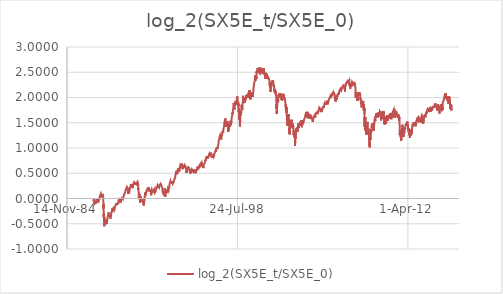
| Category | log_2(SX5E_t/SX5E_0) |
|---|---|
| 31777.0 | 0 |
| 31778.0 | 0 |
| 31779.0 | -0.015 |
| 31782.0 | -0.004 |
| 31783.0 | 0.002 |
| 31784.0 | -0.003 |
| 31785.0 | -0.022 |
| 31786.0 | -0.053 |
| 31789.0 | -0.035 |
| 31790.0 | -0.046 |
| 31791.0 | -0.04 |
| 31792.0 | -0.027 |
| 31793.0 | -0.028 |
| 31796.0 | -0.04 |
| 31797.0 | -0.042 |
| 31798.0 | -0.046 |
| 31799.0 | -0.039 |
| 31800.0 | -0.028 |
| 31803.0 | -0.049 |
| 31804.0 | -0.053 |
| 31805.0 | -0.103 |
| 31806.0 | -0.088 |
| 31807.0 | -0.068 |
| 31810.0 | -0.085 |
| 31811.0 | -0.102 |
| 31812.0 | -0.103 |
| 31813.0 | -0.113 |
| 31814.0 | -0.097 |
| 31817.0 | -0.093 |
| 31818.0 | -0.104 |
| 31819.0 | -0.105 |
| 31820.0 | -0.1 |
| 31821.0 | -0.098 |
| 31824.0 | -0.094 |
| 31825.0 | -0.112 |
| 31826.0 | -0.111 |
| 31827.0 | -0.094 |
| 31828.0 | -0.092 |
| 31831.0 | -0.102 |
| 31832.0 | -0.104 |
| 31833.0 | -0.112 |
| 31834.0 | -0.104 |
| 31835.0 | -0.099 |
| 31838.0 | -0.096 |
| 31839.0 | -0.107 |
| 31840.0 | -0.086 |
| 31841.0 | -0.075 |
| 31842.0 | -0.076 |
| 31845.0 | -0.072 |
| 31846.0 | -0.082 |
| 31847.0 | -0.093 |
| 31848.0 | -0.081 |
| 31849.0 | -0.075 |
| 31852.0 | -0.075 |
| 31853.0 | -0.086 |
| 31854.0 | -0.076 |
| 31855.0 | -0.097 |
| 31856.0 | -0.087 |
| 31859.0 | -0.066 |
| 31860.0 | -0.056 |
| 31861.0 | -0.053 |
| 31862.0 | -0.042 |
| 31863.0 | -0.029 |
| 31866.0 | -0.038 |
| 31867.0 | -0.051 |
| 31868.0 | -0.027 |
| 31869.0 | -0.02 |
| 31870.0 | -0.019 |
| 31873.0 | 0 |
| 31874.0 | -0.007 |
| 31875.0 | -0.009 |
| 31876.0 | -0.008 |
| 31877.0 | -0.026 |
| 31880.0 | -0.042 |
| 31881.0 | -0.032 |
| 31882.0 | -0.02 |
| 31883.0 | -0.009 |
| 31884.0 | -0.008 |
| 31887.0 | -0.012 |
| 31888.0 | -0.018 |
| 31889.0 | -0.001 |
| 31890.0 | -0.007 |
| 31891.0 | -0.016 |
| 31894.0 | -0.047 |
| 31895.0 | -0.035 |
| 31896.0 | -0.027 |
| 31897.0 | -0.031 |
| 31898.0 | -0.028 |
| 31901.0 | -0.033 |
| 31902.0 | -0.041 |
| 31903.0 | -0.032 |
| 31904.0 | -0.029 |
| 31905.0 | -0.029 |
| 31908.0 | -0.022 |
| 31909.0 | -0.034 |
| 31910.0 | -0.029 |
| 31911.0 | -0.029 |
| 31912.0 | -0.057 |
| 31915.0 | -0.052 |
| 31916.0 | -0.057 |
| 31917.0 | -0.073 |
| 31918.0 | -0.077 |
| 31919.0 | -0.071 |
| 31922.0 | -0.072 |
| 31923.0 | -0.059 |
| 31924.0 | -0.051 |
| 31925.0 | -0.051 |
| 31926.0 | -0.056 |
| 31929.0 | -0.046 |
| 31930.0 | -0.062 |
| 31931.0 | -0.059 |
| 31932.0 | -0.051 |
| 31933.0 | -0.059 |
| 31936.0 | -0.057 |
| 31937.0 | -0.062 |
| 31938.0 | -0.066 |
| 31939.0 | -0.053 |
| 31940.0 | -0.051 |
| 31943.0 | -0.034 |
| 31944.0 | -0.025 |
| 31945.0 | -0.024 |
| 31946.0 | -0.025 |
| 31947.0 | -0.006 |
| 31950.0 | 0.013 |
| 31951.0 | 0.023 |
| 31952.0 | 0.001 |
| 31953.0 | 0.005 |
| 31954.0 | 0.014 |
| 31957.0 | 0.014 |
| 31958.0 | 0.007 |
| 31959.0 | -0.01 |
| 31960.0 | 0.005 |
| 31961.0 | 0.027 |
| 31964.0 | 0.028 |
| 31965.0 | 0.026 |
| 31966.0 | 0.035 |
| 31967.0 | 0.032 |
| 31968.0 | 0.033 |
| 31971.0 | 0.033 |
| 31972.0 | 0.04 |
| 31973.0 | 0.044 |
| 31974.0 | 0.049 |
| 31975.0 | 0.063 |
| 31978.0 | 0.07 |
| 31979.0 | 0.064 |
| 31980.0 | 0.057 |
| 31981.0 | 0.049 |
| 31982.0 | 0.051 |
| 31985.0 | 0.057 |
| 31986.0 | 0.064 |
| 31987.0 | 0.076 |
| 31988.0 | 0.088 |
| 31989.0 | 0.086 |
| 31992.0 | 0.091 |
| 31993.0 | 0.088 |
| 31994.0 | 0.085 |
| 31995.0 | 0.094 |
| 31996.0 | 0.096 |
| 31999.0 | 0.095 |
| 32000.0 | 0.081 |
| 32001.0 | 0.094 |
| 32002.0 | 0.091 |
| 32003.0 | 0.094 |
| 32006.0 | 0.09 |
| 32007.0 | 0.076 |
| 32008.0 | 0.062 |
| 32009.0 | 0.076 |
| 32010.0 | 0.077 |
| 32013.0 | 0.064 |
| 32014.0 | 0.064 |
| 32015.0 | 0.065 |
| 32016.0 | 0.066 |
| 32017.0 | 0.073 |
| 32020.0 | 0.078 |
| 32021.0 | 0.082 |
| 32022.0 | 0.072 |
| 32023.0 | 0.061 |
| 32024.0 | 0.047 |
| 32027.0 | 0.03 |
| 32028.0 | 0.03 |
| 32029.0 | 0.03 |
| 32030.0 | 0.043 |
| 32031.0 | 0.051 |
| 32034.0 | 0.063 |
| 32035.0 | 0.056 |
| 32036.0 | 0.047 |
| 32037.0 | 0.052 |
| 32038.0 | 0.044 |
| 32041.0 | 0.041 |
| 32042.0 | 0.034 |
| 32043.0 | 0.058 |
| 32044.0 | 0.048 |
| 32045.0 | 0.043 |
| 32048.0 | 0.052 |
| 32049.0 | 0.056 |
| 32050.0 | 0.047 |
| 32051.0 | 0.059 |
| 32052.0 | 0.068 |
| 32055.0 | 0.076 |
| 32056.0 | 0.069 |
| 32057.0 | 0.055 |
| 32058.0 | 0.062 |
| 32059.0 | 0.041 |
| 32062.0 | 0.03 |
| 32063.0 | 0.033 |
| 32064.0 | 0.025 |
| 32065.0 | 0.002 |
| 32066.0 | -0.011 |
| 32069.0 | -0.13 |
| 32070.0 | -0.202 |
| 32071.0 | -0.116 |
| 32072.0 | -0.171 |
| 32073.0 | -0.192 |
| 32076.0 | -0.295 |
| 32077.0 | -0.281 |
| 32078.0 | -0.361 |
| 32079.0 | -0.382 |
| 32080.0 | -0.302 |
| 32083.0 | -0.312 |
| 32084.0 | -0.338 |
| 32085.0 | -0.386 |
| 32086.0 | -0.401 |
| 32087.0 | -0.399 |
| 32090.0 | -0.462 |
| 32091.0 | -0.549 |
| 32092.0 | -0.51 |
| 32093.0 | -0.414 |
| 32094.0 | -0.417 |
| 32097.0 | -0.374 |
| 32098.0 | -0.41 |
| 32099.0 | -0.413 |
| 32100.0 | -0.428 |
| 32101.0 | -0.464 |
| 32104.0 | -0.453 |
| 32105.0 | -0.414 |
| 32106.0 | -0.416 |
| 32107.0 | -0.425 |
| 32108.0 | -0.416 |
| 32111.0 | -0.453 |
| 32112.0 | -0.46 |
| 32113.0 | -0.46 |
| 32114.0 | -0.469 |
| 32115.0 | -0.503 |
| 32118.0 | -0.506 |
| 32119.0 | -0.497 |
| 32120.0 | -0.492 |
| 32121.0 | -0.491 |
| 32122.0 | -0.502 |
| 32125.0 | -0.494 |
| 32126.0 | -0.474 |
| 32127.0 | -0.446 |
| 32128.0 | -0.441 |
| 32129.0 | -0.452 |
| 32132.0 | -0.437 |
| 32133.0 | -0.432 |
| 32134.0 | -0.421 |
| 32135.0 | -0.424 |
| 32136.0 | -0.424 |
| 32139.0 | -0.441 |
| 32140.0 | -0.467 |
| 32141.0 | -0.457 |
| 32142.0 | -0.475 |
| 32143.0 | -0.475 |
| 32146.0 | -0.508 |
| 32147.0 | -0.452 |
| 32148.0 | -0.437 |
| 32149.0 | -0.429 |
| 32150.0 | -0.417 |
| 32153.0 | -0.471 |
| 32154.0 | -0.473 |
| 32155.0 | -0.495 |
| 32156.0 | -0.487 |
| 32157.0 | -0.48 |
| 32160.0 | -0.445 |
| 32161.0 | -0.474 |
| 32162.0 | -0.497 |
| 32163.0 | -0.508 |
| 32164.0 | -0.502 |
| 32167.0 | -0.502 |
| 32168.0 | -0.493 |
| 32169.0 | -0.499 |
| 32170.0 | -0.508 |
| 32171.0 | -0.502 |
| 32174.0 | -0.494 |
| 32175.0 | -0.495 |
| 32176.0 | -0.482 |
| 32177.0 | -0.463 |
| 32178.0 | -0.458 |
| 32181.0 | -0.448 |
| 32182.0 | -0.466 |
| 32183.0 | -0.453 |
| 32184.0 | -0.421 |
| 32185.0 | -0.409 |
| 32188.0 | -0.392 |
| 32189.0 | -0.388 |
| 32190.0 | -0.371 |
| 32191.0 | -0.37 |
| 32192.0 | -0.372 |
| 32195.0 | -0.36 |
| 32196.0 | -0.355 |
| 32197.0 | -0.349 |
| 32198.0 | -0.339 |
| 32199.0 | -0.353 |
| 32202.0 | -0.346 |
| 32203.0 | -0.332 |
| 32204.0 | -0.328 |
| 32205.0 | -0.33 |
| 32206.0 | -0.341 |
| 32209.0 | -0.363 |
| 32210.0 | -0.343 |
| 32211.0 | -0.336 |
| 32212.0 | -0.324 |
| 32213.0 | -0.337 |
| 32216.0 | -0.335 |
| 32217.0 | -0.334 |
| 32218.0 | -0.32 |
| 32219.0 | -0.35 |
| 32220.0 | -0.277 |
| 32223.0 | -0.283 |
| 32224.0 | -0.303 |
| 32225.0 | -0.301 |
| 32226.0 | -0.305 |
| 32227.0 | -0.324 |
| 32230.0 | -0.363 |
| 32231.0 | -0.351 |
| 32232.0 | -0.351 |
| 32233.0 | -0.361 |
| 32234.0 | -0.361 |
| 32237.0 | -0.365 |
| 32238.0 | -0.37 |
| 32239.0 | -0.349 |
| 32240.0 | -0.338 |
| 32241.0 | -0.339 |
| 32244.0 | -0.317 |
| 32245.0 | -0.307 |
| 32246.0 | -0.301 |
| 32247.0 | -0.312 |
| 32248.0 | -0.339 |
| 32251.0 | -0.34 |
| 32252.0 | -0.33 |
| 32253.0 | -0.34 |
| 32254.0 | -0.347 |
| 32255.0 | -0.34 |
| 32258.0 | -0.334 |
| 32259.0 | -0.331 |
| 32260.0 | -0.334 |
| 32261.0 | -0.328 |
| 32262.0 | -0.342 |
| 32265.0 | -0.344 |
| 32266.0 | -0.352 |
| 32267.0 | -0.342 |
| 32268.0 | -0.346 |
| 32269.0 | -0.349 |
| 32272.0 | -0.375 |
| 32273.0 | -0.381 |
| 32274.0 | -0.4 |
| 32275.0 | -0.405 |
| 32276.0 | -0.408 |
| 32279.0 | -0.378 |
| 32280.0 | -0.364 |
| 32281.0 | -0.369 |
| 32282.0 | -0.392 |
| 32283.0 | -0.383 |
| 32286.0 | -0.388 |
| 32287.0 | -0.385 |
| 32288.0 | -0.367 |
| 32289.0 | -0.369 |
| 32290.0 | -0.372 |
| 32293.0 | -0.359 |
| 32294.0 | -0.341 |
| 32295.0 | -0.314 |
| 32296.0 | -0.279 |
| 32297.0 | -0.299 |
| 32300.0 | -0.29 |
| 32301.0 | -0.297 |
| 32302.0 | -0.291 |
| 32303.0 | -0.265 |
| 32304.0 | -0.266 |
| 32307.0 | -0.271 |
| 32308.0 | -0.264 |
| 32309.0 | -0.26 |
| 32310.0 | -0.274 |
| 32311.0 | -0.269 |
| 32314.0 | -0.273 |
| 32315.0 | -0.268 |
| 32316.0 | -0.256 |
| 32317.0 | -0.246 |
| 32318.0 | -0.238 |
| 32321.0 | -0.24 |
| 32322.0 | -0.251 |
| 32323.0 | -0.244 |
| 32324.0 | -0.244 |
| 32325.0 | -0.227 |
| 32328.0 | -0.224 |
| 32329.0 | -0.216 |
| 32330.0 | -0.193 |
| 32331.0 | -0.202 |
| 32332.0 | -0.202 |
| 32335.0 | -0.206 |
| 32336.0 | -0.223 |
| 32337.0 | -0.232 |
| 32338.0 | -0.225 |
| 32339.0 | -0.217 |
| 32342.0 | -0.222 |
| 32343.0 | -0.231 |
| 32344.0 | -0.223 |
| 32345.0 | -0.222 |
| 32346.0 | -0.234 |
| 32349.0 | -0.236 |
| 32350.0 | -0.222 |
| 32351.0 | -0.216 |
| 32352.0 | -0.224 |
| 32353.0 | -0.208 |
| 32356.0 | -0.196 |
| 32357.0 | -0.195 |
| 32358.0 | -0.198 |
| 32359.0 | -0.199 |
| 32360.0 | -0.188 |
| 32363.0 | -0.197 |
| 32364.0 | -0.192 |
| 32365.0 | -0.217 |
| 32366.0 | -0.234 |
| 32367.0 | -0.22 |
| 32370.0 | -0.226 |
| 32371.0 | -0.232 |
| 32372.0 | -0.216 |
| 32373.0 | -0.212 |
| 32374.0 | -0.218 |
| 32377.0 | -0.22 |
| 32378.0 | -0.232 |
| 32379.0 | -0.226 |
| 32380.0 | -0.241 |
| 32381.0 | -0.244 |
| 32384.0 | -0.25 |
| 32385.0 | -0.246 |
| 32386.0 | -0.242 |
| 32387.0 | -0.249 |
| 32388.0 | -0.254 |
| 32391.0 | -0.24 |
| 32392.0 | -0.236 |
| 32393.0 | -0.23 |
| 32394.0 | -0.22 |
| 32395.0 | -0.229 |
| 32398.0 | -0.215 |
| 32399.0 | -0.208 |
| 32400.0 | -0.19 |
| 32401.0 | -0.182 |
| 32402.0 | -0.182 |
| 32405.0 | -0.174 |
| 32406.0 | -0.175 |
| 32407.0 | -0.165 |
| 32408.0 | -0.161 |
| 32409.0 | -0.167 |
| 32412.0 | -0.161 |
| 32413.0 | -0.166 |
| 32414.0 | -0.169 |
| 32415.0 | -0.157 |
| 32416.0 | -0.155 |
| 32419.0 | -0.155 |
| 32420.0 | -0.149 |
| 32421.0 | -0.145 |
| 32422.0 | -0.141 |
| 32423.0 | -0.138 |
| 32426.0 | -0.129 |
| 32427.0 | -0.139 |
| 32428.0 | -0.149 |
| 32429.0 | -0.136 |
| 32430.0 | -0.13 |
| 32433.0 | -0.126 |
| 32434.0 | -0.112 |
| 32435.0 | -0.105 |
| 32436.0 | -0.114 |
| 32437.0 | -0.114 |
| 32440.0 | -0.116 |
| 32441.0 | -0.114 |
| 32442.0 | -0.09 |
| 32443.0 | -0.107 |
| 32444.0 | -0.098 |
| 32447.0 | -0.105 |
| 32448.0 | -0.096 |
| 32449.0 | -0.103 |
| 32450.0 | -0.106 |
| 32451.0 | -0.104 |
| 32454.0 | -0.117 |
| 32455.0 | -0.106 |
| 32456.0 | -0.113 |
| 32457.0 | -0.117 |
| 32458.0 | -0.124 |
| 32461.0 | -0.133 |
| 32462.0 | -0.136 |
| 32463.0 | -0.132 |
| 32464.0 | -0.137 |
| 32465.0 | -0.127 |
| 32468.0 | -0.132 |
| 32469.0 | -0.132 |
| 32470.0 | -0.121 |
| 32471.0 | -0.118 |
| 32472.0 | -0.123 |
| 32475.0 | -0.132 |
| 32476.0 | -0.13 |
| 32477.0 | -0.121 |
| 32478.0 | -0.121 |
| 32479.0 | -0.126 |
| 32482.0 | -0.129 |
| 32483.0 | -0.123 |
| 32484.0 | -0.111 |
| 32485.0 | -0.112 |
| 32486.0 | -0.095 |
| 32489.0 | -0.108 |
| 32490.0 | -0.108 |
| 32491.0 | -0.113 |
| 32492.0 | -0.114 |
| 32493.0 | -0.102 |
| 32496.0 | -0.089 |
| 32497.0 | -0.076 |
| 32498.0 | -0.078 |
| 32499.0 | -0.095 |
| 32500.0 | -0.073 |
| 32503.0 | -0.074 |
| 32504.0 | -0.065 |
| 32505.0 | -0.068 |
| 32506.0 | -0.065 |
| 32507.0 | -0.065 |
| 32510.0 | -0.057 |
| 32511.0 | -0.047 |
| 32512.0 | -0.04 |
| 32513.0 | -0.028 |
| 32514.0 | -0.027 |
| 32517.0 | -0.024 |
| 32518.0 | -0.032 |
| 32519.0 | -0.031 |
| 32520.0 | -0.026 |
| 32521.0 | -0.025 |
| 32524.0 | -0.025 |
| 32525.0 | -0.031 |
| 32526.0 | -0.033 |
| 32527.0 | -0.02 |
| 32528.0 | -0.025 |
| 32531.0 | -0.034 |
| 32532.0 | -0.024 |
| 32533.0 | -0.013 |
| 32534.0 | -0.021 |
| 32535.0 | -0.016 |
| 32538.0 | -0.021 |
| 32539.0 | -0.032 |
| 32540.0 | -0.041 |
| 32541.0 | -0.037 |
| 32542.0 | -0.027 |
| 32545.0 | -0.025 |
| 32546.0 | -0.027 |
| 32547.0 | -0.015 |
| 32548.0 | -0.019 |
| 32549.0 | -0.021 |
| 32552.0 | -0.039 |
| 32553.0 | -0.036 |
| 32554.0 | -0.049 |
| 32555.0 | -0.045 |
| 32556.0 | -0.051 |
| 32559.0 | -0.039 |
| 32560.0 | -0.042 |
| 32561.0 | -0.055 |
| 32562.0 | -0.072 |
| 32563.0 | -0.06 |
| 32566.0 | -0.092 |
| 32567.0 | -0.079 |
| 32568.0 | -0.067 |
| 32569.0 | -0.066 |
| 32570.0 | -0.048 |
| 32573.0 | -0.035 |
| 32574.0 | -0.037 |
| 32575.0 | -0.046 |
| 32576.0 | -0.044 |
| 32577.0 | -0.049 |
| 32580.0 | -0.046 |
| 32581.0 | -0.04 |
| 32582.0 | -0.031 |
| 32583.0 | -0.029 |
| 32584.0 | -0.034 |
| 32587.0 | -0.078 |
| 32588.0 | -0.042 |
| 32589.0 | -0.042 |
| 32590.0 | -0.041 |
| 32591.0 | -0.04 |
| 32594.0 | -0.044 |
| 32595.0 | -0.041 |
| 32596.0 | -0.033 |
| 32597.0 | -0.03 |
| 32598.0 | -0.027 |
| 32601.0 | -0.016 |
| 32602.0 | -0.014 |
| 32603.0 | -0.012 |
| 32604.0 | -0.018 |
| 32605.0 | -0.015 |
| 32608.0 | -0.008 |
| 32609.0 | -0.002 |
| 32610.0 | 0.003 |
| 32611.0 | 0.002 |
| 32612.0 | 0.007 |
| 32615.0 | 0.014 |
| 32616.0 | 0.017 |
| 32617.0 | 0.018 |
| 32618.0 | 0.013 |
| 32619.0 | 0.013 |
| 32622.0 | 0.013 |
| 32623.0 | 0.006 |
| 32624.0 | 0.001 |
| 32625.0 | 0.002 |
| 32626.0 | 0.001 |
| 32629.0 | 0 |
| 32630.0 | -0.003 |
| 32631.0 | -0.005 |
| 32632.0 | -0.006 |
| 32633.0 | 0.006 |
| 32636.0 | -0.001 |
| 32637.0 | -0.003 |
| 32638.0 | -0.007 |
| 32639.0 | -0.011 |
| 32640.0 | -0.013 |
| 32643.0 | -0.015 |
| 32644.0 | -0.015 |
| 32645.0 | -0.017 |
| 32646.0 | -0.008 |
| 32647.0 | -0.004 |
| 32650.0 | 0.002 |
| 32651.0 | 0.006 |
| 32652.0 | 0.008 |
| 32653.0 | 0.02 |
| 32654.0 | 0.022 |
| 32657.0 | 0.031 |
| 32658.0 | 0.036 |
| 32659.0 | 0.036 |
| 32660.0 | 0.038 |
| 32661.0 | 0.04 |
| 32664.0 | 0.047 |
| 32665.0 | 0.045 |
| 32666.0 | 0.052 |
| 32667.0 | 0.061 |
| 32668.0 | 0.063 |
| 32671.0 | 0.069 |
| 32672.0 | 0.069 |
| 32673.0 | 0.073 |
| 32674.0 | 0.065 |
| 32675.0 | 0.066 |
| 32678.0 | 0.075 |
| 32679.0 | 0.089 |
| 32680.0 | 0.087 |
| 32681.0 | 0.09 |
| 32682.0 | 0.089 |
| 32685.0 | 0.096 |
| 32686.0 | 0.092 |
| 32687.0 | 0.101 |
| 32688.0 | 0.097 |
| 32689.0 | 0.082 |
| 32692.0 | 0.09 |
| 32693.0 | 0.097 |
| 32694.0 | 0.086 |
| 32695.0 | 0.087 |
| 32696.0 | 0.094 |
| 32699.0 | 0.1 |
| 32700.0 | 0.109 |
| 32701.0 | 0.108 |
| 32702.0 | 0.118 |
| 32703.0 | 0.123 |
| 32706.0 | 0.121 |
| 32707.0 | 0.123 |
| 32708.0 | 0.13 |
| 32709.0 | 0.138 |
| 32710.0 | 0.141 |
| 32713.0 | 0.127 |
| 32714.0 | 0.135 |
| 32715.0 | 0.143 |
| 32716.0 | 0.147 |
| 32717.0 | 0.146 |
| 32720.0 | 0.148 |
| 32721.0 | 0.16 |
| 32722.0 | 0.163 |
| 32723.0 | 0.157 |
| 32724.0 | 0.174 |
| 32727.0 | 0.177 |
| 32728.0 | 0.18 |
| 32729.0 | 0.183 |
| 32730.0 | 0.177 |
| 32731.0 | 0.183 |
| 32734.0 | 0.179 |
| 32735.0 | 0.168 |
| 32736.0 | 0.178 |
| 32737.0 | 0.18 |
| 32738.0 | 0.176 |
| 32741.0 | 0.186 |
| 32742.0 | 0.181 |
| 32743.0 | 0.18 |
| 32744.0 | 0.188 |
| 32745.0 | 0.203 |
| 32748.0 | 0.2 |
| 32749.0 | 0.195 |
| 32750.0 | 0.199 |
| 32751.0 | 0.205 |
| 32752.0 | 0.208 |
| 32755.0 | 0.22 |
| 32756.0 | 0.23 |
| 32757.0 | 0.219 |
| 32758.0 | 0.228 |
| 32759.0 | 0.233 |
| 32762.0 | 0.228 |
| 32763.0 | 0.224 |
| 32764.0 | 0.22 |
| 32765.0 | 0.219 |
| 32766.0 | 0.217 |
| 32769.0 | 0.222 |
| 32770.0 | 0.217 |
| 32771.0 | 0.215 |
| 32772.0 | 0.215 |
| 32773.0 | 0.224 |
| 32776.0 | 0.222 |
| 32777.0 | 0.215 |
| 32778.0 | 0.21 |
| 32779.0 | 0.209 |
| 32780.0 | 0.197 |
| 32783.0 | 0.19 |
| 32784.0 | 0.207 |
| 32785.0 | 0.211 |
| 32786.0 | 0.209 |
| 32787.0 | 0.218 |
| 32790.0 | 0.229 |
| 32791.0 | 0.228 |
| 32792.0 | 0.211 |
| 32793.0 | 0.211 |
| 32794.0 | 0.201 |
| 32797.0 | 0.093 |
| 32798.0 | 0.123 |
| 32799.0 | 0.127 |
| 32800.0 | 0.153 |
| 32801.0 | 0.15 |
| 32804.0 | 0.153 |
| 32805.0 | 0.127 |
| 32806.0 | 0.112 |
| 32807.0 | 0.109 |
| 32808.0 | 0.09 |
| 32811.0 | 0.101 |
| 32812.0 | 0.107 |
| 32813.0 | 0.11 |
| 32814.0 | 0.107 |
| 32815.0 | 0.094 |
| 32818.0 | 0.09 |
| 32819.0 | 0.073 |
| 32820.0 | 0.084 |
| 32821.0 | 0.092 |
| 32822.0 | 0.108 |
| 32825.0 | 0.125 |
| 32826.0 | 0.119 |
| 32827.0 | 0.112 |
| 32828.0 | 0.129 |
| 32829.0 | 0.13 |
| 32832.0 | 0.136 |
| 32833.0 | 0.129 |
| 32834.0 | 0.137 |
| 32835.0 | 0.146 |
| 32836.0 | 0.159 |
| 32839.0 | 0.165 |
| 32840.0 | 0.165 |
| 32841.0 | 0.171 |
| 32842.0 | 0.184 |
| 32843.0 | 0.199 |
| 32846.0 | 0.214 |
| 32847.0 | 0.208 |
| 32848.0 | 0.22 |
| 32849.0 | 0.223 |
| 32850.0 | 0.222 |
| 32853.0 | 0.219 |
| 32854.0 | 0.218 |
| 32855.0 | 0.216 |
| 32856.0 | 0.212 |
| 32857.0 | 0.215 |
| 32860.0 | 0.211 |
| 32861.0 | 0.205 |
| 32862.0 | 0.221 |
| 32863.0 | 0.232 |
| 32864.0 | 0.235 |
| 32867.0 | 0.235 |
| 32868.0 | 0.24 |
| 32869.0 | 0.265 |
| 32870.0 | 0.282 |
| 32871.0 | 0.286 |
| 32874.0 | 0.286 |
| 32875.0 | 0.29 |
| 32876.0 | 0.305 |
| 32877.0 | 0.305 |
| 32878.0 | 0.288 |
| 32881.0 | 0.294 |
| 32882.0 | 0.3 |
| 32883.0 | 0.288 |
| 32884.0 | 0.303 |
| 32885.0 | 0.289 |
| 32888.0 | 0.28 |
| 32889.0 | 0.258 |
| 32890.0 | 0.269 |
| 32891.0 | 0.25 |
| 32892.0 | 0.247 |
| 32895.0 | 0.248 |
| 32896.0 | 0.251 |
| 32897.0 | 0.219 |
| 32898.0 | 0.237 |
| 32899.0 | 0.237 |
| 32902.0 | 0.24 |
| 32903.0 | 0.245 |
| 32904.0 | 0.248 |
| 32905.0 | 0.264 |
| 32906.0 | 0.287 |
| 32909.0 | 0.303 |
| 32910.0 | 0.3 |
| 32911.0 | 0.28 |
| 32912.0 | 0.291 |
| 32913.0 | 0.277 |
| 32916.0 | 0.256 |
| 32917.0 | 0.244 |
| 32918.0 | 0.246 |
| 32919.0 | 0.251 |
| 32920.0 | 0.273 |
| 32923.0 | 0.254 |
| 32924.0 | 0.226 |
| 32925.0 | 0.217 |
| 32926.0 | 0.225 |
| 32927.0 | 0.205 |
| 32930.0 | 0.195 |
| 32931.0 | 0.214 |
| 32932.0 | 0.22 |
| 32933.0 | 0.207 |
| 32934.0 | 0.231 |
| 32937.0 | 0.241 |
| 32938.0 | 0.239 |
| 32939.0 | 0.254 |
| 32940.0 | 0.265 |
| 32941.0 | 0.272 |
| 32944.0 | 0.265 |
| 32945.0 | 0.273 |
| 32946.0 | 0.278 |
| 32947.0 | 0.29 |
| 32948.0 | 0.296 |
| 32951.0 | 0.3 |
| 32952.0 | 0.292 |
| 32953.0 | 0.307 |
| 32954.0 | 0.295 |
| 32955.0 | 0.298 |
| 32958.0 | 0.308 |
| 32959.0 | 0.299 |
| 32960.0 | 0.299 |
| 32961.0 | 0.306 |
| 32962.0 | 0.308 |
| 32965.0 | 0.292 |
| 32966.0 | 0.311 |
| 32967.0 | 0.311 |
| 32968.0 | 0.315 |
| 32969.0 | 0.323 |
| 32972.0 | 0.315 |
| 32973.0 | 0.313 |
| 32974.0 | 0.318 |
| 32975.0 | 0.324 |
| 32976.0 | 0.324 |
| 32979.0 | 0.328 |
| 32980.0 | 0.331 |
| 32981.0 | 0.321 |
| 32982.0 | 0.315 |
| 32983.0 | 0.323 |
| 32986.0 | 0.299 |
| 32987.0 | 0.296 |
| 32988.0 | 0.294 |
| 32989.0 | 0.282 |
| 32990.0 | 0.277 |
| 32993.0 | 0.272 |
| 32994.0 | 0.272 |
| 32995.0 | 0.286 |
| 32996.0 | 0.304 |
| 32997.0 | 0.312 |
| 33000.0 | 0.325 |
| 33001.0 | 0.318 |
| 33002.0 | 0.314 |
| 33003.0 | 0.309 |
| 33004.0 | 0.302 |
| 33007.0 | 0.304 |
| 33008.0 | 0.3 |
| 33009.0 | 0.298 |
| 33010.0 | 0.305 |
| 33011.0 | 0.301 |
| 33014.0 | 0.286 |
| 33015.0 | 0.297 |
| 33016.0 | 0.303 |
| 33017.0 | 0.302 |
| 33018.0 | 0.291 |
| 33021.0 | 0.287 |
| 33022.0 | 0.304 |
| 33023.0 | 0.311 |
| 33024.0 | 0.31 |
| 33025.0 | 0.309 |
| 33028.0 | 0.314 |
| 33029.0 | 0.319 |
| 33030.0 | 0.299 |
| 33031.0 | 0.297 |
| 33032.0 | 0.287 |
| 33035.0 | 0.28 |
| 33036.0 | 0.278 |
| 33037.0 | 0.281 |
| 33038.0 | 0.285 |
| 33039.0 | 0.274 |
| 33042.0 | 0.267 |
| 33043.0 | 0.286 |
| 33044.0 | 0.292 |
| 33045.0 | 0.296 |
| 33046.0 | 0.305 |
| 33049.0 | 0.313 |
| 33050.0 | 0.319 |
| 33051.0 | 0.317 |
| 33052.0 | 0.317 |
| 33053.0 | 0.315 |
| 33056.0 | 0.319 |
| 33057.0 | 0.316 |
| 33058.0 | 0.315 |
| 33059.0 | 0.306 |
| 33060.0 | 0.307 |
| 33063.0 | 0.302 |
| 33064.0 | 0.289 |
| 33065.0 | 0.301 |
| 33066.0 | 0.313 |
| 33067.0 | 0.316 |
| 33070.0 | 0.324 |
| 33071.0 | 0.332 |
| 33072.0 | 0.331 |
| 33073.0 | 0.333 |
| 33074.0 | 0.335 |
| 33077.0 | 0.315 |
| 33078.0 | 0.315 |
| 33079.0 | 0.317 |
| 33080.0 | 0.315 |
| 33081.0 | 0.305 |
| 33084.0 | 0.298 |
| 33085.0 | 0.31 |
| 33086.0 | 0.3 |
| 33087.0 | 0.284 |
| 33088.0 | 0.252 |
| 33091.0 | 0.181 |
| 33092.0 | 0.206 |
| 33093.0 | 0.175 |
| 33094.0 | 0.185 |
| 33095.0 | 0.181 |
| 33098.0 | 0.146 |
| 33099.0 | 0.156 |
| 33100.0 | 0.153 |
| 33101.0 | 0.161 |
| 33102.0 | 0.117 |
| 33105.0 | 0.081 |
| 33106.0 | 0.031 |
| 33107.0 | 0.046 |
| 33108.0 | 0.004 |
| 33109.0 | 0.03 |
| 33112.0 | 0.098 |
| 33113.0 | 0.086 |
| 33114.0 | 0.095 |
| 33115.0 | 0.106 |
| 33116.0 | 0.095 |
| 33119.0 | 0.089 |
| 33120.0 | 0.062 |
| 33121.0 | 0.062 |
| 33122.0 | 0.055 |
| 33123.0 | 0.058 |
| 33126.0 | 0.086 |
| 33127.0 | 0.073 |
| 33128.0 | 0.084 |
| 33129.0 | 0.081 |
| 33130.0 | 0.052 |
| 33133.0 | 0.037 |
| 33134.0 | 0.01 |
| 33135.0 | 0.005 |
| 33136.0 | -0.016 |
| 33137.0 | -0.023 |
| 33140.0 | -0.048 |
| 33141.0 | -0.082 |
| 33142.0 | -0.066 |
| 33143.0 | -0.066 |
| 33144.0 | -0.091 |
| 33147.0 | -0.041 |
| 33148.0 | -0.007 |
| 33149.0 | -0.015 |
| 33150.0 | -0.032 |
| 33151.0 | -0.055 |
| 33154.0 | -0.011 |
| 33155.0 | -0.037 |
| 33156.0 | -0.056 |
| 33157.0 | -0.051 |
| 33158.0 | -0.026 |
| 33161.0 | -0.015 |
| 33162.0 | -0.018 |
| 33163.0 | -0.023 |
| 33164.0 | 0.001 |
| 33165.0 | 0.015 |
| 33168.0 | 0.005 |
| 33169.0 | 0.039 |
| 33170.0 | 0.037 |
| 33171.0 | 0.025 |
| 33172.0 | -0.003 |
| 33175.0 | -0.007 |
| 33176.0 | -0.023 |
| 33177.0 | -0.018 |
| 33178.0 | -0.026 |
| 33179.0 | -0.031 |
| 33182.0 | -0.037 |
| 33183.0 | -0.039 |
| 33184.0 | -0.059 |
| 33185.0 | -0.071 |
| 33186.0 | -0.065 |
| 33189.0 | -0.046 |
| 33190.0 | -0.041 |
| 33191.0 | -0.049 |
| 33192.0 | -0.048 |
| 33193.0 | -0.047 |
| 33196.0 | -0.029 |
| 33197.0 | -0.025 |
| 33198.0 | -0.029 |
| 33199.0 | -0.018 |
| 33200.0 | -0.02 |
| 33203.0 | -0.047 |
| 33204.0 | -0.061 |
| 33205.0 | -0.06 |
| 33206.0 | -0.052 |
| 33207.0 | -0.046 |
| 33210.0 | -0.016 |
| 33211.0 | -0.027 |
| 33212.0 | -0.012 |
| 33213.0 | 0.009 |
| 33214.0 | 0.017 |
| 33217.0 | 0.012 |
| 33218.0 | 0.005 |
| 33219.0 | 0.012 |
| 33220.0 | 0.017 |
| 33221.0 | 0.014 |
| 33224.0 | -0.013 |
| 33225.0 | -0.012 |
| 33226.0 | -0.02 |
| 33227.0 | -0.049 |
| 33228.0 | -0.045 |
| 33231.0 | -0.055 |
| 33232.0 | -0.048 |
| 33233.0 | -0.057 |
| 33234.0 | -0.057 |
| 33235.0 | -0.064 |
| 33238.0 | -0.069 |
| 33239.0 | -0.069 |
| 33240.0 | -0.081 |
| 33241.0 | -0.076 |
| 33242.0 | -0.06 |
| 33245.0 | -0.089 |
| 33246.0 | -0.097 |
| 33247.0 | -0.074 |
| 33248.0 | -0.09 |
| 33249.0 | -0.095 |
| 33252.0 | -0.138 |
| 33253.0 | -0.135 |
| 33254.0 | -0.133 |
| 33255.0 | -0.051 |
| 33256.0 | -0.062 |
| 33259.0 | -0.076 |
| 33260.0 | -0.086 |
| 33261.0 | -0.101 |
| 33262.0 | -0.08 |
| 33263.0 | -0.071 |
| 33266.0 | -0.069 |
| 33267.0 | -0.078 |
| 33268.0 | -0.055 |
| 33269.0 | -0.047 |
| 33270.0 | -0.047 |
| 33273.0 | -0.038 |
| 33274.0 | -0.028 |
| 33275.0 | -0.032 |
| 33276.0 | -0.018 |
| 33277.0 | -0.002 |
| 33280.0 | 0.022 |
| 33281.0 | 0.013 |
| 33282.0 | 0.025 |
| 33283.0 | 0.035 |
| 33284.0 | 0.053 |
| 33287.0 | 0.078 |
| 33288.0 | 0.087 |
| 33289.0 | 0.071 |
| 33290.0 | 0.075 |
| 33291.0 | 0.092 |
| 33294.0 | 0.109 |
| 33295.0 | 0.081 |
| 33296.0 | 0.086 |
| 33297.0 | 0.091 |
| 33298.0 | 0.075 |
| 33301.0 | 0.086 |
| 33302.0 | 0.098 |
| 33303.0 | 0.125 |
| 33304.0 | 0.127 |
| 33305.0 | 0.137 |
| 33308.0 | 0.121 |
| 33309.0 | 0.122 |
| 33310.0 | 0.106 |
| 33311.0 | 0.13 |
| 33312.0 | 0.125 |
| 33315.0 | 0.12 |
| 33316.0 | 0.111 |
| 33317.0 | 0.099 |
| 33318.0 | 0.107 |
| 33319.0 | 0.102 |
| 33322.0 | 0.107 |
| 33323.0 | 0.102 |
| 33324.0 | 0.108 |
| 33325.0 | 0.124 |
| 33326.0 | 0.125 |
| 33329.0 | 0.134 |
| 33330.0 | 0.13 |
| 33331.0 | 0.149 |
| 33332.0 | 0.145 |
| 33333.0 | 0.154 |
| 33336.0 | 0.144 |
| 33337.0 | 0.15 |
| 33338.0 | 0.134 |
| 33339.0 | 0.144 |
| 33340.0 | 0.152 |
| 33343.0 | 0.16 |
| 33344.0 | 0.153 |
| 33345.0 | 0.169 |
| 33346.0 | 0.169 |
| 33347.0 | 0.161 |
| 33350.0 | 0.144 |
| 33351.0 | 0.157 |
| 33352.0 | 0.161 |
| 33353.0 | 0.17 |
| 33354.0 | 0.148 |
| 33357.0 | 0.161 |
| 33358.0 | 0.154 |
| 33359.0 | 0.158 |
| 33360.0 | 0.175 |
| 33361.0 | 0.177 |
| 33364.0 | 0.179 |
| 33365.0 | 0.179 |
| 33366.0 | 0.17 |
| 33367.0 | 0.172 |
| 33368.0 | 0.185 |
| 33371.0 | 0.173 |
| 33372.0 | 0.169 |
| 33373.0 | 0.158 |
| 33374.0 | 0.163 |
| 33375.0 | 0.158 |
| 33378.0 | 0.16 |
| 33379.0 | 0.173 |
| 33380.0 | 0.181 |
| 33381.0 | 0.18 |
| 33382.0 | 0.181 |
| 33385.0 | 0.185 |
| 33386.0 | 0.19 |
| 33387.0 | 0.195 |
| 33388.0 | 0.201 |
| 33389.0 | 0.215 |
| 33392.0 | 0.218 |
| 33393.0 | 0.213 |
| 33394.0 | 0.223 |
| 33395.0 | 0.215 |
| 33396.0 | 0.212 |
| 33399.0 | 0.211 |
| 33400.0 | 0.221 |
| 33401.0 | 0.209 |
| 33402.0 | 0.206 |
| 33403.0 | 0.217 |
| 33406.0 | 0.209 |
| 33407.0 | 0.204 |
| 33408.0 | 0.192 |
| 33409.0 | 0.186 |
| 33410.0 | 0.198 |
| 33413.0 | 0.18 |
| 33414.0 | 0.181 |
| 33415.0 | 0.172 |
| 33416.0 | 0.172 |
| 33417.0 | 0.155 |
| 33420.0 | 0.157 |
| 33421.0 | 0.152 |
| 33422.0 | 0.141 |
| 33423.0 | 0.138 |
| 33424.0 | 0.15 |
| 33427.0 | 0.132 |
| 33428.0 | 0.145 |
| 33429.0 | 0.16 |
| 33430.0 | 0.15 |
| 33431.0 | 0.148 |
| 33434.0 | 0.154 |
| 33435.0 | 0.154 |
| 33436.0 | 0.145 |
| 33437.0 | 0.145 |
| 33438.0 | 0.154 |
| 33441.0 | 0.155 |
| 33442.0 | 0.161 |
| 33443.0 | 0.157 |
| 33444.0 | 0.155 |
| 33445.0 | 0.146 |
| 33448.0 | 0.145 |
| 33449.0 | 0.151 |
| 33450.0 | 0.152 |
| 33451.0 | 0.156 |
| 33452.0 | 0.152 |
| 33455.0 | 0.154 |
| 33456.0 | 0.145 |
| 33457.0 | 0.159 |
| 33458.0 | 0.157 |
| 33459.0 | 0.156 |
| 33462.0 | 0.152 |
| 33463.0 | 0.163 |
| 33464.0 | 0.168 |
| 33465.0 | 0.169 |
| 33466.0 | 0.171 |
| 33469.0 | 0.065 |
| 33470.0 | 0.096 |
| 33471.0 | 0.125 |
| 33472.0 | 0.156 |
| 33473.0 | 0.161 |
| 33476.0 | 0.172 |
| 33477.0 | 0.17 |
| 33478.0 | 0.167 |
| 33479.0 | 0.171 |
| 33480.0 | 0.174 |
| 33483.0 | 0.175 |
| 33484.0 | 0.178 |
| 33485.0 | 0.178 |
| 33486.0 | 0.179 |
| 33487.0 | 0.176 |
| 33490.0 | 0.168 |
| 33491.0 | 0.159 |
| 33492.0 | 0.155 |
| 33493.0 | 0.161 |
| 33494.0 | 0.163 |
| 33497.0 | 0.165 |
| 33498.0 | 0.165 |
| 33499.0 | 0.169 |
| 33500.0 | 0.167 |
| 33501.0 | 0.169 |
| 33504.0 | 0.164 |
| 33505.0 | 0.171 |
| 33506.0 | 0.165 |
| 33507.0 | 0.164 |
| 33508.0 | 0.159 |
| 33511.0 | 0.161 |
| 33512.0 | 0.162 |
| 33513.0 | 0.158 |
| 33514.0 | 0.154 |
| 33515.0 | 0.147 |
| 33518.0 | 0.143 |
| 33519.0 | 0.142 |
| 33520.0 | 0.133 |
| 33521.0 | 0.138 |
| 33522.0 | 0.136 |
| 33525.0 | 0.137 |
| 33526.0 | 0.151 |
| 33527.0 | 0.15 |
| 33528.0 | 0.149 |
| 33529.0 | 0.15 |
| 33532.0 | 0.15 |
| 33533.0 | 0.156 |
| 33534.0 | 0.155 |
| 33535.0 | 0.148 |
| 33536.0 | 0.14 |
| 33539.0 | 0.154 |
| 33540.0 | 0.155 |
| 33541.0 | 0.151 |
| 33542.0 | 0.155 |
| 33543.0 | 0.149 |
| 33546.0 | 0.143 |
| 33547.0 | 0.149 |
| 33548.0 | 0.142 |
| 33549.0 | 0.149 |
| 33550.0 | 0.165 |
| 33553.0 | 0.165 |
| 33554.0 | 0.172 |
| 33555.0 | 0.175 |
| 33556.0 | 0.18 |
| 33557.0 | 0.182 |
| 33560.0 | 0.155 |
| 33561.0 | 0.14 |
| 33562.0 | 0.142 |
| 33563.0 | 0.14 |
| 33564.0 | 0.142 |
| 33567.0 | 0.134 |
| 33568.0 | 0.143 |
| 33569.0 | 0.138 |
| 33570.0 | 0.137 |
| 33571.0 | 0.13 |
| 33574.0 | 0.113 |
| 33575.0 | 0.123 |
| 33576.0 | 0.122 |
| 33577.0 | 0.121 |
| 33578.0 | 0.113 |
| 33581.0 | 0.106 |
| 33582.0 | 0.093 |
| 33583.0 | 0.096 |
| 33584.0 | 0.105 |
| 33585.0 | 0.118 |
| 33588.0 | 0.119 |
| 33589.0 | 0.123 |
| 33590.0 | 0.131 |
| 33591.0 | 0.116 |
| 33592.0 | 0.097 |
| 33595.0 | 0.1 |
| 33596.0 | 0.116 |
| 33597.0 | 0.116 |
| 33598.0 | 0.118 |
| 33599.0 | 0.13 |
| 33602.0 | 0.146 |
| 33603.0 | 0.151 |
| 33605.0 | 0.156 |
| 33606.0 | 0.152 |
| 33609.0 | 0.171 |
| 33610.0 | 0.169 |
| 33611.0 | 0.156 |
| 33612.0 | 0.157 |
| 33613.0 | 0.18 |
| 33616.0 | 0.183 |
| 33617.0 | 0.192 |
| 33618.0 | 0.222 |
| 33619.0 | 0.222 |
| 33620.0 | 0.215 |
| 33623.0 | 0.22 |
| 33624.0 | 0.227 |
| 33625.0 | 0.216 |
| 33626.0 | 0.207 |
| 33627.0 | 0.208 |
| 33630.0 | 0.23 |
| 33631.0 | 0.229 |
| 33632.0 | 0.224 |
| 33633.0 | 0.223 |
| 33634.0 | 0.215 |
| 33637.0 | 0.23 |
| 33638.0 | 0.213 |
| 33639.0 | 0.232 |
| 33640.0 | 0.227 |
| 33641.0 | 0.237 |
| 33644.0 | 0.211 |
| 33645.0 | 0.217 |
| 33646.0 | 0.216 |
| 33647.0 | 0.223 |
| 33648.0 | 0.22 |
| 33651.0 | 0.218 |
| 33652.0 | 0.238 |
| 33653.0 | 0.232 |
| 33654.0 | 0.245 |
| 33655.0 | 0.244 |
| 33658.0 | 0.254 |
| 33659.0 | 0.243 |
| 33660.0 | 0.265 |
| 33661.0 | 0.273 |
| 33662.0 | 0.265 |
| 33665.0 | 0.267 |
| 33666.0 | 0.269 |
| 33667.0 | 0.276 |
| 33668.0 | 0.268 |
| 33669.0 | 0.264 |
| 33672.0 | 0.266 |
| 33673.0 | 0.267 |
| 33674.0 | 0.26 |
| 33675.0 | 0.25 |
| 33676.0 | 0.246 |
| 33679.0 | 0.244 |
| 33680.0 | 0.246 |
| 33681.0 | 0.243 |
| 33682.0 | 0.239 |
| 33683.0 | 0.249 |
| 33686.0 | 0.231 |
| 33687.0 | 0.23 |
| 33688.0 | 0.233 |
| 33689.0 | 0.238 |
| 33690.0 | 0.232 |
| 33693.0 | 0.236 |
| 33694.0 | 0.236 |
| 33695.0 | 0.233 |
| 33696.0 | 0.236 |
| 33697.0 | 0.237 |
| 33700.0 | 0.247 |
| 33701.0 | 0.253 |
| 33702.0 | 0.222 |
| 33703.0 | 0.227 |
| 33704.0 | 0.247 |
| 33707.0 | 0.242 |
| 33708.0 | 0.239 |
| 33709.0 | 0.26 |
| 33710.0 | 0.248 |
| 33711.0 | 0.248 |
| 33714.0 | 0.263 |
| 33715.0 | 0.262 |
| 33716.0 | 0.261 |
| 33717.0 | 0.261 |
| 33718.0 | 0.26 |
| 33721.0 | 0.261 |
| 33722.0 | 0.264 |
| 33723.0 | 0.268 |
| 33724.0 | 0.268 |
| 33725.0 | 0.265 |
| 33728.0 | 0.263 |
| 33729.0 | 0.268 |
| 33730.0 | 0.271 |
| 33731.0 | 0.274 |
| 33732.0 | 0.279 |
| 33735.0 | 0.287 |
| 33736.0 | 0.277 |
| 33737.0 | 0.274 |
| 33738.0 | 0.262 |
| 33739.0 | 0.272 |
| 33742.0 | 0.274 |
| 33743.0 | 0.276 |
| 33744.0 | 0.277 |
| 33745.0 | 0.279 |
| 33746.0 | 0.293 |
| 33749.0 | 0.299 |
| 33750.0 | 0.29 |
| 33751.0 | 0.286 |
| 33752.0 | 0.287 |
| 33753.0 | 0.295 |
| 33756.0 | 0.293 |
| 33757.0 | 0.29 |
| 33758.0 | 0.289 |
| 33759.0 | 0.285 |
| 33760.0 | 0.28 |
| 33763.0 | 0.278 |
| 33764.0 | 0.268 |
| 33765.0 | 0.27 |
| 33766.0 | 0.259 |
| 33767.0 | 0.26 |
| 33770.0 | 0.252 |
| 33771.0 | 0.258 |
| 33772.0 | 0.251 |
| 33773.0 | 0.24 |
| 33774.0 | 0.241 |
| 33777.0 | 0.238 |
| 33778.0 | 0.24 |
| 33779.0 | 0.236 |
| 33780.0 | 0.235 |
| 33781.0 | 0.239 |
| 33784.0 | 0.23 |
| 33785.0 | 0.231 |
| 33786.0 | 0.219 |
| 33787.0 | 0.232 |
| 33788.0 | 0.233 |
| 33791.0 | 0.226 |
| 33792.0 | 0.223 |
| 33793.0 | 0.217 |
| 33794.0 | 0.228 |
| 33795.0 | 0.232 |
| 33798.0 | 0.216 |
| 33799.0 | 0.214 |
| 33800.0 | 0.208 |
| 33801.0 | 0.215 |
| 33802.0 | 0.185 |
| 33805.0 | 0.149 |
| 33806.0 | 0.149 |
| 33807.0 | 0.137 |
| 33808.0 | 0.136 |
| 33809.0 | 0.119 |
| 33812.0 | 0.126 |
| 33813.0 | 0.126 |
| 33814.0 | 0.135 |
| 33815.0 | 0.141 |
| 33816.0 | 0.135 |
| 33819.0 | 0.133 |
| 33820.0 | 0.14 |
| 33821.0 | 0.141 |
| 33822.0 | 0.147 |
| 33823.0 | 0.129 |
| 33826.0 | 0.115 |
| 33827.0 | 0.095 |
| 33828.0 | 0.088 |
| 33829.0 | 0.08 |
| 33830.0 | 0.098 |
| 33833.0 | 0.099 |
| 33834.0 | 0.086 |
| 33835.0 | 0.088 |
| 33836.0 | 0.085 |
| 33837.0 | 0.104 |
| 33840.0 | 0.064 |
| 33841.0 | 0.054 |
| 33842.0 | 0.052 |
| 33843.0 | 0.065 |
| 33844.0 | 0.067 |
| 33847.0 | 0.079 |
| 33848.0 | 0.07 |
| 33849.0 | 0.069 |
| 33850.0 | 0.099 |
| 33851.0 | 0.105 |
| 33854.0 | 0.098 |
| 33855.0 | 0.094 |
| 33856.0 | 0.089 |
| 33857.0 | 0.083 |
| 33858.0 | 0.101 |
| 33861.0 | 0.159 |
| 33862.0 | 0.139 |
| 33863.0 | 0.177 |
| 33864.0 | 0.159 |
| 33865.0 | 0.202 |
| 33868.0 | 0.17 |
| 33869.0 | 0.18 |
| 33870.0 | 0.161 |
| 33871.0 | 0.165 |
| 33872.0 | 0.154 |
| 33875.0 | 0.111 |
| 33876.0 | 0.107 |
| 33877.0 | 0.105 |
| 33878.0 | 0.09 |
| 33879.0 | 0.108 |
| 33882.0 | 0.031 |
| 33883.0 | 0.044 |
| 33884.0 | 0.049 |
| 33885.0 | 0.069 |
| 33886.0 | 0.08 |
| 33889.0 | 0.083 |
| 33890.0 | 0.092 |
| 33891.0 | 0.086 |
| 33892.0 | 0.077 |
| 33893.0 | 0.085 |
| 33896.0 | 0.081 |
| 33897.0 | 0.118 |
| 33898.0 | 0.096 |
| 33899.0 | 0.115 |
| 33900.0 | 0.134 |
| 33903.0 | 0.139 |
| 33904.0 | 0.134 |
| 33905.0 | 0.127 |
| 33906.0 | 0.12 |
| 33907.0 | 0.122 |
| 33910.0 | 0.121 |
| 33911.0 | 0.132 |
| 33912.0 | 0.133 |
| 33913.0 | 0.127 |
| 33914.0 | 0.12 |
| 33917.0 | 0.134 |
| 33918.0 | 0.15 |
| 33919.0 | 0.15 |
| 33920.0 | 0.155 |
| 33921.0 | 0.163 |
| 33924.0 | 0.158 |
| 33925.0 | 0.161 |
| 33926.0 | 0.166 |
| 33927.0 | 0.159 |
| 33928.0 | 0.141 |
| 33931.0 | 0.143 |
| 33932.0 | 0.148 |
| 33933.0 | 0.149 |
| 33934.0 | 0.15 |
| 33935.0 | 0.165 |
| 33938.0 | 0.168 |
| 33939.0 | 0.166 |
| 33940.0 | 0.159 |
| 33941.0 | 0.159 |
| 33942.0 | 0.157 |
| 33945.0 | 0.166 |
| 33946.0 | 0.153 |
| 33947.0 | 0.156 |
| 33948.0 | 0.142 |
| 33949.0 | 0.136 |
| 33952.0 | 0.132 |
| 33953.0 | 0.133 |
| 33954.0 | 0.119 |
| 33955.0 | 0.134 |
| 33956.0 | 0.151 |
| 33959.0 | 0.171 |
| 33960.0 | 0.185 |
| 33961.0 | 0.187 |
| 33962.0 | 0.196 |
| 33963.0 | 0.196 |
| 33966.0 | 0.187 |
| 33967.0 | 0.209 |
| 33968.0 | 0.2 |
| 33969.0 | 0.198 |
| 33970.0 | 0.198 |
| 33973.0 | 0.192 |
| 33974.0 | 0.207 |
| 33975.0 | 0.207 |
| 33976.0 | 0.199 |
| 33977.0 | 0.19 |
| 33980.0 | 0.172 |
| 33981.0 | 0.176 |
| 33982.0 | 0.174 |
| 33983.0 | 0.184 |
| 33984.0 | 0.202 |
| 33987.0 | 0.217 |
| 33988.0 | 0.217 |
| 33989.0 | 0.216 |
| 33990.0 | 0.219 |
| 33991.0 | 0.223 |
| 33994.0 | 0.2 |
| 33995.0 | 0.214 |
| 33996.0 | 0.203 |
| 33997.0 | 0.206 |
| 33998.0 | 0.212 |
| 34001.0 | 0.223 |
| 34002.0 | 0.227 |
| 34003.0 | 0.252 |
| 34004.0 | 0.261 |
| 34005.0 | 0.284 |
| 34008.0 | 0.291 |
| 34009.0 | 0.28 |
| 34010.0 | 0.282 |
| 34011.0 | 0.29 |
| 34012.0 | 0.287 |
| 34015.0 | 0.296 |
| 34016.0 | 0.286 |
| 34017.0 | 0.284 |
| 34018.0 | 0.301 |
| 34019.0 | 0.304 |
| 34022.0 | 0.313 |
| 34023.0 | 0.303 |
| 34024.0 | 0.3 |
| 34025.0 | 0.305 |
| 34026.0 | 0.325 |
| 34029.0 | 0.34 |
| 34030.0 | 0.34 |
| 34031.0 | 0.341 |
| 34032.0 | 0.337 |
| 34033.0 | 0.342 |
| 34036.0 | 0.347 |
| 34037.0 | 0.351 |
| 34038.0 | 0.349 |
| 34039.0 | 0.35 |
| 34040.0 | 0.335 |
| 34043.0 | 0.339 |
| 34044.0 | 0.334 |
| 34045.0 | 0.328 |
| 34046.0 | 0.331 |
| 34047.0 | 0.333 |
| 34050.0 | 0.312 |
| 34051.0 | 0.313 |
| 34052.0 | 0.314 |
| 34053.0 | 0.324 |
| 34054.0 | 0.328 |
| 34057.0 | 0.335 |
| 34058.0 | 0.339 |
| 34059.0 | 0.341 |
| 34060.0 | 0.327 |
| 34061.0 | 0.318 |
| 34064.0 | 0.313 |
| 34065.0 | 0.322 |
| 34066.0 | 0.319 |
| 34067.0 | 0.327 |
| 34068.0 | 0.323 |
| 34071.0 | 0.322 |
| 34072.0 | 0.339 |
| 34073.0 | 0.338 |
| 34074.0 | 0.334 |
| 34075.0 | 0.338 |
| 34078.0 | 0.342 |
| 34079.0 | 0.335 |
| 34080.0 | 0.323 |
| 34081.0 | 0.328 |
| 34082.0 | 0.319 |
| 34085.0 | 0.316 |
| 34086.0 | 0.316 |
| 34087.0 | 0.315 |
| 34088.0 | 0.301 |
| 34089.0 | 0.307 |
| 34092.0 | 0.311 |
| 34093.0 | 0.31 |
| 34094.0 | 0.308 |
| 34095.0 | 0.306 |
| 34096.0 | 0.292 |
| 34099.0 | 0.292 |
| 34100.0 | 0.293 |
| 34101.0 | 0.298 |
| 34102.0 | 0.317 |
| 34103.0 | 0.306 |
| 34106.0 | 0.297 |
| 34107.0 | 0.299 |
| 34108.0 | 0.297 |
| 34109.0 | 0.294 |
| 34110.0 | 0.292 |
| 34113.0 | 0.298 |
| 34114.0 | 0.308 |
| 34115.0 | 0.306 |
| 34116.0 | 0.312 |
| 34117.0 | 0.306 |
| 34120.0 | 0.306 |
| 34121.0 | 0.298 |
| 34122.0 | 0.302 |
| 34123.0 | 0.302 |
| 34124.0 | 0.3 |
| 34127.0 | 0.307 |
| 34128.0 | 0.312 |
| 34129.0 | 0.327 |
| 34130.0 | 0.328 |
| 34131.0 | 0.335 |
| 34134.0 | 0.338 |
| 34135.0 | 0.328 |
| 34136.0 | 0.336 |
| 34137.0 | 0.333 |
| 34138.0 | 0.341 |
| 34141.0 | 0.345 |
| 34142.0 | 0.361 |
| 34143.0 | 0.361 |
| 34144.0 | 0.357 |
| 34145.0 | 0.357 |
| 34148.0 | 0.367 |
| 34149.0 | 0.36 |
| 34150.0 | 0.362 |
| 34151.0 | 0.361 |
| 34152.0 | 0.349 |
| 34155.0 | 0.346 |
| 34156.0 | 0.349 |
| 34157.0 | 0.358 |
| 34158.0 | 0.391 |
| 34159.0 | 0.398 |
| 34162.0 | 0.402 |
| 34163.0 | 0.398 |
| 34164.0 | 0.398 |
| 34165.0 | 0.404 |
| 34166.0 | 0.402 |
| 34169.0 | 0.408 |
| 34170.0 | 0.405 |
| 34171.0 | 0.391 |
| 34172.0 | 0.398 |
| 34173.0 | 0.407 |
| 34176.0 | 0.417 |
| 34177.0 | 0.416 |
| 34178.0 | 0.416 |
| 34179.0 | 0.431 |
| 34180.0 | 0.457 |
| 34183.0 | 0.468 |
| 34184.0 | 0.463 |
| 34185.0 | 0.466 |
| 34186.0 | 0.464 |
| 34187.0 | 0.469 |
| 34190.0 | 0.484 |
| 34191.0 | 0.477 |
| 34192.0 | 0.496 |
| 34193.0 | 0.492 |
| 34194.0 | 0.495 |
| 34197.0 | 0.499 |
| 34198.0 | 0.502 |
| 34199.0 | 0.522 |
| 34200.0 | 0.528 |
| 34201.0 | 0.515 |
| 34204.0 | 0.507 |
| 34205.0 | 0.512 |
| 34206.0 | 0.535 |
| 34207.0 | 0.532 |
| 34208.0 | 0.538 |
| 34211.0 | 0.549 |
| 34212.0 | 0.553 |
| 34213.0 | 0.538 |
| 34214.0 | 0.538 |
| 34215.0 | 0.538 |
| 34218.0 | 0.526 |
| 34219.0 | 0.515 |
| 34220.0 | 0.505 |
| 34221.0 | 0.503 |
| 34222.0 | 0.498 |
| 34225.0 | 0.496 |
| 34226.0 | 0.504 |
| 34227.0 | 0.486 |
| 34228.0 | 0.48 |
| 34229.0 | 0.492 |
| 34232.0 | 0.506 |
| 34233.0 | 0.502 |
| 34234.0 | 0.491 |
| 34235.0 | 0.493 |
| 34236.0 | 0.488 |
| 34239.0 | 0.509 |
| 34240.0 | 0.511 |
| 34241.0 | 0.507 |
| 34242.0 | 0.513 |
| 34243.0 | 0.515 |
| 34246.0 | 0.522 |
| 34247.0 | 0.545 |
| 34248.0 | 0.554 |
| 34249.0 | 0.553 |
| 34250.0 | 0.569 |
| 34253.0 | 0.551 |
| 34254.0 | 0.547 |
| 34255.0 | 0.545 |
| 34256.0 | 0.544 |
| 34257.0 | 0.558 |
| 34260.0 | 0.573 |
| 34261.0 | 0.568 |
| 34262.0 | 0.575 |
| 34263.0 | 0.585 |
| 34264.0 | 0.602 |
| 34267.0 | 0.604 |
| 34268.0 | 0.596 |
| 34269.0 | 0.583 |
| 34270.0 | 0.588 |
| 34271.0 | 0.594 |
| 34274.0 | 0.595 |
| 34275.0 | 0.602 |
| 34276.0 | 0.6 |
| 34277.0 | 0.587 |
| 34278.0 | 0.555 |
| 34281.0 | 0.554 |
| 34282.0 | 0.562 |
| 34283.0 | 0.552 |
| 34284.0 | 0.55 |
| 34285.0 | 0.547 |
| 34288.0 | 0.562 |
| 34289.0 | 0.562 |
| 34290.0 | 0.569 |
| 34291.0 | 0.578 |
| 34292.0 | 0.574 |
| 34295.0 | 0.541 |
| 34296.0 | 0.534 |
| 34297.0 | 0.535 |
| 34298.0 | 0.551 |
| 34299.0 | 0.556 |
| 34302.0 | 0.554 |
| 34303.0 | 0.558 |
| 34304.0 | 0.581 |
| 34305.0 | 0.59 |
| 34306.0 | 0.598 |
| 34309.0 | 0.604 |
| 34310.0 | 0.606 |
| 34311.0 | 0.621 |
| 34312.0 | 0.631 |
| 34313.0 | 0.621 |
| 34316.0 | 0.624 |
| 34317.0 | 0.606 |
| 34318.0 | 0.599 |
| 34319.0 | 0.61 |
| 34320.0 | 0.621 |
| 34323.0 | 0.635 |
| 34324.0 | 0.639 |
| 34325.0 | 0.647 |
| 34326.0 | 0.658 |
| 34327.0 | 0.658 |
| 34330.0 | 0.67 |
| 34331.0 | 0.662 |
| 34332.0 | 0.657 |
| 34333.0 | 0.668 |
| 34334.0 | 0.67 |
| 34337.0 | 0.678 |
| 34338.0 | 0.673 |
| 34339.0 | 0.662 |
| 34340.0 | 0.666 |
| 34341.0 | 0.67 |
| 34344.0 | 0.675 |
| 34345.0 | 0.677 |
| 34346.0 | 0.657 |
| 34347.0 | 0.638 |
| 34348.0 | 0.642 |
| 34351.0 | 0.64 |
| 34352.0 | 0.645 |
| 34353.0 | 0.658 |
| 34354.0 | 0.65 |
| 34355.0 | 0.639 |
| 34358.0 | 0.646 |
| 34359.0 | 0.655 |
| 34360.0 | 0.658 |
| 34361.0 | 0.659 |
| 34362.0 | 0.673 |
| 34365.0 | 0.694 |
| 34366.0 | 0.69 |
| 34367.0 | 0.696 |
| 34368.0 | 0.684 |
| 34369.0 | 0.682 |
| 34372.0 | 0.652 |
| 34373.0 | 0.671 |
| 34374.0 | 0.666 |
| 34375.0 | 0.67 |
| 34376.0 | 0.659 |
| 34379.0 | 0.655 |
| 34380.0 | 0.659 |
| 34381.0 | 0.665 |
| 34382.0 | 0.67 |
| 34383.0 | 0.669 |
| 34386.0 | 0.649 |
| 34387.0 | 0.643 |
| 34388.0 | 0.656 |
| 34389.0 | 0.626 |
| 34390.0 | 0.617 |
| 34393.0 | 0.632 |
| 34394.0 | 0.609 |
| 34395.0 | 0.581 |
| 34396.0 | 0.594 |
| 34397.0 | 0.607 |
| 34400.0 | 0.632 |
| 34401.0 | 0.635 |
| 34402.0 | 0.623 |
| 34403.0 | 0.63 |
| 34404.0 | 0.615 |
| 34407.0 | 0.639 |
| 34408.0 | 0.655 |
| 34409.0 | 0.651 |
| 34410.0 | 0.654 |
| 34411.0 | 0.641 |
| 34414.0 | 0.628 |
| 34415.0 | 0.626 |
| 34416.0 | 0.633 |
| 34417.0 | 0.619 |
| 34418.0 | 0.604 |
| 34421.0 | 0.621 |
| 34422.0 | 0.618 |
| 34423.0 | 0.603 |
| 34424.0 | 0.6 |
| 34425.0 | 0.603 |
| 34428.0 | 0.599 |
| 34429.0 | 0.609 |
| 34430.0 | 0.63 |
| 34431.0 | 0.636 |
| 34432.0 | 0.644 |
| 34435.0 | 0.662 |
| 34436.0 | 0.666 |
| 34437.0 | 0.662 |
| 34438.0 | 0.654 |
| 34439.0 | 0.661 |
| 34442.0 | 0.658 |
| 34443.0 | 0.636 |
| 34444.0 | 0.633 |
| 34445.0 | 0.629 |
| 34446.0 | 0.652 |
| 34449.0 | 0.645 |
| 34450.0 | 0.664 |
| 34451.0 | 0.673 |
| 34452.0 | 0.669 |
| 34453.0 | 0.664 |
| 34456.0 | 0.669 |
| 34457.0 | 0.665 |
| 34458.0 | 0.651 |
| 34459.0 | 0.651 |
| 34460.0 | 0.662 |
| 34463.0 | 0.65 |
| 34464.0 | 0.666 |
| 34465.0 | 0.668 |
| 34466.0 | 0.67 |
| 34467.0 | 0.674 |
| 34470.0 | 0.674 |
| 34471.0 | 0.677 |
| 34472.0 | 0.678 |
| 34473.0 | 0.671 |
| 34474.0 | 0.662 |
| 34477.0 | 0.658 |
| 34478.0 | 0.637 |
| 34479.0 | 0.617 |
| 34480.0 | 0.607 |
| 34481.0 | 0.6 |
| 34484.0 | 0.598 |
| 34485.0 | 0.593 |
| 34486.0 | 0.582 |
| 34487.0 | 0.589 |
| 34488.0 | 0.599 |
| 34491.0 | 0.608 |
| 34492.0 | 0.599 |
| 34493.0 | 0.605 |
| 34494.0 | 0.597 |
| 34495.0 | 0.603 |
| 34498.0 | 0.581 |
| 34499.0 | 0.572 |
| 34500.0 | 0.567 |
| 34501.0 | 0.552 |
| 34502.0 | 0.546 |
| 34505.0 | 0.505 |
| 34506.0 | 0.498 |
| 34507.0 | 0.514 |
| 34508.0 | 0.537 |
| 34509.0 | 0.519 |
| 34512.0 | 0.505 |
| 34513.0 | 0.517 |
| 34514.0 | 0.529 |
| 34515.0 | 0.512 |
| 34516.0 | 0.514 |
| 34519.0 | 0.517 |
| 34520.0 | 0.514 |
| 34521.0 | 0.515 |
| 34522.0 | 0.52 |
| 34523.0 | 0.527 |
| 34526.0 | 0.537 |
| 34527.0 | 0.526 |
| 34528.0 | 0.541 |
| 34529.0 | 0.545 |
| 34530.0 | 0.559 |
| 34533.0 | 0.571 |
| 34534.0 | 0.588 |
| 34535.0 | 0.587 |
| 34536.0 | 0.588 |
| 34537.0 | 0.602 |
| 34540.0 | 0.601 |
| 34541.0 | 0.606 |
| 34542.0 | 0.594 |
| 34543.0 | 0.592 |
| 34544.0 | 0.609 |
| 34547.0 | 0.616 |
| 34548.0 | 0.634 |
| 34549.0 | 0.638 |
| 34550.0 | 0.633 |
| 34551.0 | 0.634 |
| 34554.0 | 0.633 |
| 34555.0 | 0.617 |
| 34556.0 | 0.608 |
| 34557.0 | 0.605 |
| 34558.0 | 0.584 |
| 34561.0 | 0.587 |
| 34562.0 | 0.589 |
| 34563.0 | 0.597 |
| 34564.0 | 0.586 |
| 34565.0 | 0.586 |
| 34568.0 | 0.575 |
| 34569.0 | 0.58 |
| 34570.0 | 0.59 |
| 34571.0 | 0.604 |
| 34572.0 | 0.619 |
| 34575.0 | 0.633 |
| 34576.0 | 0.631 |
| 34577.0 | 0.633 |
| 34578.0 | 0.62 |
| 34579.0 | 0.619 |
| 34582.0 | 0.603 |
| 34583.0 | 0.589 |
| 34584.0 | 0.594 |
| 34585.0 | 0.602 |
| 34586.0 | 0.597 |
| 34589.0 | 0.586 |
| 34590.0 | 0.585 |
| 34591.0 | 0.577 |
| 34592.0 | 0.585 |
| 34593.0 | 0.575 |
| 34596.0 | 0.565 |
| 34597.0 | 0.553 |
| 34598.0 | 0.551 |
| 34599.0 | 0.545 |
| 34600.0 | 0.559 |
| 34603.0 | 0.55 |
| 34604.0 | 0.549 |
| 34605.0 | 0.561 |
| 34606.0 | 0.543 |
| 34607.0 | 0.532 |
| 34610.0 | 0.52 |
| 34611.0 | 0.52 |
| 34612.0 | 0.494 |
| 34613.0 | 0.495 |
| 34614.0 | 0.494 |
| 34617.0 | 0.525 |
| 34618.0 | 0.547 |
| 34619.0 | 0.551 |
| 34620.0 | 0.566 |
| 34621.0 | 0.567 |
| 34624.0 | 0.558 |
| 34625.0 | 0.548 |
| 34626.0 | 0.535 |
| 34627.0 | 0.538 |
| 34628.0 | 0.517 |
| 34631.0 | 0.519 |
| 34632.0 | 0.502 |
| 34633.0 | 0.513 |
| 34634.0 | 0.518 |
| 34635.0 | 0.543 |
| 34638.0 | 0.56 |
| 34639.0 | 0.553 |
| 34640.0 | 0.535 |
| 34641.0 | 0.546 |
| 34642.0 | 0.552 |
| 34645.0 | 0.536 |
| 34646.0 | 0.543 |
| 34647.0 | 0.564 |
| 34648.0 | 0.56 |
| 34649.0 | 0.558 |
| 34652.0 | 0.562 |
| 34653.0 | 0.578 |
| 34654.0 | 0.571 |
| 34655.0 | 0.563 |
| 34656.0 | 0.56 |
| 34659.0 | 0.564 |
| 34660.0 | 0.545 |
| 34661.0 | 0.524 |
| 34662.0 | 0.543 |
| 34663.0 | 0.545 |
| 34666.0 | 0.55 |
| 34667.0 | 0.544 |
| 34668.0 | 0.555 |
| 34669.0 | 0.553 |
| 34670.0 | 0.557 |
| 34673.0 | 0.567 |
| 34674.0 | 0.554 |
| 34675.0 | 0.554 |
| 34676.0 | 0.548 |
| 34677.0 | 0.535 |
| 34680.0 | 0.525 |
| 34681.0 | 0.522 |
| 34682.0 | 0.529 |
| 34683.0 | 0.536 |
| 34684.0 | 0.543 |
| 34687.0 | 0.545 |
| 34688.0 | 0.546 |
| 34689.0 | 0.557 |
| 34690.0 | 0.563 |
| 34691.0 | 0.564 |
| 34694.0 | 0.567 |
| 34695.0 | 0.571 |
| 34696.0 | 0.575 |
| 34697.0 | 0.543 |
| 34698.0 | 0.552 |
| 34701.0 | 0.547 |
| 34702.0 | 0.548 |
| 34703.0 | 0.55 |
| 34704.0 | 0.539 |
| 34705.0 | 0.54 |
| 34708.0 | 0.534 |
| 34709.0 | 0.531 |
| 34710.0 | 0.528 |
| 34711.0 | 0.53 |
| 34712.0 | 0.533 |
| 34715.0 | 0.554 |
| 34716.0 | 0.549 |
| 34717.0 | 0.547 |
| 34718.0 | 0.55 |
| 34719.0 | 0.536 |
| 34722.0 | 0.517 |
| 34723.0 | 0.52 |
| 34724.0 | 0.524 |
| 34725.0 | 0.535 |
| 34726.0 | 0.536 |
| 34729.0 | 0.537 |
| 34730.0 | 0.526 |
| 34731.0 | 0.545 |
| 34732.0 | 0.545 |
| 34733.0 | 0.557 |
| 34736.0 | 0.572 |
| 34737.0 | 0.571 |
| 34738.0 | 0.567 |
| 34739.0 | 0.577 |
| 34740.0 | 0.582 |
| 34743.0 | 0.574 |
| 34744.0 | 0.578 |
| 34745.0 | 0.58 |
| 34746.0 | 0.564 |
| 34747.0 | 0.562 |
| 34750.0 | 0.55 |
| 34751.0 | 0.55 |
| 34752.0 | 0.545 |
| 34753.0 | 0.558 |
| 34754.0 | 0.553 |
| 34757.0 | 0.544 |
| 34758.0 | 0.543 |
| 34759.0 | 0.554 |
| 34760.0 | 0.553 |
| 34761.0 | 0.547 |
| 34764.0 | 0.534 |
| 34765.0 | 0.525 |
| 34766.0 | 0.509 |
| 34767.0 | 0.501 |
| 34768.0 | 0.509 |
| 34771.0 | 0.502 |
| 34772.0 | 0.516 |
| 34773.0 | 0.513 |
| 34774.0 | 0.517 |
| 34775.0 | 0.535 |
| 34778.0 | 0.534 |
| 34779.0 | 0.531 |
| 34780.0 | 0.533 |
| 34781.0 | 0.507 |
| 34782.0 | 0.512 |
| 34785.0 | 0.524 |
| 34786.0 | 0.513 |
| 34787.0 | 0.517 |
| 34788.0 | 0.537 |
| 34789.0 | 0.529 |
| 34792.0 | 0.527 |
| 34793.0 | 0.543 |
| 34794.0 | 0.546 |
| 34795.0 | 0.554 |
| 34796.0 | 0.549 |
| 34799.0 | 0.544 |
| 34800.0 | 0.547 |
| 34801.0 | 0.55 |
| 34802.0 | 0.551 |
| 34803.0 | 0.552 |
| 34806.0 | 0.554 |
| 34807.0 | 0.545 |
| 34808.0 | 0.545 |
| 34809.0 | 0.547 |
| 34810.0 | 0.566 |
| 34813.0 | 0.564 |
| 34814.0 | 0.577 |
| 34815.0 | 0.587 |
| 34816.0 | 0.586 |
| 34817.0 | 0.58 |
| 34820.0 | 0.587 |
| 34821.0 | 0.601 |
| 34822.0 | 0.608 |
| 34823.0 | 0.61 |
| 34824.0 | 0.605 |
| 34827.0 | 0.604 |
| 34828.0 | 0.618 |
| 34829.0 | 0.626 |
| 34830.0 | 0.631 |
| 34831.0 | 0.634 |
| 34834.0 | 0.626 |
| 34835.0 | 0.637 |
| 34836.0 | 0.631 |
| 34837.0 | 0.62 |
| 34838.0 | 0.603 |
| 34841.0 | 0.615 |
| 34842.0 | 0.612 |
| 34843.0 | 0.625 |
| 34844.0 | 0.622 |
| 34845.0 | 0.601 |
| 34848.0 | 0.594 |
| 34849.0 | 0.606 |
| 34850.0 | 0.613 |
| 34851.0 | 0.63 |
| 34852.0 | 0.631 |
| 34855.0 | 0.631 |
| 34856.0 | 0.631 |
| 34857.0 | 0.633 |
| 34858.0 | 0.627 |
| 34859.0 | 0.613 |
| 34862.0 | 0.611 |
| 34863.0 | 0.612 |
| 34864.0 | 0.608 |
| 34865.0 | 0.616 |
| 34866.0 | 0.608 |
| 34869.0 | 0.621 |
| 34870.0 | 0.618 |
| 34871.0 | 0.619 |
| 34872.0 | 0.631 |
| 34873.0 | 0.626 |
| 34876.0 | 0.627 |
| 34877.0 | 0.619 |
| 34878.0 | 0.605 |
| 34879.0 | 0.605 |
| 34880.0 | 0.597 |
| 34883.0 | 0.606 |
| 34884.0 | 0.617 |
| 34885.0 | 0.62 |
| 34886.0 | 0.618 |
| 34887.0 | 0.646 |
| 34890.0 | 0.659 |
| 34891.0 | 0.664 |
| 34892.0 | 0.67 |
| 34893.0 | 0.673 |
| 34894.0 | 0.664 |
| 34897.0 | 0.669 |
| 34898.0 | 0.666 |
| 34899.0 | 0.654 |
| 34900.0 | 0.649 |
| 34901.0 | 0.655 |
| 34904.0 | 0.669 |
| 34905.0 | 0.68 |
| 34906.0 | 0.684 |
| 34907.0 | 0.683 |
| 34908.0 | 0.677 |
| 34911.0 | 0.672 |
| 34912.0 | 0.672 |
| 34913.0 | 0.692 |
| 34914.0 | 0.684 |
| 34915.0 | 0.685 |
| 34918.0 | 0.688 |
| 34919.0 | 0.688 |
| 34920.0 | 0.682 |
| 34921.0 | 0.683 |
| 34922.0 | 0.685 |
| 34925.0 | 0.68 |
| 34926.0 | 0.685 |
| 34927.0 | 0.691 |
| 34928.0 | 0.689 |
| 34929.0 | 0.696 |
| 34932.0 | 0.703 |
| 34933.0 | 0.695 |
| 34934.0 | 0.694 |
| 34935.0 | 0.69 |
| 34936.0 | 0.686 |
| 34939.0 | 0.675 |
| 34940.0 | 0.672 |
| 34941.0 | 0.677 |
| 34942.0 | 0.67 |
| 34943.0 | 0.669 |
| 34946.0 | 0.68 |
| 34947.0 | 0.683 |
| 34948.0 | 0.687 |
| 34949.0 | 0.684 |
| 34950.0 | 0.686 |
| 34953.0 | 0.685 |
| 34954.0 | 0.69 |
| 34955.0 | 0.701 |
| 34956.0 | 0.704 |
| 34957.0 | 0.706 |
| 34960.0 | 0.696 |
| 34961.0 | 0.703 |
| 34962.0 | 0.702 |
| 34963.0 | 0.698 |
| 34964.0 | 0.664 |
| 34967.0 | 0.662 |
| 34968.0 | 0.674 |
| 34969.0 | 0.659 |
| 34970.0 | 0.644 |
| 34971.0 | 0.656 |
| 34974.0 | 0.659 |
| 34975.0 | 0.66 |
| 34976.0 | 0.664 |
| 34977.0 | 0.665 |
| 34978.0 | 0.654 |
| 34981.0 | 0.646 |
| 34982.0 | 0.632 |
| 34983.0 | 0.639 |
| 34984.0 | 0.645 |
| 34985.0 | 0.656 |
| 34988.0 | 0.65 |
| 34989.0 | 0.649 |
| 34990.0 | 0.649 |
| 34991.0 | 0.642 |
| 34992.0 | 0.631 |
| 34995.0 | 0.606 |
| 34996.0 | 0.612 |
| 34997.0 | 0.63 |
| 34998.0 | 0.622 |
| 34999.0 | 0.602 |
| 35002.0 | 0.627 |
| 35003.0 | 0.643 |
| 35004.0 | 0.643 |
| 35005.0 | 0.651 |
| 35006.0 | 0.657 |
| 35009.0 | 0.647 |
| 35010.0 | 0.653 |
| 35011.0 | 0.652 |
| 35012.0 | 0.661 |
| 35013.0 | 0.654 |
| 35016.0 | 0.653 |
| 35017.0 | 0.658 |
| 35018.0 | 0.663 |
| 35019.0 | 0.676 |
| 35020.0 | 0.678 |
| 35023.0 | 0.686 |
| 35024.0 | 0.68 |
| 35025.0 | 0.681 |
| 35026.0 | 0.678 |
| 35027.0 | 0.685 |
| 35030.0 | 0.696 |
| 35031.0 | 0.692 |
| 35032.0 | 0.696 |
| 35033.0 | 0.692 |
| 35034.0 | 0.698 |
| 35037.0 | 0.687 |
| 35038.0 | 0.698 |
| 35039.0 | 0.704 |
| 35040.0 | 0.704 |
| 35041.0 | 0.711 |
| 35044.0 | 0.718 |
| 35045.0 | 0.73 |
| 35046.0 | 0.724 |
| 35047.0 | 0.738 |
| 35048.0 | 0.727 |
| 35051.0 | 0.718 |
| 35052.0 | 0.706 |
| 35053.0 | 0.72 |
| 35054.0 | 0.726 |
| 35055.0 | 0.742 |
| 35058.0 | 0.744 |
| 35059.0 | 0.745 |
| 35060.0 | 0.743 |
| 35061.0 | 0.743 |
| 35062.0 | 0.742 |
| 35065.0 | 0.743 |
| 35066.0 | 0.761 |
| 35067.0 | 0.777 |
| 35068.0 | 0.769 |
| 35069.0 | 0.762 |
| 35072.0 | 0.761 |
| 35073.0 | 0.765 |
| 35074.0 | 0.758 |
| 35075.0 | 0.749 |
| 35076.0 | 0.769 |
| 35079.0 | 0.768 |
| 35080.0 | 0.782 |
| 35081.0 | 0.791 |
| 35082.0 | 0.795 |
| 35083.0 | 0.809 |
| 35086.0 | 0.807 |
| 35087.0 | 0.797 |
| 35088.0 | 0.816 |
| 35089.0 | 0.822 |
| 35090.0 | 0.829 |
| 35093.0 | 0.833 |
| 35094.0 | 0.832 |
| 35095.0 | 0.839 |
| 35096.0 | 0.837 |
| 35097.0 | 0.838 |
| 35100.0 | 0.82 |
| 35101.0 | 0.823 |
| 35102.0 | 0.824 |
| 35103.0 | 0.816 |
| 35104.0 | 0.814 |
| 35107.0 | 0.819 |
| 35108.0 | 0.828 |
| 35109.0 | 0.823 |
| 35110.0 | 0.818 |
| 35111.0 | 0.817 |
| 35114.0 | 0.804 |
| 35115.0 | 0.789 |
| 35116.0 | 0.796 |
| 35117.0 | 0.81 |
| 35118.0 | 0.824 |
| 35121.0 | 0.812 |
| 35122.0 | 0.809 |
| 35123.0 | 0.823 |
| 35124.0 | 0.825 |
| 35125.0 | 0.837 |
| 35128.0 | 0.833 |
| 35129.0 | 0.823 |
| 35130.0 | 0.822 |
| 35131.0 | 0.829 |
| 35132.0 | 0.816 |
| 35135.0 | 0.795 |
| 35136.0 | 0.798 |
| 35137.0 | 0.801 |
| 35138.0 | 0.807 |
| 35139.0 | 0.809 |
| 35142.0 | 0.819 |
| 35143.0 | 0.83 |
| 35144.0 | 0.829 |
| 35145.0 | 0.832 |
| 35146.0 | 0.832 |
| 35149.0 | 0.834 |
| 35150.0 | 0.831 |
| 35151.0 | 0.839 |
| 35152.0 | 0.833 |
| 35153.0 | 0.84 |
| 35156.0 | 0.846 |
| 35157.0 | 0.847 |
| 35158.0 | 0.849 |
| 35159.0 | 0.853 |
| 35160.0 | 0.852 |
| 35163.0 | 0.852 |
| 35164.0 | 0.854 |
| 35165.0 | 0.869 |
| 35166.0 | 0.859 |
| 35167.0 | 0.858 |
| 35170.0 | 0.871 |
| 35171.0 | 0.875 |
| 35172.0 | 0.864 |
| 35173.0 | 0.869 |
| 35174.0 | 0.874 |
| 35177.0 | 0.887 |
| 35178.0 | 0.886 |
| 35179.0 | 0.887 |
| 35180.0 | 0.891 |
| 35181.0 | 0.894 |
| 35184.0 | 0.89 |
| 35185.0 | 0.892 |
| 35186.0 | 0.895 |
| 35187.0 | 0.893 |
| 35188.0 | 0.876 |
| 35191.0 | 0.878 |
| 35192.0 | 0.878 |
| 35193.0 | 0.869 |
| 35194.0 | 0.875 |
| 35195.0 | 0.88 |
| 35198.0 | 0.882 |
| 35199.0 | 0.896 |
| 35200.0 | 0.906 |
| 35201.0 | 0.903 |
| 35202.0 | 0.898 |
| 35205.0 | 0.904 |
| 35206.0 | 0.909 |
| 35207.0 | 0.9 |
| 35208.0 | 0.902 |
| 35209.0 | 0.898 |
| 35212.0 | 0.9 |
| 35213.0 | 0.905 |
| 35214.0 | 0.898 |
| 35215.0 | 0.889 |
| 35216.0 | 0.894 |
| 35219.0 | 0.884 |
| 35220.0 | 0.887 |
| 35221.0 | 0.894 |
| 35222.0 | 0.894 |
| 35223.0 | 0.888 |
| 35226.0 | 0.896 |
| 35227.0 | 0.899 |
| 35228.0 | 0.904 |
| 35229.0 | 0.895 |
| 35230.0 | 0.887 |
| 35233.0 | 0.887 |
| 35234.0 | 0.893 |
| 35235.0 | 0.884 |
| 35236.0 | 0.875 |
| 35237.0 | 0.873 |
| 35240.0 | 0.881 |
| 35241.0 | 0.888 |
| 35242.0 | 0.888 |
| 35243.0 | 0.88 |
| 35244.0 | 0.887 |
| 35247.0 | 0.885 |
| 35248.0 | 0.884 |
| 35249.0 | 0.884 |
| 35250.0 | 0.89 |
| 35251.0 | 0.88 |
| 35254.0 | 0.868 |
| 35255.0 | 0.873 |
| 35256.0 | 0.868 |
| 35257.0 | 0.862 |
| 35258.0 | 0.85 |
| 35261.0 | 0.842 |
| 35262.0 | 0.809 |
| 35263.0 | 0.819 |
| 35264.0 | 0.828 |
| 35265.0 | 0.831 |
| 35268.0 | 0.809 |
| 35269.0 | 0.816 |
| 35270.0 | 0.795 |
| 35271.0 | 0.809 |
| 35272.0 | 0.803 |
| 35275.0 | 0.805 |
| 35276.0 | 0.806 |
| 35277.0 | 0.821 |
| 35278.0 | 0.83 |
| 35279.0 | 0.844 |
| 35282.0 | 0.847 |
| 35283.0 | 0.845 |
| 35284.0 | 0.848 |
| 35285.0 | 0.847 |
| 35286.0 | 0.84 |
| 35289.0 | 0.838 |
| 35290.0 | 0.842 |
| 35291.0 | 0.84 |
| 35292.0 | 0.843 |
| 35293.0 | 0.847 |
| 35296.0 | 0.853 |
| 35297.0 | 0.863 |
| 35298.0 | 0.852 |
| 35299.0 | 0.862 |
| 35300.0 | 0.858 |
| 35303.0 | 0.852 |
| 35304.0 | 0.854 |
| 35305.0 | 0.853 |
| 35306.0 | 0.843 |
| 35307.0 | 0.83 |
| 35310.0 | 0.831 |
| 35311.0 | 0.824 |
| 35312.0 | 0.833 |
| 35313.0 | 0.834 |
| 35314.0 | 0.834 |
| 35317.0 | 0.85 |
| 35318.0 | 0.856 |
| 35319.0 | 0.853 |
| 35320.0 | 0.86 |
| 35321.0 | 0.878 |
| 35324.0 | 0.887 |
| 35325.0 | 0.882 |
| 35326.0 | 0.878 |
| 35327.0 | 0.88 |
| 35328.0 | 0.886 |
| 35331.0 | 0.878 |
| 35332.0 | 0.876 |
| 35333.0 | 0.892 |
| 35334.0 | 0.898 |
| 35335.0 | 0.907 |
| 35338.0 | 0.912 |
| 35339.0 | 0.911 |
| 35340.0 | 0.921 |
| 35341.0 | 0.924 |
| 35342.0 | 0.925 |
| 35345.0 | 0.926 |
| 35346.0 | 0.928 |
| 35347.0 | 0.925 |
| 35348.0 | 0.916 |
| 35349.0 | 0.917 |
| 35352.0 | 0.92 |
| 35353.0 | 0.936 |
| 35354.0 | 0.929 |
| 35355.0 | 0.932 |
| 35356.0 | 0.945 |
| 35359.0 | 0.945 |
| 35360.0 | 0.951 |
| 35361.0 | 0.937 |
| 35362.0 | 0.933 |
| 35363.0 | 0.933 |
| 35366.0 | 0.938 |
| 35367.0 | 0.92 |
| 35368.0 | 0.915 |
| 35369.0 | 0.917 |
| 35370.0 | 0.918 |
| 35373.0 | 0.914 |
| 35374.0 | 0.933 |
| 35375.0 | 0.948 |
| 35376.0 | 0.946 |
| 35377.0 | 0.952 |
| 35380.0 | 0.948 |
| 35381.0 | 0.958 |
| 35382.0 | 0.964 |
| 35383.0 | 0.97 |
| 35384.0 | 0.978 |
| 35387.0 | 0.973 |
| 35388.0 | 0.977 |
| 35389.0 | 0.977 |
| 35390.0 | 0.975 |
| 35391.0 | 0.985 |
| 35394.0 | 0.989 |
| 35395.0 | 0.998 |
| 35396.0 | 0.986 |
| 35397.0 | 0.999 |
| 35398.0 | 1.013 |
| 35401.0 | 1.019 |
| 35402.0 | 1.028 |
| 35403.0 | 1.017 |
| 35404.0 | 1.023 |
| 35405.0 | 0.983 |
| 35408.0 | 1.003 |
| 35409.0 | 1.007 |
| 35410.0 | 0.983 |
| 35411.0 | 0.986 |
| 35412.0 | 0.968 |
| 35415.0 | 0.992 |
| 35416.0 | 0.981 |
| 35417.0 | 0.995 |
| 35418.0 | 1.011 |
| 35419.0 | 1.026 |
| 35422.0 | 1.027 |
| 35423.0 | 1.027 |
| 35424.0 | 1.025 |
| 35425.0 | 1.03 |
| 35426.0 | 1.035 |
| 35429.0 | 1.045 |
| 35430.0 | 1.038 |
| 35431.0 | 1.041 |
| 35432.0 | 1.018 |
| 35433.0 | 1.035 |
| 35436.0 | 1.041 |
| 35437.0 | 1.042 |
| 35438.0 | 1.057 |
| 35439.0 | 1.062 |
| 35440.0 | 1.075 |
| 35443.0 | 1.094 |
| 35444.0 | 1.108 |
| 35445.0 | 1.11 |
| 35446.0 | 1.121 |
| 35447.0 | 1.127 |
| 35450.0 | 1.131 |
| 35451.0 | 1.122 |
| 35452.0 | 1.144 |
| 35453.0 | 1.151 |
| 35454.0 | 1.134 |
| 35457.0 | 1.133 |
| 35458.0 | 1.139 |
| 35459.0 | 1.128 |
| 35460.0 | 1.142 |
| 35461.0 | 1.155 |
| 35464.0 | 1.154 |
| 35465.0 | 1.155 |
| 35466.0 | 1.176 |
| 35467.0 | 1.178 |
| 35468.0 | 1.191 |
| 35471.0 | 1.197 |
| 35472.0 | 1.192 |
| 35473.0 | 1.201 |
| 35474.0 | 1.213 |
| 35475.0 | 1.219 |
| 35478.0 | 1.223 |
| 35479.0 | 1.226 |
| 35480.0 | 1.22 |
| 35481.0 | 1.211 |
| 35482.0 | 1.201 |
| 35485.0 | 1.2 |
| 35486.0 | 1.219 |
| 35487.0 | 1.213 |
| 35488.0 | 1.221 |
| 35489.0 | 1.205 |
| 35492.0 | 1.208 |
| 35493.0 | 1.229 |
| 35494.0 | 1.237 |
| 35495.0 | 1.255 |
| 35496.0 | 1.25 |
| 35499.0 | 1.263 |
| 35500.0 | 1.268 |
| 35501.0 | 1.25 |
| 35502.0 | 1.244 |
| 35503.0 | 1.248 |
| 35506.0 | 1.238 |
| 35507.0 | 1.218 |
| 35508.0 | 1.221 |
| 35509.0 | 1.199 |
| 35510.0 | 1.215 |
| 35513.0 | 1.208 |
| 35514.0 | 1.227 |
| 35515.0 | 1.244 |
| 35516.0 | 1.249 |
| 35517.0 | 1.25 |
| 35520.0 | 1.246 |
| 35521.0 | 1.196 |
| 35522.0 | 1.191 |
| 35523.0 | 1.17 |
| 35524.0 | 1.173 |
| 35527.0 | 1.202 |
| 35528.0 | 1.206 |
| 35529.0 | 1.222 |
| 35530.0 | 1.215 |
| 35531.0 | 1.208 |
| 35534.0 | 1.193 |
| 35535.0 | 1.222 |
| 35536.0 | 1.227 |
| 35537.0 | 1.235 |
| 35538.0 | 1.224 |
| 35541.0 | 1.227 |
| 35542.0 | 1.227 |
| 35543.0 | 1.245 |
| 35544.0 | 1.245 |
| 35545.0 | 1.237 |
| 35548.0 | 1.229 |
| 35549.0 | 1.25 |
| 35550.0 | 1.265 |
| 35551.0 | 1.272 |
| 35552.0 | 1.272 |
| 35555.0 | 1.291 |
| 35556.0 | 1.297 |
| 35557.0 | 1.292 |
| 35558.0 | 1.293 |
| 35559.0 | 1.301 |
| 35562.0 | 1.317 |
| 35563.0 | 1.322 |
| 35564.0 | 1.33 |
| 35565.0 | 1.327 |
| 35566.0 | 1.332 |
| 35569.0 | 1.331 |
| 35570.0 | 1.307 |
| 35571.0 | 1.341 |
| 35572.0 | 1.332 |
| 35573.0 | 1.337 |
| 35576.0 | 1.34 |
| 35577.0 | 1.345 |
| 35578.0 | 1.328 |
| 35579.0 | 1.325 |
| 35580.0 | 1.302 |
| 35583.0 | 1.321 |
| 35584.0 | 1.329 |
| 35585.0 | 1.337 |
| 35586.0 | 1.345 |
| 35587.0 | 1.359 |
| 35590.0 | 1.361 |
| 35591.0 | 1.355 |
| 35592.0 | 1.363 |
| 35593.0 | 1.381 |
| 35594.0 | 1.395 |
| 35597.0 | 1.398 |
| 35598.0 | 1.387 |
| 35599.0 | 1.389 |
| 35600.0 | 1.396 |
| 35601.0 | 1.405 |
| 35604.0 | 1.405 |
| 35605.0 | 1.407 |
| 35606.0 | 1.429 |
| 35607.0 | 1.437 |
| 35608.0 | 1.433 |
| 35611.0 | 1.413 |
| 35612.0 | 1.441 |
| 35613.0 | 1.445 |
| 35614.0 | 1.468 |
| 35615.0 | 1.478 |
| 35618.0 | 1.491 |
| 35619.0 | 1.484 |
| 35620.0 | 1.498 |
| 35621.0 | 1.48 |
| 35622.0 | 1.497 |
| 35625.0 | 1.503 |
| 35626.0 | 1.499 |
| 35627.0 | 1.528 |
| 35628.0 | 1.53 |
| 35629.0 | 1.506 |
| 35632.0 | 1.482 |
| 35633.0 | 1.517 |
| 35634.0 | 1.554 |
| 35635.0 | 1.54 |
| 35636.0 | 1.551 |
| 35639.0 | 1.562 |
| 35640.0 | 1.55 |
| 35641.0 | 1.57 |
| 35642.0 | 1.57 |
| 35643.0 | 1.56 |
| 35646.0 | 1.537 |
| 35647.0 | 1.539 |
| 35648.0 | 1.566 |
| 35649.0 | 1.584 |
| 35650.0 | 1.559 |
| 35653.0 | 1.543 |
| 35654.0 | 1.554 |
| 35655.0 | 1.517 |
| 35656.0 | 1.506 |
| 35657.0 | 1.475 |
| 35660.0 | 1.477 |
| 35661.0 | 1.501 |
| 35662.0 | 1.523 |
| 35663.0 | 1.519 |
| 35664.0 | 1.482 |
| 35667.0 | 1.48 |
| 35668.0 | 1.453 |
| 35669.0 | 1.453 |
| 35670.0 | 1.437 |
| 35671.0 | 1.418 |
| 35674.0 | 1.438 |
| 35675.0 | 1.481 |
| 35676.0 | 1.494 |
| 35677.0 | 1.485 |
| 35678.0 | 1.492 |
| 35681.0 | 1.489 |
| 35682.0 | 1.48 |
| 35683.0 | 1.46 |
| 35684.0 | 1.434 |
| 35685.0 | 1.419 |
| 35688.0 | 1.432 |
| 35689.0 | 1.457 |
| 35690.0 | 1.473 |
| 35691.0 | 1.477 |
| 35692.0 | 1.479 |
| 35695.0 | 1.506 |
| 35696.0 | 1.499 |
| 35697.0 | 1.508 |
| 35698.0 | 1.505 |
| 35699.0 | 1.504 |
| 35702.0 | 1.502 |
| 35703.0 | 1.519 |
| 35704.0 | 1.534 |
| 35705.0 | 1.535 |
| 35706.0 | 1.552 |
| 35709.0 | 1.549 |
| 35710.0 | 1.545 |
| 35711.0 | 1.543 |
| 35712.0 | 1.501 |
| 35713.0 | 1.492 |
| 35716.0 | 1.519 |
| 35717.0 | 1.52 |
| 35718.0 | 1.511 |
| 35719.0 | 1.498 |
| 35720.0 | 1.477 |
| 35723.0 | 1.474 |
| 35724.0 | 1.499 |
| 35725.0 | 1.494 |
| 35726.0 | 1.44 |
| 35727.0 | 1.444 |
| 35730.0 | 1.396 |
| 35731.0 | 1.315 |
| 35732.0 | 1.396 |
| 35733.0 | 1.371 |
| 35734.0 | 1.372 |
| 35737.0 | 1.409 |
| 35738.0 | 1.394 |
| 35739.0 | 1.406 |
| 35740.0 | 1.391 |
| 35741.0 | 1.352 |
| 35744.0 | 1.365 |
| 35745.0 | 1.358 |
| 35746.0 | 1.34 |
| 35747.0 | 1.354 |
| 35748.0 | 1.361 |
| 35751.0 | 1.395 |
| 35752.0 | 1.403 |
| 35753.0 | 1.395 |
| 35754.0 | 1.425 |
| 35755.0 | 1.443 |
| 35758.0 | 1.405 |
| 35759.0 | 1.405 |
| 35760.0 | 1.421 |
| 35761.0 | 1.428 |
| 35762.0 | 1.428 |
| 35765.0 | 1.462 |
| 35766.0 | 1.467 |
| 35767.0 | 1.459 |
| 35768.0 | 1.472 |
| 35769.0 | 1.475 |
| 35772.0 | 1.487 |
| 35773.0 | 1.485 |
| 35774.0 | 1.462 |
| 35775.0 | 1.426 |
| 35776.0 | 1.433 |
| 35779.0 | 1.437 |
| 35780.0 | 1.466 |
| 35781.0 | 1.474 |
| 35782.0 | 1.464 |
| 35783.0 | 1.426 |
| 35786.0 | 1.431 |
| 35787.0 | 1.435 |
| 35788.0 | 1.438 |
| 35789.0 | 1.436 |
| 35790.0 | 1.437 |
| 35793.0 | 1.472 |
| 35794.0 | 1.489 |
| 35795.0 | 1.491 |
| 35796.0 | 1.491 |
| 35797.0 | 1.515 |
| 35800.0 | 1.538 |
| 35801.0 | 1.524 |
| 35802.0 | 1.523 |
| 35803.0 | 1.508 |
| 35804.0 | 1.488 |
| 35807.0 | 1.453 |
| 35808.0 | 1.477 |
| 35809.0 | 1.487 |
| 35810.0 | 1.487 |
| 35811.0 | 1.503 |
| 35814.0 | 1.516 |
| 35815.0 | 1.526 |
| 35816.0 | 1.521 |
| 35817.0 | 1.51 |
| 35818.0 | 1.498 |
| 35821.0 | 1.513 |
| 35822.0 | 1.531 |
| 35823.0 | 1.553 |
| 35824.0 | 1.565 |
| 35825.0 | 1.571 |
| 35828.0 | 1.581 |
| 35829.0 | 1.583 |
| 35830.0 | 1.574 |
| 35831.0 | 1.588 |
| 35832.0 | 1.594 |
| 35835.0 | 1.596 |
| 35836.0 | 1.595 |
| 35837.0 | 1.608 |
| 35838.0 | 1.591 |
| 35839.0 | 1.593 |
| 35842.0 | 1.607 |
| 35843.0 | 1.634 |
| 35844.0 | 1.634 |
| 35845.0 | 1.626 |
| 35846.0 | 1.628 |
| 35849.0 | 1.635 |
| 35850.0 | 1.637 |
| 35851.0 | 1.668 |
| 35852.0 | 1.675 |
| 35853.0 | 1.676 |
| 35856.0 | 1.701 |
| 35857.0 | 1.691 |
| 35858.0 | 1.676 |
| 35859.0 | 1.668 |
| 35860.0 | 1.702 |
| 35863.0 | 1.718 |
| 35864.0 | 1.716 |
| 35865.0 | 1.723 |
| 35866.0 | 1.72 |
| 35867.0 | 1.736 |
| 35870.0 | 1.75 |
| 35871.0 | 1.761 |
| 35872.0 | 1.753 |
| 35873.0 | 1.759 |
| 35874.0 | 1.776 |
| 35877.0 | 1.788 |
| 35878.0 | 1.803 |
| 35879.0 | 1.82 |
| 35880.0 | 1.799 |
| 35881.0 | 1.806 |
| 35884.0 | 1.8 |
| 35885.0 | 1.808 |
| 35886.0 | 1.827 |
| 35887.0 | 1.842 |
| 35888.0 | 1.859 |
| 35891.0 | 1.893 |
| 35892.0 | 1.867 |
| 35893.0 | 1.853 |
| 35894.0 | 1.857 |
| 35899.0 | 1.866 |
| 35900.0 | 1.869 |
| 35901.0 | 1.852 |
| 35902.0 | 1.859 |
| 35905.0 | 1.873 |
| 35906.0 | 1.871 |
| 35907.0 | 1.861 |
| 35908.0 | 1.84 |
| 35909.0 | 1.817 |
| 35912.0 | 1.765 |
| 35913.0 | 1.808 |
| 35914.0 | 1.791 |
| 35915.0 | 1.827 |
| 35919.0 | 1.878 |
| 35920.0 | 1.856 |
| 35921.0 | 1.857 |
| 35922.0 | 1.836 |
| 35923.0 | 1.854 |
| 35926.0 | 1.885 |
| 35927.0 | 1.869 |
| 35928.0 | 1.875 |
| 35929.0 | 1.876 |
| 35930.0 | 1.875 |
| 35933.0 | 1.853 |
| 35934.0 | 1.879 |
| 35935.0 | 1.896 |
| 35937.0 | 1.904 |
| 35940.0 | 1.926 |
| 35941.0 | 1.927 |
| 35942.0 | 1.891 |
| 35943.0 | 1.89 |
| 35944.0 | 1.898 |
| 35948.0 | 1.903 |
| 35949.0 | 1.916 |
| 35950.0 | 1.906 |
| 35951.0 | 1.925 |
| 35954.0 | 1.935 |
| 35955.0 | 1.923 |
| 35956.0 | 1.927 |
| 35957.0 | 1.914 |
| 35958.0 | 1.874 |
| 35961.0 | 1.853 |
| 35962.0 | 1.86 |
| 35963.0 | 1.886 |
| 35964.0 | 1.869 |
| 35965.0 | 1.855 |
| 35968.0 | 1.852 |
| 35969.0 | 1.877 |
| 35970.0 | 1.886 |
| 35971.0 | 1.913 |
| 35972.0 | 1.914 |
| 35975.0 | 1.929 |
| 35976.0 | 1.919 |
| 35977.0 | 1.944 |
| 35978.0 | 1.946 |
| 35979.0 | 1.961 |
| 35982.0 | 1.966 |
| 35983.0 | 1.971 |
| 35984.0 | 1.98 |
| 35985.0 | 1.975 |
| 35986.0 | 1.971 |
| 35989.0 | 1.979 |
| 35990.0 | 1.989 |
| 35991.0 | 2 |
| 35992.0 | 2.004 |
| 35993.0 | 2.022 |
| 35996.0 | 2.027 |
| 35997.0 | 2.019 |
| 35998.0 | 1.992 |
| 35999.0 | 1.992 |
| 36000.0 | 1.987 |
| 36003.0 | 1.963 |
| 36004.0 | 1.958 |
| 36005.0 | 1.956 |
| 36006.0 | 1.97 |
| 36007.0 | 1.95 |
| 36010.0 | 1.926 |
| 36011.0 | 1.922 |
| 36012.0 | 1.892 |
| 36013.0 | 1.869 |
| 36014.0 | 1.894 |
| 36017.0 | 1.866 |
| 36018.0 | 1.823 |
| 36019.0 | 1.85 |
| 36020.0 | 1.847 |
| 36021.0 | 1.866 |
| 36024.0 | 1.863 |
| 36025.0 | 1.912 |
| 36026.0 | 1.916 |
| 36027.0 | 1.895 |
| 36028.0 | 1.833 |
| 36031.0 | 1.83 |
| 36032.0 | 1.866 |
| 36033.0 | 1.823 |
| 36034.0 | 1.766 |
| 36035.0 | 1.74 |
| 36038.0 | 1.725 |
| 36039.0 | 1.711 |
| 36040.0 | 1.753 |
| 36041.0 | 1.722 |
| 36042.0 | 1.737 |
| 36045.0 | 1.754 |
| 36046.0 | 1.785 |
| 36047.0 | 1.76 |
| 36048.0 | 1.689 |
| 36049.0 | 1.682 |
| 36052.0 | 1.72 |
| 36053.0 | 1.71 |
| 36054.0 | 1.722 |
| 36055.0 | 1.65 |
| 36056.0 | 1.627 |
| 36059.0 | 1.561 |
| 36060.0 | 1.598 |
| 36061.0 | 1.647 |
| 36062.0 | 1.63 |
| 36063.0 | 1.606 |
| 36066.0 | 1.629 |
| 36067.0 | 1.615 |
| 36068.0 | 1.568 |
| 36069.0 | 1.492 |
| 36070.0 | 1.466 |
| 36073.0 | 1.441 |
| 36074.0 | 1.522 |
| 36075.0 | 1.496 |
| 36076.0 | 1.425 |
| 36077.0 | 1.455 |
| 36080.0 | 1.545 |
| 36081.0 | 1.57 |
| 36082.0 | 1.606 |
| 36083.0 | 1.606 |
| 36084.0 | 1.626 |
| 36087.0 | 1.626 |
| 36088.0 | 1.669 |
| 36089.0 | 1.645 |
| 36090.0 | 1.635 |
| 36091.0 | 1.639 |
| 36094.0 | 1.651 |
| 36095.0 | 1.692 |
| 36096.0 | 1.659 |
| 36097.0 | 1.653 |
| 36098.0 | 1.68 |
| 36101.0 | 1.712 |
| 36102.0 | 1.712 |
| 36103.0 | 1.75 |
| 36104.0 | 1.724 |
| 36105.0 | 1.722 |
| 36108.0 | 1.715 |
| 36109.0 | 1.696 |
| 36110.0 | 1.704 |
| 36111.0 | 1.701 |
| 36112.0 | 1.699 |
| 36115.0 | 1.736 |
| 36116.0 | 1.727 |
| 36117.0 | 1.724 |
| 36118.0 | 1.759 |
| 36119.0 | 1.798 |
| 36122.0 | 1.826 |
| 36123.0 | 1.812 |
| 36124.0 | 1.814 |
| 36125.0 | 1.842 |
| 36126.0 | 1.856 |
| 36129.0 | 1.819 |
| 36130.0 | 1.762 |
| 36131.0 | 1.744 |
| 36132.0 | 1.766 |
| 36133.0 | 1.773 |
| 36136.0 | 1.781 |
| 36137.0 | 1.784 |
| 36138.0 | 1.789 |
| 36139.0 | 1.786 |
| 36140.0 | 1.759 |
| 36143.0 | 1.757 |
| 36144.0 | 1.769 |
| 36145.0 | 1.79 |
| 36146.0 | 1.806 |
| 36147.0 | 1.794 |
| 36150.0 | 1.84 |
| 36151.0 | 1.85 |
| 36152.0 | 1.874 |
| 36157.0 | 1.887 |
| 36158.0 | 1.897 |
| 36159.0 | 1.892 |
| 36160.0 | 1.892 |
| 36164.0 | 1.976 |
| 36165.0 | 2.001 |
| 36166.0 | 2.032 |
| 36167.0 | 2.01 |
| 36168.0 | 2.005 |
| 36171.0 | 1.977 |
| 36172.0 | 1.959 |
| 36173.0 | 1.889 |
| 36174.0 | 1.901 |
| 36175.0 | 1.927 |
| 36178.0 | 1.964 |
| 36179.0 | 1.964 |
| 36180.0 | 1.999 |
| 36181.0 | 1.983 |
| 36182.0 | 1.927 |
| 36185.0 | 1.928 |
| 36186.0 | 1.931 |
| 36187.0 | 1.939 |
| 36188.0 | 1.963 |
| 36189.0 | 1.977 |
| 36192.0 | 1.997 |
| 36193.0 | 1.975 |
| 36194.0 | 1.953 |
| 36195.0 | 1.953 |
| 36196.0 | 1.954 |
| 36199.0 | 1.942 |
| 36200.0 | 1.892 |
| 36201.0 | 1.884 |
| 36202.0 | 1.906 |
| 36203.0 | 1.919 |
| 36206.0 | 1.923 |
| 36207.0 | 1.917 |
| 36208.0 | 1.892 |
| 36209.0 | 1.908 |
| 36210.0 | 1.923 |
| 36213.0 | 1.946 |
| 36214.0 | 1.974 |
| 36215.0 | 1.981 |
| 36216.0 | 1.957 |
| 36217.0 | 1.952 |
| 36220.0 | 1.934 |
| 36221.0 | 1.938 |
| 36222.0 | 1.914 |
| 36223.0 | 1.931 |
| 36224.0 | 1.973 |
| 36227.0 | 1.956 |
| 36228.0 | 1.955 |
| 36229.0 | 1.952 |
| 36230.0 | 1.967 |
| 36231.0 | 1.989 |
| 36234.0 | 1.992 |
| 36235.0 | 2.001 |
| 36236.0 | 1.994 |
| 36237.0 | 1.99 |
| 36238.0 | 2.012 |
| 36241.0 | 2.002 |
| 36242.0 | 1.967 |
| 36243.0 | 1.947 |
| 36244.0 | 1.97 |
| 36245.0 | 1.953 |
| 36248.0 | 1.973 |
| 36249.0 | 1.968 |
| 36250.0 | 1.983 |
| 36251.0 | 1.988 |
| 36252.0 | 1.988 |
| 36256.0 | 2.017 |
| 36257.0 | 2.022 |
| 36258.0 | 2.026 |
| 36259.0 | 2.034 |
| 36262.0 | 2.034 |
| 36263.0 | 2.048 |
| 36264.0 | 2.038 |
| 36265.0 | 2.019 |
| 36266.0 | 2.021 |
| 36269.0 | 2.04 |
| 36270.0 | 2.004 |
| 36271.0 | 2.016 |
| 36272.0 | 2.029 |
| 36273.0 | 2.023 |
| 36276.0 | 2.03 |
| 36277.0 | 2.06 |
| 36278.0 | 2.055 |
| 36279.0 | 2.052 |
| 36280.0 | 2.061 |
| 36283.0 | 2.068 |
| 36284.0 | 2.067 |
| 36285.0 | 2.044 |
| 36286.0 | 2.038 |
| 36287.0 | 2.032 |
| 36290.0 | 2.036 |
| 36291.0 | 2.039 |
| 36292.0 | 2.03 |
| 36293.0 | 2.036 |
| 36294.0 | 2.016 |
| 36297.0 | 1.988 |
| 36298.0 | 2.002 |
| 36299.0 | 2.02 |
| 36300.0 | 2.032 |
| 36301.0 | 2.035 |
| 36305.0 | 2.012 |
| 36306.0 | 2.016 |
| 36307.0 | 1.994 |
| 36308.0 | 2 |
| 36311.0 | 2.01 |
| 36312.0 | 2.003 |
| 36313.0 | 2.005 |
| 36314.0 | 2.019 |
| 36315.0 | 2.027 |
| 36318.0 | 2.045 |
| 36319.0 | 2.047 |
| 36320.0 | 2.053 |
| 36321.0 | 2.041 |
| 36322.0 | 2.057 |
| 36325.0 | 2.052 |
| 36326.0 | 2.055 |
| 36327.0 | 2.069 |
| 36328.0 | 2.079 |
| 36329.0 | 2.085 |
| 36332.0 | 2.102 |
| 36333.0 | 2.098 |
| 36334.0 | 2.088 |
| 36335.0 | 2.069 |
| 36336.0 | 2.054 |
| 36339.0 | 2.064 |
| 36340.0 | 2.072 |
| 36341.0 | 2.072 |
| 36342.0 | 2.101 |
| 36343.0 | 2.11 |
| 36346.0 | 2.14 |
| 36347.0 | 2.139 |
| 36348.0 | 2.133 |
| 36349.0 | 2.133 |
| 36350.0 | 2.137 |
| 36353.0 | 2.137 |
| 36354.0 | 2.116 |
| 36355.0 | 2.122 |
| 36356.0 | 2.136 |
| 36357.0 | 2.133 |
| 36360.0 | 2.131 |
| 36361.0 | 2.098 |
| 36362.0 | 2.076 |
| 36363.0 | 2.062 |
| 36364.0 | 2.047 |
| 36367.0 | 2.029 |
| 36368.0 | 2.033 |
| 36369.0 | 2.032 |
| 36370.0 | 1.991 |
| 36371.0 | 2.014 |
| 36374.0 | 2.012 |
| 36375.0 | 2.004 |
| 36376.0 | 1.995 |
| 36377.0 | 1.963 |
| 36378.0 | 1.969 |
| 36381.0 | 1.993 |
| 36382.0 | 1.972 |
| 36383.0 | 1.979 |
| 36384.0 | 2.015 |
| 36385.0 | 2.042 |
| 36388.0 | 2.048 |
| 36389.0 | 2.057 |
| 36390.0 | 2.053 |
| 36391.0 | 2.03 |
| 36392.0 | 2.044 |
| 36395.0 | 2.059 |
| 36396.0 | 2.07 |
| 36397.0 | 2.098 |
| 36398.0 | 2.096 |
| 36399.0 | 2.097 |
| 36402.0 | 2.091 |
| 36403.0 | 2.065 |
| 36404.0 | 2.075 |
| 36405.0 | 2.045 |
| 36406.0 | 2.08 |
| 36409.0 | 2.093 |
| 36410.0 | 2.09 |
| 36411.0 | 2.087 |
| 36412.0 | 2.099 |
| 36413.0 | 2.109 |
| 36416.0 | 2.099 |
| 36417.0 | 2.086 |
| 36418.0 | 2.083 |
| 36419.0 | 2.067 |
| 36420.0 | 2.057 |
| 36423.0 | 2.07 |
| 36424.0 | 2.051 |
| 36425.0 | 2.043 |
| 36426.0 | 2.058 |
| 36427.0 | 2.034 |
| 36430.0 | 2.049 |
| 36431.0 | 2.028 |
| 36432.0 | 2.025 |
| 36433.0 | 2.026 |
| 36434.0 | 2.016 |
| 36437.0 | 2.036 |
| 36438.0 | 2.05 |
| 36439.0 | 2.059 |
| 36440.0 | 2.071 |
| 36441.0 | 2.071 |
| 36444.0 | 2.073 |
| 36445.0 | 2.06 |
| 36446.0 | 2.048 |
| 36447.0 | 2.037 |
| 36448.0 | 2.014 |
| 36451.0 | 2.002 |
| 36452.0 | 2.035 |
| 36453.0 | 2.038 |
| 36454.0 | 2.035 |
| 36455.0 | 2.069 |
| 36458.0 | 2.061 |
| 36459.0 | 2.075 |
| 36460.0 | 2.071 |
| 36461.0 | 2.102 |
| 36462.0 | 2.123 |
| 36465.0 | 2.119 |
| 36466.0 | 2.123 |
| 36467.0 | 2.135 |
| 36468.0 | 2.149 |
| 36469.0 | 2.156 |
| 36472.0 | 2.16 |
| 36473.0 | 2.165 |
| 36474.0 | 2.178 |
| 36475.0 | 2.201 |
| 36476.0 | 2.198 |
| 36479.0 | 2.221 |
| 36480.0 | 2.228 |
| 36481.0 | 2.228 |
| 36482.0 | 2.251 |
| 36483.0 | 2.252 |
| 36486.0 | 2.225 |
| 36487.0 | 2.23 |
| 36488.0 | 2.234 |
| 36489.0 | 2.269 |
| 36490.0 | 2.282 |
| 36493.0 | 2.276 |
| 36494.0 | 2.26 |
| 36495.0 | 2.269 |
| 36496.0 | 2.267 |
| 36497.0 | 2.304 |
| 36500.0 | 2.307 |
| 36501.0 | 2.324 |
| 36502.0 | 2.318 |
| 36503.0 | 2.32 |
| 36504.0 | 2.307 |
| 36507.0 | 2.312 |
| 36508.0 | 2.324 |
| 36509.0 | 2.315 |
| 36510.0 | 2.326 |
| 36511.0 | 2.333 |
| 36514.0 | 2.347 |
| 36515.0 | 2.342 |
| 36516.0 | 2.362 |
| 36517.0 | 2.4 |
| 36518.0 | 2.408 |
| 36521.0 | 2.409 |
| 36522.0 | 2.41 |
| 36523.0 | 2.416 |
| 36524.0 | 2.445 |
| 36525.0 | 2.445 |
| 36528.0 | 2.428 |
| 36529.0 | 2.37 |
| 36530.0 | 2.334 |
| 36531.0 | 2.321 |
| 36532.0 | 2.367 |
| 36535.0 | 2.388 |
| 36536.0 | 2.375 |
| 36537.0 | 2.368 |
| 36538.0 | 2.38 |
| 36539.0 | 2.423 |
| 36542.0 | 2.439 |
| 36543.0 | 2.402 |
| 36544.0 | 2.404 |
| 36545.0 | 2.407 |
| 36546.0 | 2.389 |
| 36549.0 | 2.389 |
| 36550.0 | 2.369 |
| 36551.0 | 2.39 |
| 36552.0 | 2.41 |
| 36553.0 | 2.408 |
| 36556.0 | 2.379 |
| 36557.0 | 2.411 |
| 36558.0 | 2.444 |
| 36559.0 | 2.486 |
| 36560.0 | 2.507 |
| 36563.0 | 2.484 |
| 36564.0 | 2.523 |
| 36565.0 | 2.527 |
| 36566.0 | 2.522 |
| 36567.0 | 2.528 |
| 36570.0 | 2.52 |
| 36571.0 | 2.485 |
| 36572.0 | 2.491 |
| 36573.0 | 2.505 |
| 36574.0 | 2.495 |
| 36577.0 | 2.482 |
| 36578.0 | 2.48 |
| 36579.0 | 2.497 |
| 36580.0 | 2.506 |
| 36581.0 | 2.532 |
| 36584.0 | 2.509 |
| 36585.0 | 2.524 |
| 36586.0 | 2.539 |
| 36587.0 | 2.585 |
| 36588.0 | 2.597 |
| 36591.0 | 2.601 |
| 36592.0 | 2.591 |
| 36593.0 | 2.574 |
| 36594.0 | 2.571 |
| 36595.0 | 2.588 |
| 36598.0 | 2.544 |
| 36599.0 | 2.545 |
| 36600.0 | 2.496 |
| 36601.0 | 2.522 |
| 36602.0 | 2.538 |
| 36605.0 | 2.553 |
| 36606.0 | 2.547 |
| 36607.0 | 2.548 |
| 36608.0 | 2.546 |
| 36609.0 | 2.578 |
| 36612.0 | 2.575 |
| 36613.0 | 2.591 |
| 36614.0 | 2.588 |
| 36615.0 | 2.544 |
| 36616.0 | 2.543 |
| 36619.0 | 2.506 |
| 36620.0 | 2.523 |
| 36621.0 | 2.485 |
| 36622.0 | 2.524 |
| 36623.0 | 2.546 |
| 36626.0 | 2.552 |
| 36627.0 | 2.522 |
| 36628.0 | 2.523 |
| 36629.0 | 2.524 |
| 36630.0 | 2.482 |
| 36633.0 | 2.467 |
| 36634.0 | 2.49 |
| 36635.0 | 2.495 |
| 36636.0 | 2.506 |
| 36641.0 | 2.518 |
| 36642.0 | 2.542 |
| 36643.0 | 2.521 |
| 36644.0 | 2.558 |
| 36648.0 | 2.593 |
| 36649.0 | 2.561 |
| 36650.0 | 2.558 |
| 36651.0 | 2.571 |
| 36654.0 | 2.553 |
| 36655.0 | 2.524 |
| 36656.0 | 2.491 |
| 36657.0 | 2.521 |
| 36658.0 | 2.54 |
| 36661.0 | 2.524 |
| 36662.0 | 2.566 |
| 36663.0 | 2.538 |
| 36664.0 | 2.542 |
| 36665.0 | 2.491 |
| 36668.0 | 2.457 |
| 36669.0 | 2.468 |
| 36670.0 | 2.445 |
| 36671.0 | 2.478 |
| 36672.0 | 2.475 |
| 36675.0 | 2.497 |
| 36676.0 | 2.517 |
| 36677.0 | 2.529 |
| 36678.0 | 2.55 |
| 36679.0 | 2.591 |
| 36682.0 | 2.578 |
| 36683.0 | 2.564 |
| 36684.0 | 2.549 |
| 36685.0 | 2.553 |
| 36686.0 | 2.555 |
| 36689.0 | 2.555 |
| 36690.0 | 2.558 |
| 36691.0 | 2.578 |
| 36692.0 | 2.567 |
| 36693.0 | 2.552 |
| 36696.0 | 2.549 |
| 36697.0 | 2.56 |
| 36698.0 | 2.544 |
| 36699.0 | 2.538 |
| 36700.0 | 2.54 |
| 36703.0 | 2.539 |
| 36704.0 | 2.532 |
| 36705.0 | 2.537 |
| 36706.0 | 2.49 |
| 36707.0 | 2.514 |
| 36710.0 | 2.526 |
| 36711.0 | 2.525 |
| 36712.0 | 2.52 |
| 36713.0 | 2.516 |
| 36714.0 | 2.543 |
| 36717.0 | 2.547 |
| 36718.0 | 2.538 |
| 36719.0 | 2.543 |
| 36720.0 | 2.557 |
| 36721.0 | 2.562 |
| 36724.0 | 2.572 |
| 36725.0 | 2.561 |
| 36726.0 | 2.555 |
| 36727.0 | 2.561 |
| 36728.0 | 2.54 |
| 36731.0 | 2.54 |
| 36732.0 | 2.533 |
| 36733.0 | 2.536 |
| 36734.0 | 2.5 |
| 36735.0 | 2.49 |
| 36738.0 | 2.508 |
| 36739.0 | 2.502 |
| 36740.0 | 2.499 |
| 36741.0 | 2.471 |
| 36742.0 | 2.487 |
| 36745.0 | 2.498 |
| 36746.0 | 2.503 |
| 36747.0 | 2.518 |
| 36748.0 | 2.524 |
| 36749.0 | 2.524 |
| 36752.0 | 2.534 |
| 36753.0 | 2.53 |
| 36754.0 | 2.536 |
| 36755.0 | 2.527 |
| 36756.0 | 2.524 |
| 36759.0 | 2.52 |
| 36760.0 | 2.518 |
| 36761.0 | 2.518 |
| 36762.0 | 2.508 |
| 36763.0 | 2.522 |
| 36766.0 | 2.53 |
| 36767.0 | 2.526 |
| 36768.0 | 2.52 |
| 36769.0 | 2.522 |
| 36770.0 | 2.556 |
| 36773.0 | 2.582 |
| 36774.0 | 2.564 |
| 36775.0 | 2.556 |
| 36776.0 | 2.565 |
| 36777.0 | 2.537 |
| 36780.0 | 2.539 |
| 36781.0 | 2.535 |
| 36782.0 | 2.516 |
| 36783.0 | 2.53 |
| 36784.0 | 2.529 |
| 36787.0 | 2.509 |
| 36788.0 | 2.506 |
| 36789.0 | 2.487 |
| 36790.0 | 2.456 |
| 36791.0 | 2.457 |
| 36794.0 | 2.468 |
| 36795.0 | 2.454 |
| 36796.0 | 2.458 |
| 36797.0 | 2.453 |
| 36798.0 | 2.448 |
| 36801.0 | 2.462 |
| 36802.0 | 2.474 |
| 36803.0 | 2.461 |
| 36804.0 | 2.472 |
| 36805.0 | 2.461 |
| 36808.0 | 2.427 |
| 36809.0 | 2.434 |
| 36810.0 | 2.397 |
| 36811.0 | 2.398 |
| 36812.0 | 2.409 |
| 36815.0 | 2.412 |
| 36816.0 | 2.402 |
| 36817.0 | 2.371 |
| 36818.0 | 2.425 |
| 36819.0 | 2.44 |
| 36822.0 | 2.445 |
| 36823.0 | 2.482 |
| 36824.0 | 2.466 |
| 36825.0 | 2.451 |
| 36826.0 | 2.463 |
| 36829.0 | 2.467 |
| 36830.0 | 2.489 |
| 36831.0 | 2.497 |
| 36832.0 | 2.499 |
| 36833.0 | 2.502 |
| 36836.0 | 2.499 |
| 36837.0 | 2.495 |
| 36838.0 | 2.488 |
| 36839.0 | 2.478 |
| 36840.0 | 2.454 |
| 36843.0 | 2.428 |
| 36844.0 | 2.476 |
| 36845.0 | 2.488 |
| 36846.0 | 2.476 |
| 36847.0 | 2.461 |
| 36850.0 | 2.428 |
| 36851.0 | 2.442 |
| 36852.0 | 2.409 |
| 36853.0 | 2.425 |
| 36854.0 | 2.455 |
| 36857.0 | 2.457 |
| 36858.0 | 2.442 |
| 36859.0 | 2.446 |
| 36860.0 | 2.408 |
| 36861.0 | 2.425 |
| 36864.0 | 2.394 |
| 36865.0 | 2.447 |
| 36866.0 | 2.434 |
| 36867.0 | 2.444 |
| 36868.0 | 2.44 |
| 36871.0 | 2.464 |
| 36872.0 | 2.457 |
| 36873.0 | 2.441 |
| 36874.0 | 2.417 |
| 36875.0 | 2.389 |
| 36878.0 | 2.397 |
| 36879.0 | 2.418 |
| 36880.0 | 2.365 |
| 36881.0 | 2.357 |
| 36882.0 | 2.37 |
| 36887.0 | 2.39 |
| 36888.0 | 2.405 |
| 36889.0 | 2.405 |
| 36893.0 | 2.384 |
| 36894.0 | 2.371 |
| 36895.0 | 2.399 |
| 36896.0 | 2.394 |
| 36899.0 | 2.387 |
| 36900.0 | 2.365 |
| 36901.0 | 2.352 |
| 36902.0 | 2.379 |
| 36903.0 | 2.395 |
| 36906.0 | 2.403 |
| 36907.0 | 2.381 |
| 36908.0 | 2.41 |
| 36909.0 | 2.4 |
| 36910.0 | 2.389 |
| 36913.0 | 2.397 |
| 36914.0 | 2.397 |
| 36915.0 | 2.406 |
| 36916.0 | 2.408 |
| 36917.0 | 2.402 |
| 36920.0 | 2.401 |
| 36921.0 | 2.392 |
| 36922.0 | 2.408 |
| 36923.0 | 2.386 |
| 36924.0 | 2.373 |
| 36927.0 | 2.374 |
| 36928.0 | 2.385 |
| 36929.0 | 2.363 |
| 36930.0 | 2.369 |
| 36931.0 | 2.347 |
| 36934.0 | 2.361 |
| 36935.0 | 2.362 |
| 36936.0 | 2.339 |
| 36937.0 | 2.355 |
| 36938.0 | 2.327 |
| 36941.0 | 2.326 |
| 36942.0 | 2.315 |
| 36943.0 | 2.292 |
| 36944.0 | 2.27 |
| 36945.0 | 2.234 |
| 36948.0 | 2.258 |
| 36949.0 | 2.266 |
| 36950.0 | 2.261 |
| 36951.0 | 2.249 |
| 36952.0 | 2.255 |
| 36955.0 | 2.271 |
| 36956.0 | 2.292 |
| 36957.0 | 2.293 |
| 36958.0 | 2.279 |
| 36959.0 | 2.266 |
| 36962.0 | 2.227 |
| 36963.0 | 2.216 |
| 36964.0 | 2.195 |
| 36965.0 | 2.221 |
| 36966.0 | 2.189 |
| 36969.0 | 2.181 |
| 36970.0 | 2.207 |
| 36971.0 | 2.175 |
| 36972.0 | 2.111 |
| 36973.0 | 2.152 |
| 36976.0 | 2.202 |
| 36977.0 | 2.231 |
| 36978.0 | 2.206 |
| 36979.0 | 2.209 |
| 36980.0 | 2.216 |
| 36983.0 | 2.218 |
| 36984.0 | 2.165 |
| 36985.0 | 2.173 |
| 36986.0 | 2.207 |
| 36987.0 | 2.202 |
| 36990.0 | 2.222 |
| 36991.0 | 2.257 |
| 36992.0 | 2.265 |
| 36993.0 | 2.268 |
| 36998.0 | 2.253 |
| 36999.0 | 2.302 |
| 37000.0 | 2.295 |
| 37001.0 | 2.283 |
| 37004.0 | 2.266 |
| 37005.0 | 2.279 |
| 37006.0 | 2.276 |
| 37007.0 | 2.29 |
| 37008.0 | 2.312 |
| 37011.0 | 2.329 |
| 37012.0 | 2.329 |
| 37013.0 | 2.319 |
| 37014.0 | 2.289 |
| 37015.0 | 2.294 |
| 37018.0 | 2.314 |
| 37019.0 | 2.302 |
| 37020.0 | 2.293 |
| 37021.0 | 2.327 |
| 37022.0 | 2.314 |
| 37025.0 | 2.297 |
| 37026.0 | 2.306 |
| 37027.0 | 2.304 |
| 37028.0 | 2.322 |
| 37029.0 | 2.335 |
| 37032.0 | 2.339 |
| 37033.0 | 2.347 |
| 37034.0 | 2.332 |
| 37035.0 | 2.34 |
| 37036.0 | 2.32 |
| 37039.0 | 2.325 |
| 37040.0 | 2.314 |
| 37041.0 | 2.293 |
| 37042.0 | 2.297 |
| 37043.0 | 2.293 |
| 37046.0 | 2.299 |
| 37047.0 | 2.319 |
| 37048.0 | 2.311 |
| 37049.0 | 2.305 |
| 37050.0 | 2.305 |
| 37053.0 | 2.296 |
| 37054.0 | 2.251 |
| 37055.0 | 2.267 |
| 37056.0 | 2.249 |
| 37057.0 | 2.234 |
| 37060.0 | 2.21 |
| 37061.0 | 2.22 |
| 37062.0 | 2.213 |
| 37063.0 | 2.212 |
| 37064.0 | 2.219 |
| 37067.0 | 2.225 |
| 37068.0 | 2.202 |
| 37069.0 | 2.195 |
| 37070.0 | 2.211 |
| 37071.0 | 2.236 |
| 37074.0 | 2.257 |
| 37075.0 | 2.236 |
| 37076.0 | 2.226 |
| 37077.0 | 2.216 |
| 37078.0 | 2.178 |
| 37081.0 | 2.179 |
| 37082.0 | 2.163 |
| 37083.0 | 2.142 |
| 37084.0 | 2.155 |
| 37085.0 | 2.167 |
| 37088.0 | 2.155 |
| 37089.0 | 2.149 |
| 37090.0 | 2.118 |
| 37091.0 | 2.147 |
| 37092.0 | 2.132 |
| 37095.0 | 2.142 |
| 37096.0 | 2.125 |
| 37097.0 | 2.1 |
| 37098.0 | 2.12 |
| 37099.0 | 2.146 |
| 37102.0 | 2.168 |
| 37103.0 | 2.183 |
| 37104.0 | 2.184 |
| 37105.0 | 2.174 |
| 37106.0 | 2.16 |
| 37109.0 | 2.167 |
| 37110.0 | 2.166 |
| 37111.0 | 2.141 |
| 37112.0 | 2.109 |
| 37113.0 | 2.088 |
| 37116.0 | 2.105 |
| 37117.0 | 2.123 |
| 37118.0 | 2.112 |
| 37119.0 | 2.095 |
| 37120.0 | 2.061 |
| 37123.0 | 2.064 |
| 37124.0 | 2.073 |
| 37125.0 | 2.074 |
| 37126.0 | 2.083 |
| 37127.0 | 2.111 |
| 37130.0 | 2.111 |
| 37131.0 | 2.086 |
| 37132.0 | 2.089 |
| 37133.0 | 2.053 |
| 37134.0 | 2.055 |
| 37137.0 | 2.035 |
| 37138.0 | 2.053 |
| 37139.0 | 2.014 |
| 37140.0 | 1.979 |
| 37141.0 | 1.94 |
| 37144.0 | 1.933 |
| 37145.0 | 1.838 |
| 37146.0 | 1.856 |
| 37147.0 | 1.87 |
| 37148.0 | 1.779 |
| 37151.0 | 1.831 |
| 37152.0 | 1.824 |
| 37153.0 | 1.785 |
| 37154.0 | 1.72 |
| 37155.0 | 1.676 |
| 37158.0 | 1.768 |
| 37159.0 | 1.781 |
| 37160.0 | 1.809 |
| 37161.0 | 1.828 |
| 37162.0 | 1.872 |
| 37165.0 | 1.833 |
| 37166.0 | 1.858 |
| 37167.0 | 1.858 |
| 37168.0 | 1.914 |
| 37169.0 | 1.894 |
| 37172.0 | 1.896 |
| 37173.0 | 1.898 |
| 37174.0 | 1.945 |
| 37175.0 | 1.962 |
| 37176.0 | 1.957 |
| 37179.0 | 1.914 |
| 37180.0 | 1.939 |
| 37181.0 | 1.971 |
| 37182.0 | 1.941 |
| 37183.0 | 1.919 |
| 37186.0 | 1.95 |
| 37187.0 | 1.991 |
| 37188.0 | 2.003 |
| 37189.0 | 1.968 |
| 37190.0 | 2.003 |
| 37193.0 | 1.969 |
| 37194.0 | 1.922 |
| 37195.0 | 1.949 |
| 37196.0 | 1.962 |
| 37197.0 | 1.959 |
| 37201.0 | 1.995 |
| 37202.0 | 2.012 |
| 37203.0 | 2.046 |
| 37204.0 | 2.025 |
| 37207.0 | 2.055 |
| 37208.0 | 2.045 |
| 37209.0 | 2.041 |
| 37210.0 | 2.04 |
| 37211.0 | 2.055 |
| 37214.0 | 2.075 |
| 37215.0 | 2.057 |
| 37216.0 | 2.05 |
| 37217.0 | 2.065 |
| 37221.0 | 2.059 |
| 37222.0 | 2.031 |
| 37223.0 | 2.011 |
| 37224.0 | 2.01 |
| 37225.0 | 2.022 |
| 37228.0 | 2.017 |
| 37229.0 | 2.034 |
| 37230.0 | 2.085 |
| 37231.0 | 2.088 |
| 37232.0 | 2.074 |
| 37235.0 | 2.046 |
| 37237.0 | 2.035 |
| 37238.0 | 2.002 |
| 37239.0 | 1.986 |
| 37242.0 | 2.035 |
| 37243.0 | 2.031 |
| 37244.0 | 2.019 |
| 37245.0 | 2.006 |
| 37246.0 | 2.037 |
| 37249.0 | 2.037 |
| 37252.0 | 2.068 |
| 37253.0 | 2.079 |
| 37256.0 | 2.079 |
| 37258.0 | 2.06 |
| 37259.0 | 2.089 |
| 37260.0 | 2.084 |
| 37263.0 | 2.059 |
| 37264.0 | 2.048 |
| 37265.0 | 2.047 |
| 37266.0 | 2.025 |
| 37267.0 | 2.037 |
| 37270.0 | 1.994 |
| 37271.0 | 2.014 |
| 37272.0 | 1.989 |
| 37273.0 | 2.018 |
| 37274.0 | 2.014 |
| 37277.0 | 1.999 |
| 37278.0 | 2.005 |
| 37279.0 | 2.018 |
| 37280.0 | 2.042 |
| 37281.0 | 2.039 |
| 37285.0 | 2.032 |
| 37286.0 | 2.011 |
| 37287.0 | 2.027 |
| 37288.0 | 2.031 |
| 37291.0 | 2.006 |
| 37292.0 | 1.973 |
| 37293.0 | 1.952 |
| 37294.0 | 1.966 |
| 37295.0 | 1.961 |
| 37298.0 | 1.981 |
| 37299.0 | 1.976 |
| 37300.0 | 1.987 |
| 37301.0 | 2.005 |
| 37302.0 | 1.981 |
| 37305.0 | 1.973 |
| 37306.0 | 1.937 |
| 37307.0 | 1.93 |
| 37308.0 | 1.95 |
| 37309.0 | 1.929 |
| 37312.0 | 1.955 |
| 37313.0 | 1.966 |
| 37314.0 | 1.995 |
| 37315.0 | 2.009 |
| 37316.0 | 2.017 |
| 37319.0 | 2.057 |
| 37320.0 | 2.051 |
| 37321.0 | 2.057 |
| 37322.0 | 2.064 |
| 37323.0 | 2.073 |
| 37326.0 | 2.064 |
| 37327.0 | 2.048 |
| 37328.0 | 2.039 |
| 37329.0 | 2.043 |
| 37333.0 | 2.069 |
| 37334.0 | 2.075 |
| 37335.0 | 2.057 |
| 37336.0 | 2.047 |
| 37337.0 | 2.055 |
| 37340.0 | 2.043 |
| 37341.0 | 2.051 |
| 37342.0 | 2.052 |
| 37343.0 | 2.071 |
| 37348.0 | 2.055 |
| 37349.0 | 2.057 |
| 37350.0 | 2.035 |
| 37351.0 | 2.03 |
| 37354.0 | 2.001 |
| 37355.0 | 2.008 |
| 37356.0 | 2.023 |
| 37357.0 | 1.996 |
| 37358.0 | 2.003 |
| 37361.0 | 2.019 |
| 37362.0 | 2.055 |
| 37363.0 | 2.056 |
| 37364.0 | 2.04 |
| 37365.0 | 2.042 |
| 37368.0 | 2.025 |
| 37369.0 | 2.022 |
| 37370.0 | 2.009 |
| 37371.0 | 1.988 |
| 37372.0 | 1.983 |
| 37375.0 | 1.974 |
| 37376.0 | 1.988 |
| 37377.0 | 1.988 |
| 37378.0 | 1.976 |
| 37379.0 | 1.957 |
| 37382.0 | 1.949 |
| 37383.0 | 1.939 |
| 37384.0 | 1.975 |
| 37385.0 | 1.969 |
| 37386.0 | 1.944 |
| 37389.0 | 1.963 |
| 37390.0 | 1.989 |
| 37391.0 | 1.997 |
| 37392.0 | 1.99 |
| 37393.0 | 1.98 |
| 37396.0 | 1.966 |
| 37397.0 | 1.963 |
| 37398.0 | 1.941 |
| 37399.0 | 1.945 |
| 37400.0 | 1.949 |
| 37403.0 | 1.958 |
| 37404.0 | 1.947 |
| 37405.0 | 1.942 |
| 37406.0 | 1.911 |
| 37407.0 | 1.927 |
| 37410.0 | 1.909 |
| 37411.0 | 1.856 |
| 37412.0 | 1.859 |
| 37413.0 | 1.863 |
| 37414.0 | 1.833 |
| 37417.0 | 1.831 |
| 37418.0 | 1.858 |
| 37420.0 | 1.802 |
| 37421.0 | 1.762 |
| 37424.0 | 1.826 |
| 37425.0 | 1.823 |
| 37426.0 | 1.793 |
| 37427.0 | 1.763 |
| 37428.0 | 1.753 |
| 37431.0 | 1.701 |
| 37432.0 | 1.74 |
| 37433.0 | 1.711 |
| 37434.0 | 1.737 |
| 37435.0 | 1.798 |
| 37438.0 | 1.797 |
| 37439.0 | 1.735 |
| 37440.0 | 1.701 |
| 37441.0 | 1.742 |
| 37442.0 | 1.813 |
| 37445.0 | 1.809 |
| 37446.0 | 1.789 |
| 37447.0 | 1.728 |
| 37448.0 | 1.679 |
| 37449.0 | 1.68 |
| 37452.0 | 1.589 |
| 37453.0 | 1.591 |
| 37454.0 | 1.646 |
| 37455.0 | 1.662 |
| 37456.0 | 1.581 |
| 37459.0 | 1.498 |
| 37460.0 | 1.449 |
| 37461.0 | 1.437 |
| 37462.0 | 1.481 |
| 37463.0 | 1.494 |
| 37466.0 | 1.596 |
| 37467.0 | 1.579 |
| 37468.0 | 1.576 |
| 37469.0 | 1.506 |
| 37470.0 | 1.5 |
| 37473.0 | 1.442 |
| 37474.0 | 1.525 |
| 37475.0 | 1.51 |
| 37476.0 | 1.583 |
| 37477.0 | 1.61 |
| 37480.0 | 1.568 |
| 37481.0 | 1.583 |
| 37482.0 | 1.524 |
| 37483.0 | 1.572 |
| 37484.0 | 1.591 |
| 37487.0 | 1.649 |
| 37488.0 | 1.621 |
| 37489.0 | 1.638 |
| 37490.0 | 1.673 |
| 37491.0 | 1.647 |
| 37494.0 | 1.621 |
| 37495.0 | 1.669 |
| 37496.0 | 1.6 |
| 37497.0 | 1.566 |
| 37498.0 | 1.589 |
| 37501.0 | 1.551 |
| 37502.0 | 1.478 |
| 37503.0 | 1.492 |
| 37504.0 | 1.479 |
| 37505.0 | 1.539 |
| 37508.0 | 1.51 |
| 37509.0 | 1.551 |
| 37510.0 | 1.596 |
| 37511.0 | 1.524 |
| 37512.0 | 1.49 |
| 37515.0 | 1.482 |
| 37516.0 | 1.469 |
| 37517.0 | 1.403 |
| 37518.0 | 1.37 |
| 37519.0 | 1.357 |
| 37522.0 | 1.3 |
| 37523.0 | 1.28 |
| 37524.0 | 1.313 |
| 37525.0 | 1.397 |
| 37526.0 | 1.379 |
| 37529.0 | 1.291 |
| 37530.0 | 1.331 |
| 37531.0 | 1.391 |
| 37532.0 | 1.356 |
| 37533.0 | 1.304 |
| 37536.0 | 1.293 |
| 37537.0 | 1.269 |
| 37538.0 | 1.255 |
| 37539.0 | 1.311 |
| 37540.0 | 1.384 |
| 37543.0 | 1.364 |
| 37544.0 | 1.464 |
| 37545.0 | 1.44 |
| 37546.0 | 1.493 |
| 37547.0 | 1.488 |
| 37550.0 | 1.501 |
| 37551.0 | 1.477 |
| 37552.0 | 1.414 |
| 37553.0 | 1.455 |
| 37554.0 | 1.448 |
| 37557.0 | 1.478 |
| 37558.0 | 1.404 |
| 37559.0 | 1.454 |
| 37560.0 | 1.484 |
| 37561.0 | 1.465 |
| 37564.0 | 1.525 |
| 37565.0 | 1.537 |
| 37566.0 | 1.517 |
| 37567.0 | 1.464 |
| 37568.0 | 1.444 |
| 37571.0 | 1.434 |
| 37572.0 | 1.446 |
| 37573.0 | 1.435 |
| 37574.0 | 1.487 |
| 37575.0 | 1.493 |
| 37578.0 | 1.514 |
| 37579.0 | 1.501 |
| 37580.0 | 1.498 |
| 37581.0 | 1.553 |
| 37582.0 | 1.556 |
| 37585.0 | 1.55 |
| 37586.0 | 1.509 |
| 37587.0 | 1.559 |
| 37588.0 | 1.567 |
| 37589.0 | 1.56 |
| 37592.0 | 1.563 |
| 37593.0 | 1.521 |
| 37594.0 | 1.516 |
| 37595.0 | 1.488 |
| 37596.0 | 1.491 |
| 37599.0 | 1.449 |
| 37600.0 | 1.465 |
| 37601.0 | 1.481 |
| 37602.0 | 1.456 |
| 37603.0 | 1.431 |
| 37606.0 | 1.485 |
| 37607.0 | 1.467 |
| 37608.0 | 1.43 |
| 37609.0 | 1.417 |
| 37610.0 | 1.437 |
| 37613.0 | 1.447 |
| 37617.0 | 1.393 |
| 37620.0 | 1.406 |
| 37621.0 | 1.406 |
| 37623.0 | 1.485 |
| 37624.0 | 1.474 |
| 37627.0 | 1.49 |
| 37628.0 | 1.475 |
| 37629.0 | 1.443 |
| 37630.0 | 1.468 |
| 37631.0 | 1.466 |
| 37634.0 | 1.471 |
| 37635.0 | 1.478 |
| 37636.0 | 1.461 |
| 37637.0 | 1.458 |
| 37638.0 | 1.408 |
| 37641.0 | 1.385 |
| 37642.0 | 1.369 |
| 37643.0 | 1.339 |
| 37644.0 | 1.333 |
| 37645.0 | 1.311 |
| 37648.0 | 1.258 |
| 37649.0 | 1.262 |
| 37650.0 | 1.281 |
| 37651.0 | 1.313 |
| 37652.0 | 1.319 |
| 37655.0 | 1.334 |
| 37656.0 | 1.278 |
| 37657.0 | 1.305 |
| 37658.0 | 1.268 |
| 37659.0 | 1.244 |
| 37662.0 | 1.239 |
| 37663.0 | 1.282 |
| 37664.0 | 1.246 |
| 37665.0 | 1.237 |
| 37666.0 | 1.288 |
| 37669.0 | 1.314 |
| 37670.0 | 1.34 |
| 37671.0 | 1.294 |
| 37672.0 | 1.271 |
| 37673.0 | 1.294 |
| 37676.0 | 1.262 |
| 37677.0 | 1.208 |
| 37678.0 | 1.193 |
| 37679.0 | 1.224 |
| 37680.0 | 1.249 |
| 37683.0 | 1.25 |
| 37684.0 | 1.216 |
| 37685.0 | 1.208 |
| 37686.0 | 1.182 |
| 37687.0 | 1.145 |
| 37690.0 | 1.104 |
| 37691.0 | 1.103 |
| 37692.0 | 1.038 |
| 37693.0 | 1.132 |
| 37694.0 | 1.207 |
| 37697.0 | 1.26 |
| 37698.0 | 1.258 |
| 37699.0 | 1.28 |
| 37700.0 | 1.26 |
| 37701.0 | 1.32 |
| 37704.0 | 1.238 |
| 37705.0 | 1.278 |
| 37706.0 | 1.27 |
| 37707.0 | 1.243 |
| 37708.0 | 1.243 |
| 37711.0 | 1.177 |
| 37712.0 | 1.198 |
| 37713.0 | 1.262 |
| 37714.0 | 1.277 |
| 37715.0 | 1.303 |
| 37718.0 | 1.361 |
| 37719.0 | 1.341 |
| 37720.0 | 1.339 |
| 37721.0 | 1.303 |
| 37722.0 | 1.319 |
| 37725.0 | 1.336 |
| 37726.0 | 1.363 |
| 37727.0 | 1.349 |
| 37728.0 | 1.367 |
| 37733.0 | 1.379 |
| 37734.0 | 1.393 |
| 37735.0 | 1.359 |
| 37736.0 | 1.335 |
| 37739.0 | 1.38 |
| 37740.0 | 1.366 |
| 37741.0 | 1.367 |
| 37742.0 | 1.367 |
| 37743.0 | 1.366 |
| 37746.0 | 1.384 |
| 37747.0 | 1.408 |
| 37748.0 | 1.388 |
| 37749.0 | 1.344 |
| 37750.0 | 1.361 |
| 37753.0 | 1.364 |
| 37754.0 | 1.36 |
| 37755.0 | 1.359 |
| 37756.0 | 1.38 |
| 37757.0 | 1.383 |
| 37760.0 | 1.319 |
| 37761.0 | 1.32 |
| 37762.0 | 1.307 |
| 37763.0 | 1.328 |
| 37764.0 | 1.318 |
| 37767.0 | 1.316 |
| 37768.0 | 1.327 |
| 37769.0 | 1.358 |
| 37770.0 | 1.359 |
| 37771.0 | 1.371 |
| 37774.0 | 1.401 |
| 37775.0 | 1.393 |
| 37776.0 | 1.411 |
| 37777.0 | 1.393 |
| 37778.0 | 1.427 |
| 37781.0 | 1.407 |
| 37782.0 | 1.42 |
| 37783.0 | 1.445 |
| 37784.0 | 1.461 |
| 37785.0 | 1.438 |
| 37788.0 | 1.468 |
| 37789.0 | 1.476 |
| 37790.0 | 1.488 |
| 37791.0 | 1.468 |
| 37792.0 | 1.481 |
| 37795.0 | 1.444 |
| 37796.0 | 1.442 |
| 37797.0 | 1.446 |
| 37798.0 | 1.445 |
| 37799.0 | 1.446 |
| 37802.0 | 1.425 |
| 37803.0 | 1.394 |
| 37804.0 | 1.426 |
| 37805.0 | 1.427 |
| 37806.0 | 1.419 |
| 37809.0 | 1.465 |
| 37810.0 | 1.468 |
| 37811.0 | 1.457 |
| 37812.0 | 1.439 |
| 37813.0 | 1.46 |
| 37816.0 | 1.483 |
| 37817.0 | 1.475 |
| 37818.0 | 1.466 |
| 37819.0 | 1.443 |
| 37820.0 | 1.449 |
| 37823.0 | 1.426 |
| 37824.0 | 1.436 |
| 37825.0 | 1.431 |
| 37826.0 | 1.462 |
| 37827.0 | 1.439 |
| 37830.0 | 1.465 |
| 37831.0 | 1.455 |
| 37832.0 | 1.463 |
| 37833.0 | 1.484 |
| 37834.0 | 1.461 |
| 37837.0 | 1.447 |
| 37838.0 | 1.462 |
| 37839.0 | 1.436 |
| 37840.0 | 1.435 |
| 37841.0 | 1.449 |
| 37844.0 | 1.46 |
| 37845.0 | 1.471 |
| 37846.0 | 1.471 |
| 37847.0 | 1.498 |
| 37848.0 | 1.501 |
| 37851.0 | 1.515 |
| 37852.0 | 1.518 |
| 37853.0 | 1.508 |
| 37854.0 | 1.52 |
| 37855.0 | 1.526 |
| 37858.0 | 1.51 |
| 37859.0 | 1.494 |
| 37860.0 | 1.507 |
| 37861.0 | 1.516 |
| 37862.0 | 1.505 |
| 37865.0 | 1.53 |
| 37866.0 | 1.529 |
| 37867.0 | 1.552 |
| 37868.0 | 1.551 |
| 37869.0 | 1.537 |
| 37872.0 | 1.549 |
| 37873.0 | 1.531 |
| 37874.0 | 1.51 |
| 37875.0 | 1.514 |
| 37876.0 | 1.499 |
| 37879.0 | 1.504 |
| 37880.0 | 1.521 |
| 37881.0 | 1.522 |
| 37882.0 | 1.534 |
| 37883.0 | 1.519 |
| 37886.0 | 1.481 |
| 37887.0 | 1.469 |
| 37888.0 | 1.459 |
| 37889.0 | 1.452 |
| 37890.0 | 1.442 |
| 37893.0 | 1.438 |
| 37894.0 | 1.411 |
| 37895.0 | 1.437 |
| 37896.0 | 1.434 |
| 37897.0 | 1.482 |
| 37900.0 | 1.471 |
| 37901.0 | 1.459 |
| 37902.0 | 1.457 |
| 37903.0 | 1.491 |
| 37904.0 | 1.483 |
| 37907.0 | 1.509 |
| 37908.0 | 1.503 |
| 37909.0 | 1.513 |
| 37910.0 | 1.506 |
| 37911.0 | 1.502 |
| 37914.0 | 1.502 |
| 37915.0 | 1.507 |
| 37916.0 | 1.478 |
| 37917.0 | 1.466 |
| 37918.0 | 1.463 |
| 37921.0 | 1.48 |
| 37922.0 | 1.497 |
| 37923.0 | 1.505 |
| 37924.0 | 1.513 |
| 37925.0 | 1.515 |
| 37928.0 | 1.547 |
| 37929.0 | 1.544 |
| 37930.0 | 1.535 |
| 37931.0 | 1.544 |
| 37932.0 | 1.561 |
| 37935.0 | 1.547 |
| 37936.0 | 1.54 |
| 37937.0 | 1.544 |
| 37938.0 | 1.549 |
| 37939.0 | 1.56 |
| 37942.0 | 1.521 |
| 37943.0 | 1.52 |
| 37944.0 | 1.515 |
| 37945.0 | 1.512 |
| 37946.0 | 1.517 |
| 37949.0 | 1.547 |
| 37950.0 | 1.543 |
| 37951.0 | 1.54 |
| 37952.0 | 1.549 |
| 37953.0 | 1.546 |
| 37956.0 | 1.57 |
| 37957.0 | 1.566 |
| 37958.0 | 1.58 |
| 37959.0 | 1.58 |
| 37960.0 | 1.569 |
| 37963.0 | 1.557 |
| 37964.0 | 1.569 |
| 37965.0 | 1.563 |
| 37966.0 | 1.575 |
| 37967.0 | 1.576 |
| 37970.0 | 1.583 |
| 37971.0 | 1.582 |
| 37972.0 | 1.58 |
| 37973.0 | 1.591 |
| 37974.0 | 1.597 |
| 37977.0 | 1.591 |
| 37978.0 | 1.595 |
| 37979.0 | 1.597 |
| 37984.0 | 1.607 |
| 37985.0 | 1.61 |
| 37986.0 | 1.616 |
| 37988.0 | 1.635 |
| 37991.0 | 1.64 |
| 37992.0 | 1.639 |
| 37993.0 | 1.627 |
| 37994.0 | 1.647 |
| 37995.0 | 1.636 |
| 37998.0 | 1.633 |
| 37999.0 | 1.637 |
| 38000.0 | 1.651 |
| 38001.0 | 1.657 |
| 38002.0 | 1.67 |
| 38005.0 | 1.677 |
| 38006.0 | 1.666 |
| 38007.0 | 1.674 |
| 38008.0 | 1.683 |
| 38009.0 | 1.683 |
| 38012.0 | 1.674 |
| 38013.0 | 1.679 |
| 38014.0 | 1.685 |
| 38015.0 | 1.667 |
| 38016.0 | 1.656 |
| 38019.0 | 1.664 |
| 38020.0 | 1.657 |
| 38021.0 | 1.646 |
| 38022.0 | 1.645 |
| 38023.0 | 1.653 |
| 38026.0 | 1.672 |
| 38027.0 | 1.677 |
| 38028.0 | 1.682 |
| 38029.0 | 1.685 |
| 38030.0 | 1.667 |
| 38033.0 | 1.675 |
| 38034.0 | 1.684 |
| 38035.0 | 1.686 |
| 38036.0 | 1.703 |
| 38037.0 | 1.689 |
| 38040.0 | 1.69 |
| 38041.0 | 1.67 |
| 38042.0 | 1.673 |
| 38043.0 | 1.679 |
| 38044.0 | 1.683 |
| 38047.0 | 1.696 |
| 38048.0 | 1.71 |
| 38049.0 | 1.7 |
| 38050.0 | 1.713 |
| 38051.0 | 1.709 |
| 38054.0 | 1.716 |
| 38055.0 | 1.698 |
| 38056.0 | 1.698 |
| 38057.0 | 1.654 |
| 38058.0 | 1.654 |
| 38061.0 | 1.613 |
| 38062.0 | 1.622 |
| 38063.0 | 1.647 |
| 38064.0 | 1.616 |
| 38065.0 | 1.621 |
| 38068.0 | 1.59 |
| 38069.0 | 1.591 |
| 38070.0 | 1.585 |
| 38071.0 | 1.611 |
| 38072.0 | 1.617 |
| 38075.0 | 1.635 |
| 38076.0 | 1.632 |
| 38077.0 | 1.63 |
| 38078.0 | 1.646 |
| 38079.0 | 1.679 |
| 38082.0 | 1.69 |
| 38083.0 | 1.669 |
| 38084.0 | 1.663 |
| 38085.0 | 1.666 |
| 38090.0 | 1.682 |
| 38091.0 | 1.665 |
| 38092.0 | 1.664 |
| 38093.0 | 1.67 |
| 38096.0 | 1.666 |
| 38097.0 | 1.676 |
| 38098.0 | 1.664 |
| 38099.0 | 1.676 |
| 38100.0 | 1.684 |
| 38103.0 | 1.68 |
| 38104.0 | 1.679 |
| 38105.0 | 1.655 |
| 38106.0 | 1.639 |
| 38107.0 | 1.63 |
| 38110.0 | 1.639 |
| 38111.0 | 1.636 |
| 38112.0 | 1.648 |
| 38113.0 | 1.618 |
| 38114.0 | 1.614 |
| 38117.0 | 1.576 |
| 38118.0 | 1.595 |
| 38119.0 | 1.573 |
| 38120.0 | 1.59 |
| 38121.0 | 1.581 |
| 38124.0 | 1.562 |
| 38125.0 | 1.571 |
| 38126.0 | 1.599 |
| 38127.0 | 1.588 |
| 38128.0 | 1.582 |
| 38131.0 | 1.592 |
| 38132.0 | 1.583 |
| 38133.0 | 1.599 |
| 38134.0 | 1.611 |
| 38135.0 | 1.603 |
| 38138.0 | 1.61 |
| 38139.0 | 1.591 |
| 38140.0 | 1.6 |
| 38141.0 | 1.603 |
| 38142.0 | 1.619 |
| 38145.0 | 1.636 |
| 38146.0 | 1.636 |
| 38147.0 | 1.63 |
| 38148.0 | 1.636 |
| 38149.0 | 1.635 |
| 38152.0 | 1.615 |
| 38153.0 | 1.629 |
| 38154.0 | 1.64 |
| 38155.0 | 1.64 |
| 38156.0 | 1.647 |
| 38159.0 | 1.645 |
| 38160.0 | 1.627 |
| 38161.0 | 1.633 |
| 38162.0 | 1.648 |
| 38163.0 | 1.646 |
| 38166.0 | 1.657 |
| 38167.0 | 1.651 |
| 38168.0 | 1.642 |
| 38169.0 | 1.64 |
| 38170.0 | 1.628 |
| 38173.0 | 1.628 |
| 38174.0 | 1.618 |
| 38175.0 | 1.618 |
| 38176.0 | 1.624 |
| 38177.0 | 1.624 |
| 38180.0 | 1.615 |
| 38181.0 | 1.617 |
| 38182.0 | 1.613 |
| 38183.0 | 1.592 |
| 38184.0 | 1.591 |
| 38187.0 | 1.582 |
| 38188.0 | 1.588 |
| 38189.0 | 1.599 |
| 38190.0 | 1.573 |
| 38191.0 | 1.569 |
| 38194.0 | 1.552 |
| 38195.0 | 1.568 |
| 38196.0 | 1.565 |
| 38197.0 | 1.593 |
| 38198.0 | 1.594 |
| 38201.0 | 1.582 |
| 38202.0 | 1.59 |
| 38203.0 | 1.575 |
| 38204.0 | 1.578 |
| 38205.0 | 1.54 |
| 38208.0 | 1.527 |
| 38209.0 | 1.54 |
| 38210.0 | 1.526 |
| 38211.0 | 1.523 |
| 38212.0 | 1.518 |
| 38215.0 | 1.532 |
| 38216.0 | 1.539 |
| 38217.0 | 1.544 |
| 38218.0 | 1.546 |
| 38219.0 | 1.543 |
| 38222.0 | 1.563 |
| 38223.0 | 1.562 |
| 38224.0 | 1.565 |
| 38225.0 | 1.578 |
| 38226.0 | 1.586 |
| 38229.0 | 1.582 |
| 38230.0 | 1.568 |
| 38231.0 | 1.579 |
| 38232.0 | 1.59 |
| 38233.0 | 1.605 |
| 38236.0 | 1.609 |
| 38237.0 | 1.611 |
| 38238.0 | 1.609 |
| 38239.0 | 1.6 |
| 38240.0 | 1.608 |
| 38243.0 | 1.626 |
| 38244.0 | 1.621 |
| 38245.0 | 1.617 |
| 38246.0 | 1.618 |
| 38247.0 | 1.63 |
| 38250.0 | 1.624 |
| 38251.0 | 1.631 |
| 38252.0 | 1.615 |
| 38253.0 | 1.602 |
| 38254.0 | 1.605 |
| 38257.0 | 1.597 |
| 38258.0 | 1.602 |
| 38259.0 | 1.608 |
| 38260.0 | 1.598 |
| 38261.0 | 1.634 |
| 38264.0 | 1.648 |
| 38265.0 | 1.652 |
| 38266.0 | 1.652 |
| 38267.0 | 1.654 |
| 38268.0 | 1.645 |
| 38271.0 | 1.643 |
| 38272.0 | 1.63 |
| 38273.0 | 1.632 |
| 38274.0 | 1.624 |
| 38275.0 | 1.622 |
| 38278.0 | 1.62 |
| 38279.0 | 1.637 |
| 38280.0 | 1.62 |
| 38281.0 | 1.629 |
| 38282.0 | 1.63 |
| 38285.0 | 1.602 |
| 38286.0 | 1.605 |
| 38287.0 | 1.629 |
| 38288.0 | 1.646 |
| 38289.0 | 1.642 |
| 38292.0 | 1.654 |
| 38293.0 | 1.664 |
| 38294.0 | 1.667 |
| 38295.0 | 1.666 |
| 38296.0 | 1.674 |
| 38299.0 | 1.673 |
| 38300.0 | 1.669 |
| 38301.0 | 1.673 |
| 38302.0 | 1.689 |
| 38303.0 | 1.69 |
| 38306.0 | 1.686 |
| 38307.0 | 1.676 |
| 38308.0 | 1.698 |
| 38309.0 | 1.695 |
| 38310.0 | 1.683 |
| 38313.0 | 1.677 |
| 38314.0 | 1.675 |
| 38315.0 | 1.675 |
| 38316.0 | 1.689 |
| 38317.0 | 1.686 |
| 38320.0 | 1.682 |
| 38321.0 | 1.675 |
| 38322.0 | 1.693 |
| 38323.0 | 1.7 |
| 38324.0 | 1.692 |
| 38327.0 | 1.689 |
| 38328.0 | 1.696 |
| 38329.0 | 1.693 |
| 38330.0 | 1.681 |
| 38331.0 | 1.689 |
| 38334.0 | 1.701 |
| 38335.0 | 1.704 |
| 38336.0 | 1.698 |
| 38337.0 | 1.701 |
| 38338.0 | 1.682 |
| 38341.0 | 1.69 |
| 38342.0 | 1.693 |
| 38343.0 | 1.705 |
| 38344.0 | 1.712 |
| 38348.0 | 1.709 |
| 38349.0 | 1.714 |
| 38350.0 | 1.713 |
| 38351.0 | 1.712 |
| 38352.0 | 1.712 |
| 38355.0 | 1.721 |
| 38356.0 | 1.722 |
| 38357.0 | 1.71 |
| 38358.0 | 1.719 |
| 38359.0 | 1.726 |
| 38362.0 | 1.725 |
| 38363.0 | 1.711 |
| 38364.0 | 1.699 |
| 38365.0 | 1.705 |
| 38366.0 | 1.711 |
| 38369.0 | 1.718 |
| 38370.0 | 1.717 |
| 38371.0 | 1.716 |
| 38372.0 | 1.705 |
| 38373.0 | 1.707 |
| 38376.0 | 1.705 |
| 38377.0 | 1.716 |
| 38378.0 | 1.715 |
| 38379.0 | 1.722 |
| 38380.0 | 1.714 |
| 38383.0 | 1.728 |
| 38384.0 | 1.74 |
| 38385.0 | 1.746 |
| 38386.0 | 1.741 |
| 38387.0 | 1.753 |
| 38390.0 | 1.76 |
| 38391.0 | 1.762 |
| 38392.0 | 1.757 |
| 38393.0 | 1.757 |
| 38394.0 | 1.774 |
| 38397.0 | 1.772 |
| 38398.0 | 1.777 |
| 38399.0 | 1.768 |
| 38400.0 | 1.768 |
| 38401.0 | 1.77 |
| 38404.0 | 1.766 |
| 38405.0 | 1.757 |
| 38406.0 | 1.749 |
| 38407.0 | 1.748 |
| 38408.0 | 1.766 |
| 38411.0 | 1.763 |
| 38412.0 | 1.773 |
| 38413.0 | 1.775 |
| 38414.0 | 1.773 |
| 38415.0 | 1.786 |
| 38418.0 | 1.79 |
| 38419.0 | 1.782 |
| 38420.0 | 1.775 |
| 38421.0 | 1.761 |
| 38422.0 | 1.764 |
| 38425.0 | 1.765 |
| 38426.0 | 1.775 |
| 38427.0 | 1.751 |
| 38428.0 | 1.755 |
| 38429.0 | 1.761 |
| 38432.0 | 1.754 |
| 38433.0 | 1.76 |
| 38434.0 | 1.753 |
| 38435.0 | 1.765 |
| 38440.0 | 1.769 |
| 38441.0 | 1.762 |
| 38442.0 | 1.762 |
| 38443.0 | 1.765 |
| 38446.0 | 1.756 |
| 38447.0 | 1.766 |
| 38448.0 | 1.772 |
| 38449.0 | 1.779 |
| 38450.0 | 1.778 |
| 38453.0 | 1.774 |
| 38454.0 | 1.767 |
| 38455.0 | 1.774 |
| 38456.0 | 1.771 |
| 38457.0 | 1.742 |
| 38460.0 | 1.71 |
| 38461.0 | 1.715 |
| 38462.0 | 1.709 |
| 38463.0 | 1.712 |
| 38464.0 | 1.724 |
| 38467.0 | 1.729 |
| 38468.0 | 1.728 |
| 38469.0 | 1.708 |
| 38470.0 | 1.702 |
| 38471.0 | 1.702 |
| 38474.0 | 1.711 |
| 38475.0 | 1.718 |
| 38476.0 | 1.727 |
| 38477.0 | 1.738 |
| 38478.0 | 1.745 |
| 38481.0 | 1.739 |
| 38482.0 | 1.728 |
| 38483.0 | 1.721 |
| 38484.0 | 1.732 |
| 38485.0 | 1.733 |
| 38488.0 | 1.73 |
| 38489.0 | 1.728 |
| 38490.0 | 1.753 |
| 38491.0 | 1.76 |
| 38492.0 | 1.76 |
| 38495.0 | 1.769 |
| 38496.0 | 1.767 |
| 38497.0 | 1.764 |
| 38498.0 | 1.776 |
| 38499.0 | 1.775 |
| 38502.0 | 1.781 |
| 38503.0 | 1.772 |
| 38504.0 | 1.795 |
| 38505.0 | 1.797 |
| 38506.0 | 1.79 |
| 38509.0 | 1.783 |
| 38510.0 | 1.799 |
| 38511.0 | 1.795 |
| 38512.0 | 1.794 |
| 38513.0 | 1.803 |
| 38516.0 | 1.811 |
| 38517.0 | 1.812 |
| 38518.0 | 1.805 |
| 38519.0 | 1.811 |
| 38520.0 | 1.819 |
| 38523.0 | 1.812 |
| 38524.0 | 1.82 |
| 38525.0 | 1.821 |
| 38526.0 | 1.825 |
| 38527.0 | 1.811 |
| 38530.0 | 1.798 |
| 38531.0 | 1.812 |
| 38532.0 | 1.819 |
| 38533.0 | 1.82 |
| 38534.0 | 1.833 |
| 38537.0 | 1.836 |
| 38538.0 | 1.832 |
| 38539.0 | 1.84 |
| 38540.0 | 1.815 |
| 38541.0 | 1.84 |
| 38544.0 | 1.85 |
| 38545.0 | 1.845 |
| 38546.0 | 1.856 |
| 38547.0 | 1.863 |
| 38548.0 | 1.864 |
| 38551.0 | 1.863 |
| 38552.0 | 1.879 |
| 38553.0 | 1.875 |
| 38554.0 | 1.873 |
| 38555.0 | 1.87 |
| 38558.0 | 1.872 |
| 38559.0 | 1.874 |
| 38560.0 | 1.878 |
| 38561.0 | 1.888 |
| 38562.0 | 1.885 |
| 38565.0 | 1.882 |
| 38566.0 | 1.895 |
| 38567.0 | 1.892 |
| 38568.0 | 1.878 |
| 38569.0 | 1.865 |
| 38572.0 | 1.87 |
| 38573.0 | 1.887 |
| 38574.0 | 1.904 |
| 38575.0 | 1.897 |
| 38576.0 | 1.888 |
| 38579.0 | 1.885 |
| 38580.0 | 1.876 |
| 38581.0 | 1.872 |
| 38582.0 | 1.866 |
| 38583.0 | 1.885 |
| 38586.0 | 1.886 |
| 38587.0 | 1.873 |
| 38588.0 | 1.871 |
| 38589.0 | 1.855 |
| 38590.0 | 1.84 |
| 38593.0 | 1.847 |
| 38594.0 | 1.844 |
| 38595.0 | 1.857 |
| 38596.0 | 1.865 |
| 38597.0 | 1.862 |
| 38600.0 | 1.874 |
| 38601.0 | 1.891 |
| 38602.0 | 1.895 |
| 38603.0 | 1.893 |
| 38604.0 | 1.899 |
| 38607.0 | 1.897 |
| 38608.0 | 1.884 |
| 38609.0 | 1.89 |
| 38610.0 | 1.89 |
| 38611.0 | 1.902 |
| 38614.0 | 1.898 |
| 38615.0 | 1.906 |
| 38616.0 | 1.885 |
| 38617.0 | 1.879 |
| 38618.0 | 1.887 |
| 38621.0 | 1.917 |
| 38622.0 | 1.91 |
| 38623.0 | 1.929 |
| 38624.0 | 1.922 |
| 38625.0 | 1.928 |
| 38628.0 | 1.937 |
| 38629.0 | 1.943 |
| 38630.0 | 1.924 |
| 38631.0 | 1.909 |
| 38632.0 | 1.905 |
| 38635.0 | 1.908 |
| 38636.0 | 1.911 |
| 38637.0 | 1.899 |
| 38638.0 | 1.887 |
| 38639.0 | 1.895 |
| 38642.0 | 1.898 |
| 38643.0 | 1.888 |
| 38644.0 | 1.864 |
| 38645.0 | 1.866 |
| 38646.0 | 1.86 |
| 38649.0 | 1.878 |
| 38650.0 | 1.87 |
| 38651.0 | 1.875 |
| 38652.0 | 1.847 |
| 38653.0 | 1.849 |
| 38656.0 | 1.882 |
| 38657.0 | 1.879 |
| 38658.0 | 1.882 |
| 38659.0 | 1.9 |
| 38660.0 | 1.897 |
| 38663.0 | 1.9 |
| 38664.0 | 1.9 |
| 38665.0 | 1.897 |
| 38666.0 | 1.9 |
| 38667.0 | 1.919 |
| 38670.0 | 1.921 |
| 38671.0 | 1.922 |
| 38672.0 | 1.913 |
| 38673.0 | 1.918 |
| 38674.0 | 1.928 |
| 38677.0 | 1.937 |
| 38678.0 | 1.937 |
| 38679.0 | 1.946 |
| 38680.0 | 1.941 |
| 38681.0 | 1.944 |
| 38684.0 | 1.939 |
| 38685.0 | 1.943 |
| 38686.0 | 1.936 |
| 38687.0 | 1.959 |
| 38688.0 | 1.966 |
| 38691.0 | 1.958 |
| 38692.0 | 1.965 |
| 38693.0 | 1.96 |
| 38694.0 | 1.962 |
| 38695.0 | 1.958 |
| 38698.0 | 1.964 |
| 38699.0 | 1.97 |
| 38700.0 | 1.966 |
| 38701.0 | 1.967 |
| 38702.0 | 1.981 |
| 38705.0 | 1.979 |
| 38706.0 | 1.983 |
| 38707.0 | 1.995 |
| 38708.0 | 1.995 |
| 38709.0 | 1.998 |
| 38713.0 | 2.004 |
| 38714.0 | 2.001 |
| 38715.0 | 2.005 |
| 38716.0 | 1.99 |
| 38719.0 | 2 |
| 38720.0 | 2.004 |
| 38721.0 | 2.02 |
| 38722.0 | 2.019 |
| 38723.0 | 2.025 |
| 38726.0 | 2.027 |
| 38727.0 | 2.017 |
| 38728.0 | 2.026 |
| 38729.0 | 2.027 |
| 38730.0 | 2.01 |
| 38733.0 | 2.016 |
| 38734.0 | 2.003 |
| 38735.0 | 1.987 |
| 38736.0 | 1.996 |
| 38737.0 | 1.979 |
| 38740.0 | 1.976 |
| 38741.0 | 1.971 |
| 38742.0 | 1.99 |
| 38743.0 | 2.015 |
| 38744.0 | 2.033 |
| 38747.0 | 2.029 |
| 38748.0 | 2.035 |
| 38749.0 | 2.049 |
| 38750.0 | 2.029 |
| 38751.0 | 2.03 |
| 38754.0 | 2.031 |
| 38755.0 | 2.031 |
| 38756.0 | 2.027 |
| 38757.0 | 2.049 |
| 38758.0 | 2.037 |
| 38761.0 | 2.049 |
| 38762.0 | 2.052 |
| 38763.0 | 2.05 |
| 38764.0 | 2.06 |
| 38765.0 | 2.064 |
| 38768.0 | 2.064 |
| 38769.0 | 2.069 |
| 38770.0 | 2.084 |
| 38771.0 | 2.082 |
| 38772.0 | 2.087 |
| 38775.0 | 2.092 |
| 38776.0 | 2.067 |
| 38777.0 | 2.079 |
| 38778.0 | 2.063 |
| 38779.0 | 2.051 |
| 38782.0 | 2.059 |
| 38783.0 | 2.056 |
| 38784.0 | 2.049 |
| 38785.0 | 2.061 |
| 38786.0 | 2.076 |
| 38789.0 | 2.086 |
| 38790.0 | 2.089 |
| 38791.0 | 2.093 |
| 38792.0 | 2.092 |
| 38793.0 | 2.089 |
| 38796.0 | 2.093 |
| 38797.0 | 2.095 |
| 38798.0 | 2.102 |
| 38799.0 | 2.099 |
| 38800.0 | 2.103 |
| 38803.0 | 2.087 |
| 38804.0 | 2.081 |
| 38805.0 | 2.087 |
| 38806.0 | 2.105 |
| 38807.0 | 2.097 |
| 38810.0 | 2.106 |
| 38811.0 | 2.096 |
| 38812.0 | 2.101 |
| 38813.0 | 2.1 |
| 38814.0 | 2.085 |
| 38817.0 | 2.093 |
| 38818.0 | 2.072 |
| 38819.0 | 2.068 |
| 38820.0 | 2.069 |
| 38825.0 | 2.066 |
| 38826.0 | 2.085 |
| 38827.0 | 2.099 |
| 38828.0 | 2.11 |
| 38831.0 | 2.1 |
| 38832.0 | 2.103 |
| 38833.0 | 2.109 |
| 38834.0 | 2.101 |
| 38835.0 | 2.092 |
| 38838.0 | 2.092 |
| 38839.0 | 2.1 |
| 38840.0 | 2.085 |
| 38841.0 | 2.093 |
| 38842.0 | 2.105 |
| 38845.0 | 2.106 |
| 38846.0 | 2.111 |
| 38847.0 | 2.101 |
| 38848.0 | 2.091 |
| 38849.0 | 2.058 |
| 38852.0 | 2.043 |
| 38853.0 | 2.05 |
| 38854.0 | 2.001 |
| 38855.0 | 2.001 |
| 38856.0 | 2.009 |
| 38859.0 | 1.974 |
| 38860.0 | 2.007 |
| 38861.0 | 1.989 |
| 38862.0 | 2.013 |
| 38863.0 | 2.038 |
| 38866.0 | 2.03 |
| 38867.0 | 1.995 |
| 38868.0 | 2.014 |
| 38869.0 | 2.018 |
| 38870.0 | 2.013 |
| 38873.0 | 2 |
| 38874.0 | 1.97 |
| 38875.0 | 1.984 |
| 38876.0 | 1.942 |
| 38877.0 | 1.967 |
| 38880.0 | 1.95 |
| 38881.0 | 1.92 |
| 38882.0 | 1.922 |
| 38883.0 | 1.955 |
| 38884.0 | 1.943 |
| 38887.0 | 1.954 |
| 38888.0 | 1.964 |
| 38889.0 | 1.969 |
| 38890.0 | 1.976 |
| 38891.0 | 1.979 |
| 38894.0 | 1.972 |
| 38895.0 | 1.961 |
| 38896.0 | 1.961 |
| 38897.0 | 1.992 |
| 38898.0 | 2.018 |
| 38901.0 | 2.024 |
| 38902.0 | 2.027 |
| 38903.0 | 2.006 |
| 38904.0 | 2.023 |
| 38905.0 | 2.019 |
| 38908.0 | 2.025 |
| 38909.0 | 2.006 |
| 38910.0 | 2.011 |
| 38911.0 | 1.984 |
| 38912.0 | 1.961 |
| 38915.0 | 1.957 |
| 38916.0 | 1.955 |
| 38917.0 | 1.993 |
| 38918.0 | 1.995 |
| 38919.0 | 1.981 |
| 38922.0 | 2.012 |
| 38923.0 | 2.011 |
| 38924.0 | 2.015 |
| 38925.0 | 2.031 |
| 38926.0 | 2.042 |
| 38929.0 | 2.035 |
| 38930.0 | 2.015 |
| 38931.0 | 2.037 |
| 38932.0 | 2.026 |
| 38933.0 | 2.045 |
| 38936.0 | 2.022 |
| 38937.0 | 2.026 |
| 38938.0 | 2.041 |
| 38939.0 | 2.029 |
| 38940.0 | 2.028 |
| 38943.0 | 2.046 |
| 38944.0 | 2.064 |
| 38945.0 | 2.073 |
| 38946.0 | 2.077 |
| 38947.0 | 2.073 |
| 38950.0 | 2.068 |
| 38951.0 | 2.074 |
| 38952.0 | 2.061 |
| 38953.0 | 2.07 |
| 38954.0 | 2.07 |
| 38957.0 | 2.08 |
| 38958.0 | 2.079 |
| 38959.0 | 2.083 |
| 38960.0 | 2.08 |
| 38961.0 | 2.085 |
| 38964.0 | 2.091 |
| 38965.0 | 2.083 |
| 38966.0 | 2.066 |
| 38967.0 | 2.054 |
| 38968.0 | 2.058 |
| 38971.0 | 2.055 |
| 38972.0 | 2.072 |
| 38973.0 | 2.079 |
| 38974.0 | 2.075 |
| 38975.0 | 2.081 |
| 38978.0 | 2.08 |
| 38979.0 | 2.069 |
| 38980.0 | 2.092 |
| 38981.0 | 2.098 |
| 38982.0 | 2.082 |
| 38985.0 | 2.085 |
| 38986.0 | 2.104 |
| 38987.0 | 2.113 |
| 38988.0 | 2.112 |
| 38989.0 | 2.114 |
| 38992.0 | 2.111 |
| 38993.0 | 2.107 |
| 38994.0 | 2.12 |
| 38995.0 | 2.129 |
| 38996.0 | 2.129 |
| 38999.0 | 2.129 |
| 39000.0 | 2.136 |
| 39001.0 | 2.139 |
| 39002.0 | 2.151 |
| 39003.0 | 2.15 |
| 39006.0 | 2.151 |
| 39007.0 | 2.132 |
| 39008.0 | 2.148 |
| 39009.0 | 2.146 |
| 39010.0 | 2.15 |
| 39013.0 | 2.158 |
| 39014.0 | 2.156 |
| 39015.0 | 2.158 |
| 39016.0 | 2.16 |
| 39017.0 | 2.157 |
| 39020.0 | 2.152 |
| 39021.0 | 2.152 |
| 39022.0 | 2.156 |
| 39023.0 | 2.142 |
| 39024.0 | 2.147 |
| 39027.0 | 2.167 |
| 39028.0 | 2.177 |
| 39029.0 | 2.177 |
| 39030.0 | 2.177 |
| 39031.0 | 2.174 |
| 39034.0 | 2.181 |
| 39035.0 | 2.181 |
| 39036.0 | 2.189 |
| 39037.0 | 2.19 |
| 39038.0 | 2.179 |
| 39041.0 | 2.185 |
| 39042.0 | 2.185 |
| 39043.0 | 2.185 |
| 39044.0 | 2.181 |
| 39045.0 | 2.168 |
| 39048.0 | 2.143 |
| 39049.0 | 2.142 |
| 39050.0 | 2.159 |
| 39051.0 | 2.146 |
| 39052.0 | 2.126 |
| 39055.0 | 2.137 |
| 39056.0 | 2.154 |
| 39057.0 | 2.152 |
| 39058.0 | 2.157 |
| 39059.0 | 2.158 |
| 39062.0 | 2.17 |
| 39063.0 | 2.172 |
| 39064.0 | 2.184 |
| 39065.0 | 2.193 |
| 39066.0 | 2.201 |
| 39069.0 | 2.197 |
| 39070.0 | 2.186 |
| 39071.0 | 2.193 |
| 39072.0 | 2.191 |
| 39073.0 | 2.177 |
| 39078.0 | 2.199 |
| 39079.0 | 2.197 |
| 39080.0 | 2.193 |
| 39084.0 | 2.215 |
| 39085.0 | 2.217 |
| 39086.0 | 2.213 |
| 39087.0 | 2.197 |
| 39090.0 | 2.194 |
| 39091.0 | 2.197 |
| 39092.0 | 2.183 |
| 39093.0 | 2.209 |
| 39094.0 | 2.212 |
| 39097.0 | 2.217 |
| 39098.0 | 2.21 |
| 39099.0 | 2.203 |
| 39100.0 | 2.199 |
| 39101.0 | 2.212 |
| 39104.0 | 2.201 |
| 39105.0 | 2.2 |
| 39106.0 | 2.217 |
| 39107.0 | 2.213 |
| 39108.0 | 2.203 |
| 39111.0 | 2.21 |
| 39112.0 | 2.219 |
| 39113.0 | 2.214 |
| 39114.0 | 2.225 |
| 39115.0 | 2.231 |
| 39118.0 | 2.23 |
| 39119.0 | 2.233 |
| 39120.0 | 2.239 |
| 39121.0 | 2.23 |
| 39122.0 | 2.238 |
| 39125.0 | 2.226 |
| 39126.0 | 2.234 |
| 39127.0 | 2.244 |
| 39128.0 | 2.241 |
| 39129.0 | 2.237 |
| 39132.0 | 2.244 |
| 39133.0 | 2.238 |
| 39134.0 | 2.232 |
| 39135.0 | 2.235 |
| 39136.0 | 2.237 |
| 39139.0 | 2.246 |
| 39140.0 | 2.206 |
| 39141.0 | 2.182 |
| 39142.0 | 2.162 |
| 39143.0 | 2.155 |
| 39146.0 | 2.143 |
| 39147.0 | 2.154 |
| 39148.0 | 2.159 |
| 39149.0 | 2.18 |
| 39150.0 | 2.183 |
| 39153.0 | 2.175 |
| 39154.0 | 2.157 |
| 39155.0 | 2.116 |
| 39156.0 | 2.145 |
| 39157.0 | 2.145 |
| 39160.0 | 2.171 |
| 39161.0 | 2.179 |
| 39162.0 | 2.179 |
| 39163.0 | 2.211 |
| 39164.0 | 2.218 |
| 39167.0 | 2.201 |
| 39168.0 | 2.205 |
| 39169.0 | 2.196 |
| 39170.0 | 2.214 |
| 39171.0 | 2.215 |
| 39174.0 | 2.217 |
| 39175.0 | 2.237 |
| 39176.0 | 2.242 |
| 39177.0 | 2.245 |
| 39182.0 | 2.256 |
| 39183.0 | 2.253 |
| 39184.0 | 2.248 |
| 39185.0 | 2.261 |
| 39188.0 | 2.281 |
| 39189.0 | 2.283 |
| 39190.0 | 2.275 |
| 39191.0 | 2.268 |
| 39192.0 | 2.294 |
| 39195.0 | 2.288 |
| 39196.0 | 2.278 |
| 39197.0 | 2.29 |
| 39198.0 | 2.293 |
| 39199.0 | 2.283 |
| 39202.0 | 2.286 |
| 39203.0 | 2.286 |
| 39204.0 | 2.293 |
| 39205.0 | 2.297 |
| 39206.0 | 2.303 |
| 39209.0 | 2.302 |
| 39210.0 | 2.292 |
| 39211.0 | 2.296 |
| 39212.0 | 2.286 |
| 39213.0 | 2.296 |
| 39216.0 | 2.293 |
| 39217.0 | 2.302 |
| 39218.0 | 2.296 |
| 39219.0 | 2.298 |
| 39220.0 | 2.314 |
| 39223.0 | 2.31 |
| 39224.0 | 2.311 |
| 39225.0 | 2.321 |
| 39226.0 | 2.305 |
| 39227.0 | 2.309 |
| 39230.0 | 2.313 |
| 39231.0 | 2.313 |
| 39232.0 | 2.311 |
| 39233.0 | 2.325 |
| 39234.0 | 2.339 |
| 39237.0 | 2.333 |
| 39238.0 | 2.325 |
| 39239.0 | 2.3 |
| 39240.0 | 2.282 |
| 39241.0 | 2.28 |
| 39244.0 | 2.293 |
| 39245.0 | 2.283 |
| 39246.0 | 2.289 |
| 39247.0 | 2.316 |
| 39251.0 | 2.33 |
| 39252.0 | 2.329 |
| 39254.0 | 2.317 |
| 39255.0 | 2.314 |
| 39258.0 | 2.311 |
| 39259.0 | 2.299 |
| 39260.0 | 2.292 |
| 39261.0 | 2.307 |
| 39262.0 | 2.317 |
| 39265.0 | 2.311 |
| 39266.0 | 2.325 |
| 39267.0 | 2.328 |
| 39268.0 | 2.318 |
| 39269.0 | 2.328 |
| 39272.0 | 2.33 |
| 39273.0 | 2.312 |
| 39274.0 | 2.304 |
| 39275.0 | 2.326 |
| 39276.0 | 2.334 |
| 39279.0 | 2.339 |
| 39280.0 | 2.333 |
| 39281.0 | 2.312 |
| 39282.0 | 2.328 |
| 39283.0 | 2.303 |
| 39286.0 | 2.315 |
| 39287.0 | 2.292 |
| 39288.0 | 2.275 |
| 39289.0 | 2.239 |
| 39290.0 | 2.236 |
| 39293.0 | 2.234 |
| 39294.0 | 2.26 |
| 39295.0 | 2.234 |
| 39296.0 | 2.251 |
| 39297.0 | 2.231 |
| 39300.0 | 2.222 |
| 39301.0 | 2.247 |
| 39302.0 | 2.276 |
| 39303.0 | 2.247 |
| 39307.0 | 2.24 |
| 39308.0 | 2.22 |
| 39309.0 | 2.215 |
| 39310.0 | 2.173 |
| 39311.0 | 2.206 |
| 39314.0 | 2.212 |
| 39315.0 | 2.212 |
| 39316.0 | 2.23 |
| 39317.0 | 2.23 |
| 39318.0 | 2.234 |
| 39321.0 | 2.235 |
| 39322.0 | 2.211 |
| 39323.0 | 2.219 |
| 39324.0 | 2.237 |
| 39325.0 | 2.253 |
| 39328.0 | 2.254 |
| 39329.0 | 2.263 |
| 39330.0 | 2.233 |
| 39331.0 | 2.24 |
| 39332.0 | 2.208 |
| 39335.0 | 2.199 |
| 39336.0 | 2.22 |
| 39337.0 | 2.225 |
| 39338.0 | 2.238 |
| 39339.0 | 2.228 |
| 39342.0 | 2.216 |
| 39343.0 | 2.243 |
| 39344.0 | 2.285 |
| 39345.0 | 2.277 |
| 39346.0 | 2.278 |
| 39350.0 | 2.265 |
| 39351.0 | 2.276 |
| 39352.0 | 2.285 |
| 39353.0 | 2.282 |
| 39356.0 | 2.291 |
| 39358.0 | 2.295 |
| 39359.0 | 2.295 |
| 39360.0 | 2.306 |
| 39363.0 | 2.3 |
| 39364.0 | 2.304 |
| 39365.0 | 2.302 |
| 39366.0 | 2.312 |
| 39370.0 | 2.3 |
| 39371.0 | 2.295 |
| 39372.0 | 2.302 |
| 39373.0 | 2.295 |
| 39374.0 | 2.292 |
| 39377.0 | 2.274 |
| 39378.0 | 2.281 |
| 39379.0 | 2.274 |
| 39380.0 | 2.292 |
| 39381.0 | 2.301 |
| 39385.0 | 2.309 |
| 39386.0 | 2.317 |
| 39387.0 | 2.293 |
| 39391.0 | 2.286 |
| 39392.0 | 2.291 |
| 39394.0 | 2.276 |
| 39395.0 | 2.254 |
| 39398.0 | 2.256 |
| 39399.0 | 2.259 |
| 39400.0 | 2.268 |
| 39401.0 | 2.256 |
| 39402.0 | 2.249 |
| 39405.0 | 2.23 |
| 39406.0 | 2.247 |
| 39407.0 | 2.22 |
| 39408.0 | 2.224 |
| 39409.0 | 2.244 |
| 39412.0 | 2.234 |
| 39413.0 | 2.229 |
| 39414.0 | 2.262 |
| 39415.0 | 2.271 |
| 39416.0 | 2.287 |
| 39420.0 | 2.268 |
| 39421.0 | 2.291 |
| 39422.0 | 2.293 |
| 39423.0 | 2.303 |
| 39426.0 | 2.31 |
| 39427.0 | 2.304 |
| 39428.0 | 2.311 |
| 39429.0 | 2.279 |
| 39430.0 | 2.283 |
| 39433.0 | 2.259 |
| 39434.0 | 2.258 |
| 39435.0 | 2.255 |
| 39436.0 | 2.26 |
| 39440.0 | 2.284 |
| 39443.0 | 2.29 |
| 39444.0 | 2.29 |
| 39447.0 | 2.288 |
| 39449.0 | 2.268 |
| 39450.0 | 2.266 |
| 39451.0 | 2.245 |
| 39454.0 | 2.249 |
| 39455.0 | 2.253 |
| 39456.0 | 2.241 |
| 39457.0 | 2.234 |
| 39458.0 | 2.23 |
| 39461.0 | 2.234 |
| 39462.0 | 2.201 |
| 39463.0 | 2.189 |
| 39464.0 | 2.174 |
| 39465.0 | 2.149 |
| 39468.0 | 2.039 |
| 39469.0 | 2.059 |
| 39470.0 | 1.99 |
| 39471.0 | 2.08 |
| 39472.0 | 2.068 |
| 39476.0 | 2.08 |
| 39477.0 | 2.073 |
| 39478.0 | 2.074 |
| 39479.0 | 2.102 |
| 39482.0 | 2.102 |
| 39483.0 | 2.045 |
| 39484.0 | 2.061 |
| 39485.0 | 2.038 |
| 39486.0 | 2.039 |
| 39489.0 | 2.03 |
| 39490.0 | 2.078 |
| 39491.0 | 2.078 |
| 39492.0 | 2.076 |
| 39493.0 | 2.046 |
| 39496.0 | 2.075 |
| 39497.0 | 2.079 |
| 39498.0 | 2.061 |
| 39499.0 | 2.068 |
| 39500.0 | 2.053 |
| 39503.0 | 2.076 |
| 39504.0 | 2.097 |
| 39505.0 | 2.098 |
| 39506.0 | 2.071 |
| 39507.0 | 2.048 |
| 39510.0 | 2.029 |
| 39511.0 | 2.003 |
| 39512.0 | 2.032 |
| 39513.0 | 2.006 |
| 39514.0 | 1.989 |
| 39517.0 | 1.977 |
| 39518.0 | 2.001 |
| 39519.0 | 2.018 |
| 39520.0 | 1.999 |
| 39521.0 | 1.985 |
| 39524.0 | 1.93 |
| 39525.0 | 1.982 |
| 39526.0 | 1.97 |
| 39527.0 | 1.96 |
| 39532.0 | 2.012 |
| 39533.0 | 2.003 |
| 39534.0 | 2.019 |
| 39535.0 | 2.015 |
| 39538.0 | 2.01 |
| 39539.0 | 2.059 |
| 39540.0 | 2.076 |
| 39541.0 | 2.067 |
| 39542.0 | 2.075 |
| 39545.0 | 2.087 |
| 39546.0 | 2.081 |
| 39547.0 | 2.068 |
| 39548.0 | 2.061 |
| 39549.0 | 2.038 |
| 39552.0 | 2.027 |
| 39553.0 | 2.035 |
| 39554.0 | 2.057 |
| 39555.0 | 2.048 |
| 39556.0 | 2.08 |
| 39559.0 | 2.065 |
| 39560.0 | 2.052 |
| 39561.0 | 2.063 |
| 39562.0 | 2.062 |
| 39563.0 | 2.075 |
| 39566.0 | 2.082 |
| 39567.0 | 2.074 |
| 39568.0 | 2.086 |
| 39569.0 | 2.086 |
| 39570.0 | 2.106 |
| 39573.0 | 2.104 |
| 39574.0 | 2.094 |
| 39575.0 | 2.104 |
| 39576.0 | 2.098 |
| 39577.0 | 2.077 |
| 39580.0 | 2.081 |
| 39581.0 | 2.083 |
| 39582.0 | 2.098 |
| 39583.0 | 2.097 |
| 39584.0 | 2.1 |
| 39587.0 | 2.108 |
| 39588.0 | 2.085 |
| 39589.0 | 2.074 |
| 39590.0 | 2.074 |
| 39591.0 | 2.048 |
| 39594.0 | 2.048 |
| 39595.0 | 2.043 |
| 39596.0 | 2.055 |
| 39597.0 | 2.058 |
| 39598.0 | 2.068 |
| 39601.0 | 2.046 |
| 39602.0 | 2.053 |
| 39603.0 | 2.038 |
| 39604.0 | 2.032 |
| 39605.0 | 1.997 |
| 39608.0 | 1.998 |
| 39609.0 | 1.989 |
| 39610.0 | 1.962 |
| 39611.0 | 1.975 |
| 39612.0 | 1.984 |
| 39615.0 | 1.972 |
| 39616.0 | 1.981 |
| 39617.0 | 1.961 |
| 39618.0 | 1.953 |
| 39619.0 | 1.927 |
| 39622.0 | 1.928 |
| 39623.0 | 1.918 |
| 39624.0 | 1.942 |
| 39625.0 | 1.902 |
| 39626.0 | 1.891 |
| 39629.0 | 1.896 |
| 39630.0 | 1.87 |
| 39631.0 | 1.868 |
| 39632.0 | 1.887 |
| 39633.0 | 1.862 |
| 39636.0 | 1.887 |
| 39637.0 | 1.868 |
| 39638.0 | 1.892 |
| 39639.0 | 1.866 |
| 39640.0 | 1.828 |
| 39643.0 | 1.836 |
| 39644.0 | 1.803 |
| 39645.0 | 1.817 |
| 39646.0 | 1.854 |
| 39647.0 | 1.883 |
| 39650.0 | 1.888 |
| 39651.0 | 1.885 |
| 39652.0 | 1.911 |
| 39653.0 | 1.897 |
| 39654.0 | 1.895 |
| 39657.0 | 1.879 |
| 39658.0 | 1.884 |
| 39659.0 | 1.902 |
| 39660.0 | 1.903 |
| 39661.0 | 1.88 |
| 39664.0 | 1.868 |
| 39665.0 | 1.908 |
| 39666.0 | 1.92 |
| 39667.0 | 1.915 |
| 39668.0 | 1.92 |
| 39671.0 | 1.935 |
| 39672.0 | 1.932 |
| 39673.0 | 1.897 |
| 39674.0 | 1.898 |
| 39675.0 | 1.902 |
| 39678.0 | 1.902 |
| 39679.0 | 1.864 |
| 39680.0 | 1.871 |
| 39681.0 | 1.851 |
| 39682.0 | 1.879 |
| 39685.0 | 1.865 |
| 39686.0 | 1.872 |
| 39687.0 | 1.873 |
| 39688.0 | 1.899 |
| 39689.0 | 1.902 |
| 39692.0 | 1.901 |
| 39693.0 | 1.923 |
| 39694.0 | 1.903 |
| 39695.0 | 1.862 |
| 39696.0 | 1.822 |
| 39699.0 | 1.866 |
| 39700.0 | 1.856 |
| 39701.0 | 1.848 |
| 39702.0 | 1.839 |
| 39703.0 | 1.864 |
| 39706.0 | 1.807 |
| 39707.0 | 1.778 |
| 39708.0 | 1.745 |
| 39709.0 | 1.736 |
| 39710.0 | 1.853 |
| 39713.0 | 1.821 |
| 39714.0 | 1.801 |
| 39715.0 | 1.792 |
| 39716.0 | 1.832 |
| 39717.0 | 1.809 |
| 39720.0 | 1.74 |
| 39721.0 | 1.754 |
| 39722.0 | 1.768 |
| 39723.0 | 1.739 |
| 39724.0 | 1.789 |
| 39727.0 | 1.671 |
| 39728.0 | 1.676 |
| 39729.0 | 1.581 |
| 39730.0 | 1.545 |
| 39731.0 | 1.427 |
| 39734.0 | 1.577 |
| 39735.0 | 1.614 |
| 39736.0 | 1.517 |
| 39737.0 | 1.428 |
| 39738.0 | 1.491 |
| 39741.0 | 1.537 |
| 39742.0 | 1.529 |
| 39743.0 | 1.448 |
| 39744.0 | 1.445 |
| 39745.0 | 1.373 |
| 39748.0 | 1.348 |
| 39749.0 | 1.403 |
| 39750.0 | 1.481 |
| 39751.0 | 1.489 |
| 39752.0 | 1.525 |
| 39755.0 | 1.535 |
| 39756.0 | 1.613 |
| 39757.0 | 1.589 |
| 39758.0 | 1.497 |
| 39759.0 | 1.531 |
| 39762.0 | 1.543 |
| 39763.0 | 1.463 |
| 39764.0 | 1.414 |
| 39765.0 | 1.432 |
| 39766.0 | 1.447 |
| 39769.0 | 1.392 |
| 39770.0 | 1.408 |
| 39771.0 | 1.349 |
| 39772.0 | 1.305 |
| 39773.0 | 1.266 |
| 39776.0 | 1.402 |
| 39777.0 | 1.405 |
| 39778.0 | 1.398 |
| 39779.0 | 1.43 |
| 39780.0 | 1.432 |
| 39783.0 | 1.345 |
| 39784.0 | 1.386 |
| 39785.0 | 1.395 |
| 39786.0 | 1.395 |
| 39787.0 | 1.322 |
| 39790.0 | 1.443 |
| 39791.0 | 1.461 |
| 39792.0 | 1.47 |
| 39793.0 | 1.464 |
| 39794.0 | 1.425 |
| 39797.0 | 1.418 |
| 39798.0 | 1.444 |
| 39799.0 | 1.44 |
| 39800.0 | 1.445 |
| 39801.0 | 1.44 |
| 39804.0 | 1.412 |
| 39805.0 | 1.403 |
| 39806.0 | 1.4 |
| 39812.0 | 1.444 |
| 39813.0 | 1.442 |
| 39815.0 | 1.494 |
| 39818.0 | 1.503 |
| 39819.0 | 1.517 |
| 39820.0 | 1.495 |
| 39821.0 | 1.482 |
| 39822.0 | 1.465 |
| 39825.0 | 1.445 |
| 39826.0 | 1.42 |
| 39827.0 | 1.351 |
| 39828.0 | 1.326 |
| 39829.0 | 1.341 |
| 39832.0 | 1.322 |
| 39833.0 | 1.289 |
| 39834.0 | 1.281 |
| 39835.0 | 1.262 |
| 39836.0 | 1.254 |
| 39839.0 | 1.306 |
| 39840.0 | 1.304 |
| 39841.0 | 1.367 |
| 39842.0 | 1.333 |
| 39843.0 | 1.312 |
| 39846.0 | 1.287 |
| 39847.0 | 1.317 |
| 39848.0 | 1.351 |
| 39849.0 | 1.348 |
| 39850.0 | 1.379 |
| 39853.0 | 1.383 |
| 39854.0 | 1.332 |
| 39855.0 | 1.332 |
| 39856.0 | 1.298 |
| 39857.0 | 1.307 |
| 39860.0 | 1.284 |
| 39861.0 | 1.235 |
| 39862.0 | 1.234 |
| 39863.0 | 1.231 |
| 39864.0 | 1.159 |
| 39867.0 | 1.145 |
| 39868.0 | 1.134 |
| 39869.0 | 1.125 |
| 39870.0 | 1.166 |
| 39871.0 | 1.133 |
| 39874.0 | 1.064 |
| 39875.0 | 1.05 |
| 39876.0 | 1.109 |
| 39877.0 | 1.04 |
| 39878.0 | 1.012 |
| 39881.0 | 1.007 |
| 39882.0 | 1.091 |
| 39883.0 | 1.101 |
| 39884.0 | 1.123 |
| 39885.0 | 1.129 |
| 39888.0 | 1.175 |
| 39889.0 | 1.159 |
| 39890.0 | 1.164 |
| 39891.0 | 1.179 |
| 39892.0 | 1.187 |
| 39895.0 | 1.236 |
| 39896.0 | 1.24 |
| 39897.0 | 1.254 |
| 39898.0 | 1.26 |
| 39899.0 | 1.234 |
| 39902.0 | 1.158 |
| 39903.0 | 1.201 |
| 39904.0 | 1.219 |
| 39905.0 | 1.299 |
| 39906.0 | 1.287 |
| 39909.0 | 1.275 |
| 39910.0 | 1.265 |
| 39911.0 | 1.28 |
| 39912.0 | 1.319 |
| 39917.0 | 1.339 |
| 39918.0 | 1.329 |
| 39919.0 | 1.353 |
| 39920.0 | 1.378 |
| 39923.0 | 1.32 |
| 39924.0 | 1.317 |
| 39925.0 | 1.343 |
| 39926.0 | 1.327 |
| 39927.0 | 1.365 |
| 39930.0 | 1.363 |
| 39931.0 | 1.34 |
| 39932.0 | 1.374 |
| 39933.0 | 1.399 |
| 39934.0 | 1.399 |
| 39937.0 | 1.425 |
| 39938.0 | 1.418 |
| 39939.0 | 1.436 |
| 39940.0 | 1.417 |
| 39941.0 | 1.451 |
| 39944.0 | 1.434 |
| 39945.0 | 1.428 |
| 39946.0 | 1.388 |
| 39947.0 | 1.386 |
| 39948.0 | 1.392 |
| 39951.0 | 1.427 |
| 39952.0 | 1.449 |
| 39953.0 | 1.465 |
| 39954.0 | 1.428 |
| 39955.0 | 1.434 |
| 39958.0 | 1.438 |
| 39959.0 | 1.454 |
| 39960.0 | 1.461 |
| 39961.0 | 1.445 |
| 39962.0 | 1.444 |
| 39965.0 | 1.494 |
| 39966.0 | 1.492 |
| 39967.0 | 1.463 |
| 39968.0 | 1.465 |
| 39969.0 | 1.474 |
| 39972.0 | 1.454 |
| 39973.0 | 1.461 |
| 39974.0 | 1.473 |
| 39975.0 | 1.485 |
| 39976.0 | 1.478 |
| 39979.0 | 1.432 |
| 39980.0 | 1.429 |
| 39981.0 | 1.404 |
| 39982.0 | 1.422 |
| 39983.0 | 1.434 |
| 39986.0 | 1.389 |
| 39987.0 | 1.385 |
| 39988.0 | 1.425 |
| 39989.0 | 1.415 |
| 39990.0 | 1.408 |
| 39993.0 | 1.436 |
| 39994.0 | 1.415 |
| 39995.0 | 1.443 |
| 39996.0 | 1.395 |
| 39997.0 | 1.4 |
| 40000.0 | 1.38 |
| 40001.0 | 1.365 |
| 40002.0 | 1.347 |
| 40003.0 | 1.361 |
| 40004.0 | 1.341 |
| 40007.0 | 1.38 |
| 40008.0 | 1.396 |
| 40009.0 | 1.444 |
| 40010.0 | 1.449 |
| 40011.0 | 1.455 |
| 40014.0 | 1.473 |
| 40015.0 | 1.484 |
| 40016.0 | 1.489 |
| 40017.0 | 1.521 |
| 40018.0 | 1.52 |
| 40021.0 | 1.53 |
| 40022.0 | 1.514 |
| 40023.0 | 1.529 |
| 40024.0 | 1.559 |
| 40025.0 | 1.55 |
| 40028.0 | 1.57 |
| 40029.0 | 1.568 |
| 40030.0 | 1.553 |
| 40031.0 | 1.563 |
| 40032.0 | 1.587 |
| 40035.0 | 1.58 |
| 40036.0 | 1.557 |
| 40037.0 | 1.577 |
| 40038.0 | 1.587 |
| 40039.0 | 1.567 |
| 40042.0 | 1.531 |
| 40043.0 | 1.546 |
| 40044.0 | 1.542 |
| 40045.0 | 1.564 |
| 40046.0 | 1.608 |
| 40049.0 | 1.625 |
| 40050.0 | 1.637 |
| 40051.0 | 1.63 |
| 40052.0 | 1.625 |
| 40053.0 | 1.638 |
| 40056.0 | 1.623 |
| 40057.0 | 1.592 |
| 40058.0 | 1.586 |
| 40059.0 | 1.583 |
| 40060.0 | 1.607 |
| 40063.0 | 1.628 |
| 40064.0 | 1.629 |
| 40065.0 | 1.647 |
| 40066.0 | 1.645 |
| 40067.0 | 1.652 |
| 40070.0 | 1.651 |
| 40071.0 | 1.658 |
| 40072.0 | 1.678 |
| 40073.0 | 1.684 |
| 40074.0 | 1.68 |
| 40077.0 | 1.673 |
| 40078.0 | 1.678 |
| 40079.0 | 1.68 |
| 40080.0 | 1.656 |
| 40081.0 | 1.652 |
| 40084.0 | 1.686 |
| 40085.0 | 1.683 |
| 40086.0 | 1.673 |
| 40087.0 | 1.641 |
| 40088.0 | 1.616 |
| 40091.0 | 1.631 |
| 40092.0 | 1.67 |
| 40093.0 | 1.663 |
| 40094.0 | 1.681 |
| 40095.0 | 1.678 |
| 40098.0 | 1.694 |
| 40099.0 | 1.676 |
| 40100.0 | 1.712 |
| 40101.0 | 1.706 |
| 40102.0 | 1.684 |
| 40105.0 | 1.71 |
| 40106.0 | 1.699 |
| 40107.0 | 1.705 |
| 40108.0 | 1.688 |
| 40109.0 | 1.68 |
| 40112.0 | 1.654 |
| 40113.0 | 1.654 |
| 40114.0 | 1.625 |
| 40115.0 | 1.649 |
| 40116.0 | 1.607 |
| 40119.0 | 1.617 |
| 40120.0 | 1.59 |
| 40121.0 | 1.617 |
| 40122.0 | 1.633 |
| 40123.0 | 1.633 |
| 40126.0 | 1.667 |
| 40127.0 | 1.665 |
| 40128.0 | 1.677 |
| 40129.0 | 1.675 |
| 40130.0 | 1.678 |
| 40133.0 | 1.7 |
| 40134.0 | 1.69 |
| 40135.0 | 1.691 |
| 40136.0 | 1.667 |
| 40137.0 | 1.653 |
| 40140.0 | 1.686 |
| 40141.0 | 1.676 |
| 40142.0 | 1.685 |
| 40143.0 | 1.636 |
| 40144.0 | 1.652 |
| 40147.0 | 1.635 |
| 40148.0 | 1.673 |
| 40149.0 | 1.676 |
| 40150.0 | 1.675 |
| 40151.0 | 1.692 |
| 40154.0 | 1.685 |
| 40155.0 | 1.661 |
| 40156.0 | 1.645 |
| 40157.0 | 1.662 |
| 40158.0 | 1.668 |
| 40161.0 | 1.679 |
| 40162.0 | 1.681 |
| 40163.0 | 1.7 |
| 40164.0 | 1.683 |
| 40165.0 | 1.672 |
| 40168.0 | 1.7 |
| 40169.0 | 1.709 |
| 40170.0 | 1.715 |
| 40171.0 | 1.715 |
| 40175.0 | 1.727 |
| 40176.0 | 1.732 |
| 40177.0 | 1.719 |
| 40178.0 | 1.719 |
| 40182.0 | 1.744 |
| 40183.0 | 1.742 |
| 40184.0 | 1.74 |
| 40185.0 | 1.739 |
| 40186.0 | 1.744 |
| 40189.0 | 1.741 |
| 40190.0 | 1.724 |
| 40191.0 | 1.725 |
| 40192.0 | 1.731 |
| 40193.0 | 1.707 |
| 40196.0 | 1.715 |
| 40197.0 | 1.728 |
| 40198.0 | 1.694 |
| 40199.0 | 1.668 |
| 40200.0 | 1.655 |
| 40203.0 | 1.64 |
| 40204.0 | 1.65 |
| 40205.0 | 1.63 |
| 40206.0 | 1.603 |
| 40207.0 | 1.624 |
| 40210.0 | 1.633 |
| 40211.0 | 1.651 |
| 40212.0 | 1.638 |
| 40213.0 | 1.588 |
| 40214.0 | 1.547 |
| 40217.0 | 1.564 |
| 40218.0 | 1.567 |
| 40219.0 | 1.584 |
| 40220.0 | 1.573 |
| 40221.0 | 1.57 |
| 40224.0 | 1.575 |
| 40225.0 | 1.595 |
| 40226.0 | 1.617 |
| 40227.0 | 1.625 |
| 40228.0 | 1.633 |
| 40231.0 | 1.625 |
| 40232.0 | 1.6 |
| 40233.0 | 1.602 |
| 40234.0 | 1.575 |
| 40235.0 | 1.599 |
| 40238.0 | 1.622 |
| 40239.0 | 1.628 |
| 40240.0 | 1.648 |
| 40241.0 | 1.644 |
| 40242.0 | 1.675 |
| 40245.0 | 1.676 |
| 40246.0 | 1.677 |
| 40247.0 | 1.691 |
| 40248.0 | 1.685 |
| 40249.0 | 1.686 |
| 40252.0 | 1.672 |
| 40253.0 | 1.69 |
| 40254.0 | 1.702 |
| 40255.0 | 1.694 |
| 40256.0 | 1.686 |
| 40259.0 | 1.682 |
| 40260.0 | 1.692 |
| 40261.0 | 1.687 |
| 40262.0 | 1.706 |
| 40263.0 | 1.707 |
| 40266.0 | 1.71 |
| 40267.0 | 1.706 |
| 40268.0 | 1.702 |
| 40269.0 | 1.725 |
| 40274.0 | 1.731 |
| 40275.0 | 1.723 |
| 40276.0 | 1.708 |
| 40277.0 | 1.733 |
| 40280.0 | 1.737 |
| 40281.0 | 1.73 |
| 40282.0 | 1.74 |
| 40283.0 | 1.742 |
| 40284.0 | 1.711 |
| 40287.0 | 1.707 |
| 40288.0 | 1.728 |
| 40289.0 | 1.71 |
| 40290.0 | 1.686 |
| 40291.0 | 1.696 |
| 40294.0 | 1.71 |
| 40295.0 | 1.656 |
| 40296.0 | 1.63 |
| 40297.0 | 1.651 |
| 40298.0 | 1.645 |
| 40301.0 | 1.645 |
| 40302.0 | 1.588 |
| 40303.0 | 1.573 |
| 40304.0 | 1.536 |
| 40305.0 | 1.473 |
| 40308.0 | 1.615 |
| 40309.0 | 1.6 |
| 40310.0 | 1.618 |
| 40311.0 | 1.617 |
| 40312.0 | 1.548 |
| 40315.0 | 1.549 |
| 40316.0 | 1.583 |
| 40317.0 | 1.54 |
| 40318.0 | 1.512 |
| 40319.0 | 1.515 |
| 40322.0 | 1.506 |
| 40323.0 | 1.466 |
| 40324.0 | 1.49 |
| 40325.0 | 1.54 |
| 40326.0 | 1.537 |
| 40329.0 | 1.535 |
| 40330.0 | 1.533 |
| 40331.0 | 1.53 |
| 40332.0 | 1.548 |
| 40333.0 | 1.503 |
| 40336.0 | 1.49 |
| 40337.0 | 1.479 |
| 40338.0 | 1.505 |
| 40339.0 | 1.534 |
| 40340.0 | 1.55 |
| 40343.0 | 1.575 |
| 40344.0 | 1.592 |
| 40345.0 | 1.594 |
| 40346.0 | 1.599 |
| 40347.0 | 1.603 |
| 40350.0 | 1.62 |
| 40351.0 | 1.608 |
| 40352.0 | 1.586 |
| 40353.0 | 1.554 |
| 40354.0 | 1.545 |
| 40357.0 | 1.567 |
| 40358.0 | 1.505 |
| 40359.0 | 1.514 |
| 40360.0 | 1.483 |
| 40361.0 | 1.485 |
| 40364.0 | 1.477 |
| 40365.0 | 1.517 |
| 40366.0 | 1.548 |
| 40367.0 | 1.566 |
| 40368.0 | 1.574 |
| 40371.0 | 1.576 |
| 40372.0 | 1.604 |
| 40373.0 | 1.604 |
| 40374.0 | 1.585 |
| 40375.0 | 1.554 |
| 40378.0 | 1.548 |
| 40379.0 | 1.544 |
| 40380.0 | 1.551 |
| 40381.0 | 1.591 |
| 40382.0 | 1.594 |
| 40385.0 | 1.607 |
| 40386.0 | 1.62 |
| 40387.0 | 1.619 |
| 40388.0 | 1.612 |
| 40389.0 | 1.606 |
| 40392.0 | 1.647 |
| 40393.0 | 1.646 |
| 40394.0 | 1.649 |
| 40395.0 | 1.646 |
| 40396.0 | 1.625 |
| 40399.0 | 1.65 |
| 40400.0 | 1.636 |
| 40401.0 | 1.597 |
| 40402.0 | 1.595 |
| 40403.0 | 1.588 |
| 40406.0 | 1.583 |
| 40407.0 | 1.604 |
| 40408.0 | 1.599 |
| 40409.0 | 1.57 |
| 40410.0 | 1.553 |
| 40413.0 | 1.563 |
| 40414.0 | 1.537 |
| 40415.0 | 1.522 |
| 40416.0 | 1.533 |
| 40417.0 | 1.546 |
| 40420.0 | 1.538 |
| 40421.0 | 1.542 |
| 40422.0 | 1.592 |
| 40423.0 | 1.592 |
| 40424.0 | 1.608 |
| 40427.0 | 1.612 |
| 40428.0 | 1.598 |
| 40429.0 | 1.612 |
| 40430.0 | 1.627 |
| 40431.0 | 1.626 |
| 40434.0 | 1.639 |
| 40435.0 | 1.639 |
| 40436.0 | 1.633 |
| 40437.0 | 1.628 |
| 40438.0 | 1.614 |
| 40441.0 | 1.637 |
| 40442.0 | 1.633 |
| 40443.0 | 1.612 |
| 40444.0 | 1.604 |
| 40445.0 | 1.632 |
| 40448.0 | 1.624 |
| 40449.0 | 1.623 |
| 40450.0 | 1.612 |
| 40451.0 | 1.609 |
| 40452.0 | 1.601 |
| 40455.0 | 1.584 |
| 40456.0 | 1.615 |
| 40457.0 | 1.626 |
| 40458.0 | 1.629 |
| 40459.0 | 1.629 |
| 40462.0 | 1.631 |
| 40463.0 | 1.624 |
| 40464.0 | 1.657 |
| 40465.0 | 1.655 |
| 40466.0 | 1.657 |
| 40469.0 | 1.662 |
| 40470.0 | 1.655 |
| 40471.0 | 1.662 |
| 40472.0 | 1.678 |
| 40473.0 | 1.674 |
| 40476.0 | 1.672 |
| 40477.0 | 1.665 |
| 40478.0 | 1.651 |
| 40479.0 | 1.659 |
| 40480.0 | 1.659 |
| 40483.0 | 1.655 |
| 40484.0 | 1.667 |
| 40485.0 | 1.652 |
| 40486.0 | 1.679 |
| 40487.0 | 1.675 |
| 40490.0 | 1.671 |
| 40491.0 | 1.682 |
| 40492.0 | 1.66 |
| 40493.0 | 1.652 |
| 40494.0 | 1.648 |
| 40497.0 | 1.661 |
| 40498.0 | 1.627 |
| 40499.0 | 1.638 |
| 40500.0 | 1.664 |
| 40501.0 | 1.659 |
| 40504.0 | 1.642 |
| 40505.0 | 1.605 |
| 40506.0 | 1.614 |
| 40507.0 | 1.618 |
| 40508.0 | 1.603 |
| 40511.0 | 1.568 |
| 40512.0 | 1.557 |
| 40513.0 | 1.595 |
| 40514.0 | 1.626 |
| 40515.0 | 1.627 |
| 40518.0 | 1.621 |
| 40519.0 | 1.638 |
| 40520.0 | 1.646 |
| 40521.0 | 1.657 |
| 40522.0 | 1.656 |
| 40525.0 | 1.664 |
| 40526.0 | 1.668 |
| 40527.0 | 1.652 |
| 40528.0 | 1.66 |
| 40529.0 | 1.647 |
| 40532.0 | 1.656 |
| 40533.0 | 1.675 |
| 40534.0 | 1.672 |
| 40535.0 | 1.669 |
| 40536.0 | 1.668 |
| 40539.0 | 1.65 |
| 40540.0 | 1.649 |
| 40541.0 | 1.657 |
| 40542.0 | 1.64 |
| 40543.0 | 1.632 |
| 40546.0 | 1.656 |
| 40547.0 | 1.659 |
| 40548.0 | 1.653 |
| 40549.0 | 1.655 |
| 40550.0 | 1.64 |
| 40553.0 | 1.616 |
| 40554.0 | 1.634 |
| 40555.0 | 1.676 |
| 40556.0 | 1.694 |
| 40557.0 | 1.697 |
| 40560.0 | 1.692 |
| 40561.0 | 1.709 |
| 40562.0 | 1.699 |
| 40563.0 | 1.7 |
| 40564.0 | 1.721 |
| 40567.0 | 1.726 |
| 40568.0 | 1.715 |
| 40569.0 | 1.72 |
| 40570.0 | 1.731 |
| 40571.0 | 1.713 |
| 40574.0 | 1.713 |
| 40575.0 | 1.739 |
| 40576.0 | 1.742 |
| 40577.0 | 1.733 |
| 40578.0 | 1.737 |
| 40581.0 | 1.751 |
| 40582.0 | 1.756 |
| 40583.0 | 1.751 |
| 40584.0 | 1.748 |
| 40585.0 | 1.747 |
| 40588.0 | 1.744 |
| 40589.0 | 1.75 |
| 40590.0 | 1.765 |
| 40591.0 | 1.766 |
| 40592.0 | 1.768 |
| 40595.0 | 1.742 |
| 40596.0 | 1.728 |
| 40597.0 | 1.714 |
| 40598.0 | 1.711 |
| 40599.0 | 1.728 |
| 40602.0 | 1.742 |
| 40603.0 | 1.728 |
| 40604.0 | 1.716 |
| 40605.0 | 1.721 |
| 40606.0 | 1.711 |
| 40609.0 | 1.702 |
| 40610.0 | 1.709 |
| 40611.0 | 1.704 |
| 40612.0 | 1.692 |
| 40613.0 | 1.679 |
| 40616.0 | 1.663 |
| 40617.0 | 1.628 |
| 40618.0 | 1.595 |
| 40619.0 | 1.629 |
| 40620.0 | 1.632 |
| 40623.0 | 1.667 |
| 40624.0 | 1.664 |
| 40625.0 | 1.67 |
| 40626.0 | 1.692 |
| 40627.0 | 1.692 |
| 40630.0 | 1.694 |
| 40631.0 | 1.692 |
| 40632.0 | 1.705 |
| 40633.0 | 1.692 |
| 40634.0 | 1.718 |
| 40637.0 | 1.714 |
| 40638.0 | 1.712 |
| 40639.0 | 1.722 |
| 40640.0 | 1.718 |
| 40641.0 | 1.728 |
| 40644.0 | 1.723 |
| 40645.0 | 1.703 |
| 40646.0 | 1.711 |
| 40647.0 | 1.696 |
| 40648.0 | 1.696 |
| 40651.0 | 1.661 |
| 40652.0 | 1.665 |
| 40653.0 | 1.697 |
| 40654.0 | 1.705 |
| 40659.0 | 1.714 |
| 40660.0 | 1.725 |
| 40661.0 | 1.738 |
| 40662.0 | 1.741 |
| 40665.0 | 1.74 |
| 40666.0 | 1.736 |
| 40667.0 | 1.712 |
| 40668.0 | 1.7 |
| 40669.0 | 1.713 |
| 40672.0 | 1.688 |
| 40673.0 | 1.706 |
| 40674.0 | 1.708 |
| 40675.0 | 1.695 |
| 40676.0 | 1.684 |
| 40679.0 | 1.677 |
| 40680.0 | 1.661 |
| 40681.0 | 1.67 |
| 40682.0 | 1.682 |
| 40683.0 | 1.664 |
| 40686.0 | 1.633 |
| 40687.0 | 1.637 |
| 40688.0 | 1.645 |
| 40689.0 | 1.636 |
| 40690.0 | 1.646 |
| 40693.0 | 1.643 |
| 40694.0 | 1.668 |
| 40695.0 | 1.65 |
| 40696.0 | 1.627 |
| 40697.0 | 1.63 |
| 40700.0 | 1.618 |
| 40701.0 | 1.623 |
| 40702.0 | 1.611 |
| 40703.0 | 1.625 |
| 40704.0 | 1.601 |
| 40707.0 | 1.602 |
| 40708.0 | 1.626 |
| 40709.0 | 1.6 |
| 40710.0 | 1.6 |
| 40711.0 | 1.621 |
| 40714.0 | 1.609 |
| 40715.0 | 1.637 |
| 40716.0 | 1.634 |
| 40717.0 | 1.6 |
| 40718.0 | 1.592 |
| 40721.0 | 1.596 |
| 40722.0 | 1.61 |
| 40723.0 | 1.637 |
| 40724.0 | 1.661 |
| 40725.0 | 1.675 |
| 40728.0 | 1.672 |
| 40729.0 | 1.662 |
| 40730.0 | 1.653 |
| 40731.0 | 1.659 |
| 40732.0 | 1.631 |
| 40735.0 | 1.589 |
| 40736.0 | 1.58 |
| 40737.0 | 1.592 |
| 40738.0 | 1.581 |
| 40739.0 | 1.57 |
| 40742.0 | 1.542 |
| 40743.0 | 1.561 |
| 40744.0 | 1.587 |
| 40745.0 | 1.617 |
| 40746.0 | 1.622 |
| 40749.0 | 1.606 |
| 40750.0 | 1.605 |
| 40751.0 | 1.58 |
| 40752.0 | 1.58 |
| 40753.0 | 1.568 |
| 40756.0 | 1.526 |
| 40757.0 | 1.498 |
| 40758.0 | 1.471 |
| 40759.0 | 1.421 |
| 40760.0 | 1.399 |
| 40763.0 | 1.344 |
| 40764.0 | 1.349 |
| 40765.0 | 1.258 |
| 40766.0 | 1.298 |
| 40767.0 | 1.357 |
| 40770.0 | 1.368 |
| 40771.0 | 1.367 |
| 40772.0 | 1.372 |
| 40773.0 | 1.293 |
| 40774.0 | 1.261 |
| 40777.0 | 1.277 |
| 40778.0 | 1.288 |
| 40779.0 | 1.313 |
| 40780.0 | 1.299 |
| 40781.0 | 1.282 |
| 40784.0 | 1.314 |
| 40785.0 | 1.314 |
| 40786.0 | 1.354 |
| 40787.0 | 1.356 |
| 40788.0 | 1.302 |
| 40791.0 | 1.226 |
| 40792.0 | 1.207 |
| 40793.0 | 1.256 |
| 40794.0 | 1.264 |
| 40795.0 | 1.203 |
| 40798.0 | 1.147 |
| 40799.0 | 1.177 |
| 40800.0 | 1.21 |
| 40801.0 | 1.259 |
| 40802.0 | 1.261 |
| 40805.0 | 1.218 |
| 40806.0 | 1.249 |
| 40807.0 | 1.22 |
| 40808.0 | 1.148 |
| 40809.0 | 1.169 |
| 40812.0 | 1.21 |
| 40813.0 | 1.284 |
| 40814.0 | 1.273 |
| 40815.0 | 1.296 |
| 40816.0 | 1.275 |
| 40819.0 | 1.247 |
| 40820.0 | 1.215 |
| 40821.0 | 1.275 |
| 40822.0 | 1.32 |
| 40823.0 | 1.333 |
| 40826.0 | 1.365 |
| 40827.0 | 1.362 |
| 40828.0 | 1.397 |
| 40829.0 | 1.373 |
| 40830.0 | 1.387 |
| 40833.0 | 1.362 |
| 40834.0 | 1.357 |
| 40835.0 | 1.371 |
| 40836.0 | 1.335 |
| 40837.0 | 1.376 |
| 40840.0 | 1.395 |
| 40841.0 | 1.38 |
| 40842.0 | 1.374 |
| 40843.0 | 1.459 |
| 40844.0 | 1.451 |
| 40847.0 | 1.405 |
| 40848.0 | 1.327 |
| 40849.0 | 1.347 |
| 40850.0 | 1.382 |
| 40851.0 | 1.347 |
| 40854.0 | 1.337 |
| 40855.0 | 1.354 |
| 40856.0 | 1.32 |
| 40857.0 | 1.324 |
| 40858.0 | 1.368 |
| 40861.0 | 1.345 |
| 40862.0 | 1.323 |
| 40863.0 | 1.332 |
| 40864.0 | 1.316 |
| 40865.0 | 1.312 |
| 40868.0 | 1.262 |
| 40869.0 | 1.246 |
| 40870.0 | 1.219 |
| 40871.0 | 1.214 |
| 40872.0 | 1.229 |
| 40875.0 | 1.302 |
| 40876.0 | 1.31 |
| 40877.0 | 1.371 |
| 40878.0 | 1.361 |
| 40879.0 | 1.379 |
| 40882.0 | 1.395 |
| 40883.0 | 1.387 |
| 40884.0 | 1.38 |
| 40885.0 | 1.345 |
| 40886.0 | 1.379 |
| 40889.0 | 1.333 |
| 40890.0 | 1.328 |
| 40891.0 | 1.292 |
| 40892.0 | 1.304 |
| 40893.0 | 1.29 |
| 40896.0 | 1.29 |
| 40897.0 | 1.329 |
| 40898.0 | 1.317 |
| 40899.0 | 1.335 |
| 40900.0 | 1.346 |
| 40904.0 | 1.346 |
| 40905.0 | 1.324 |
| 40906.0 | 1.347 |
| 40907.0 | 1.363 |
| 40910.0 | 1.396 |
| 40911.0 | 1.408 |
| 40912.0 | 1.383 |
| 40913.0 | 1.362 |
| 40914.0 | 1.351 |
| 40917.0 | 1.344 |
| 40918.0 | 1.382 |
| 40919.0 | 1.377 |
| 40920.0 | 1.381 |
| 40921.0 | 1.376 |
| 40924.0 | 1.39 |
| 40925.0 | 1.412 |
| 40926.0 | 1.408 |
| 40927.0 | 1.435 |
| 40928.0 | 1.43 |
| 40931.0 | 1.438 |
| 40932.0 | 1.433 |
| 40933.0 | 1.426 |
| 40934.0 | 1.45 |
| 40935.0 | 1.436 |
| 40938.0 | 1.416 |
| 40939.0 | 1.424 |
| 40940.0 | 1.456 |
| 40941.0 | 1.46 |
| 40942.0 | 1.481 |
| 40945.0 | 1.477 |
| 40946.0 | 1.481 |
| 40947.0 | 1.48 |
| 40948.0 | 1.485 |
| 40949.0 | 1.461 |
| 40952.0 | 1.468 |
| 40953.0 | 1.466 |
| 40954.0 | 1.469 |
| 40955.0 | 1.466 |
| 40956.0 | 1.484 |
| 40959.0 | 1.501 |
| 40960.0 | 1.496 |
| 40961.0 | 1.484 |
| 40962.0 | 1.477 |
| 40963.0 | 1.486 |
| 40966.0 | 1.48 |
| 40967.0 | 1.484 |
| 40968.0 | 1.48 |
| 40969.0 | 1.5 |
| 40970.0 | 1.499 |
| 40973.0 | 1.49 |
| 40974.0 | 1.44 |
| 40975.0 | 1.45 |
| 40976.0 | 1.481 |
| 40977.0 | 1.482 |
| 40980.0 | 1.481 |
| 40981.0 | 1.505 |
| 40982.0 | 1.515 |
| 40983.0 | 1.526 |
| 40984.0 | 1.534 |
| 40987.0 | 1.534 |
| 40988.0 | 1.516 |
| 40989.0 | 1.511 |
| 40990.0 | 1.49 |
| 40991.0 | 1.487 |
| 40994.0 | 1.495 |
| 40995.0 | 1.487 |
| 40996.0 | 1.471 |
| 40997.0 | 1.445 |
| 40998.0 | 1.459 |
| 41001.0 | 1.473 |
| 41002.0 | 1.449 |
| 41003.0 | 1.413 |
| 41004.0 | 1.409 |
| 41009.0 | 1.366 |
| 41010.0 | 1.378 |
| 41011.0 | 1.385 |
| 41012.0 | 1.347 |
| 41015.0 | 1.353 |
| 41016.0 | 1.394 |
| 41017.0 | 1.37 |
| 41018.0 | 1.343 |
| 41019.0 | 1.359 |
| 41022.0 | 1.317 |
| 41023.0 | 1.342 |
| 41024.0 | 1.367 |
| 41025.0 | 1.366 |
| 41026.0 | 1.38 |
| 41029.0 | 1.356 |
| 41030.0 | 1.357 |
| 41031.0 | 1.346 |
| 41032.0 | 1.344 |
| 41033.0 | 1.32 |
| 41036.0 | 1.342 |
| 41037.0 | 1.312 |
| 41038.0 | 1.305 |
| 41039.0 | 1.319 |
| 41040.0 | 1.324 |
| 41043.0 | 1.289 |
| 41044.0 | 1.274 |
| 41045.0 | 1.272 |
| 41046.0 | 1.253 |
| 41047.0 | 1.251 |
| 41050.0 | 1.255 |
| 41051.0 | 1.283 |
| 41052.0 | 1.244 |
| 41053.0 | 1.259 |
| 41054.0 | 1.263 |
| 41057.0 | 1.254 |
| 41058.0 | 1.262 |
| 41059.0 | 1.232 |
| 41060.0 | 1.234 |
| 41061.0 | 1.199 |
| 41064.0 | 1.207 |
| 41065.0 | 1.212 |
| 41066.0 | 1.247 |
| 41067.0 | 1.25 |
| 41068.0 | 1.251 |
| 41071.0 | 1.247 |
| 41072.0 | 1.251 |
| 41073.0 | 1.251 |
| 41074.0 | 1.254 |
| 41075.0 | 1.276 |
| 41078.0 | 1.259 |
| 41079.0 | 1.287 |
| 41080.0 | 1.293 |
| 41081.0 | 1.288 |
| 41082.0 | 1.28 |
| 41085.0 | 1.242 |
| 41086.0 | 1.24 |
| 41087.0 | 1.265 |
| 41088.0 | 1.26 |
| 41089.0 | 1.33 |
| 41092.0 | 1.347 |
| 41093.0 | 1.365 |
| 41094.0 | 1.36 |
| 41095.0 | 1.343 |
| 41096.0 | 1.311 |
| 41099.0 | 1.306 |
| 41100.0 | 1.315 |
| 41101.0 | 1.318 |
| 41102.0 | 1.306 |
| 41103.0 | 1.326 |
| 41106.0 | 1.322 |
| 41107.0 | 1.321 |
| 41108.0 | 1.343 |
| 41109.0 | 1.354 |
| 41110.0 | 1.312 |
| 41113.0 | 1.275 |
| 41114.0 | 1.256 |
| 41115.0 | 1.261 |
| 41116.0 | 1.321 |
| 41117.0 | 1.353 |
| 41120.0 | 1.377 |
| 41121.0 | 1.368 |
| 41122.0 | 1.373 |
| 41123.0 | 1.329 |
| 41124.0 | 1.397 |
| 41127.0 | 1.413 |
| 41128.0 | 1.438 |
| 41129.0 | 1.433 |
| 41130.0 | 1.436 |
| 41131.0 | 1.428 |
| 41134.0 | 1.423 |
| 41135.0 | 1.433 |
| 41136.0 | 1.432 |
| 41137.0 | 1.447 |
| 41138.0 | 1.456 |
| 41141.0 | 1.453 |
| 41142.0 | 1.467 |
| 41143.0 | 1.445 |
| 41144.0 | 1.431 |
| 41145.0 | 1.434 |
| 41148.0 | 1.45 |
| 41149.0 | 1.439 |
| 41150.0 | 1.434 |
| 41151.0 | 1.416 |
| 41152.0 | 1.438 |
| 41155.0 | 1.451 |
| 41156.0 | 1.436 |
| 41157.0 | 1.439 |
| 41158.0 | 1.487 |
| 41159.0 | 1.495 |
| 41162.0 | 1.489 |
| 41163.0 | 1.506 |
| 41164.0 | 1.51 |
| 41165.0 | 1.497 |
| 41166.0 | 1.526 |
| 41169.0 | 1.52 |
| 41170.0 | 1.503 |
| 41171.0 | 1.511 |
| 41172.0 | 1.503 |
| 41173.0 | 1.516 |
| 41176.0 | 1.506 |
| 41177.0 | 1.512 |
| 41178.0 | 1.472 |
| 41179.0 | 1.476 |
| 41180.0 | 1.446 |
| 41183.0 | 1.472 |
| 41184.0 | 1.469 |
| 41185.0 | 1.468 |
| 41186.0 | 1.464 |
| 41187.0 | 1.491 |
| 41190.0 | 1.47 |
| 41191.0 | 1.457 |
| 41192.0 | 1.447 |
| 41193.0 | 1.465 |
| 41194.0 | 1.455 |
| 41197.0 | 1.464 |
| 41198.0 | 1.5 |
| 41199.0 | 1.512 |
| 41200.0 | 1.515 |
| 41201.0 | 1.497 |
| 41204.0 | 1.49 |
| 41205.0 | 1.46 |
| 41206.0 | 1.467 |
| 41207.0 | 1.463 |
| 41208.0 | 1.47 |
| 41211.0 | 1.46 |
| 41212.0 | 1.482 |
| 41213.0 | 1.475 |
| 41214.0 | 1.492 |
| 41215.0 | 1.5 |
| 41218.0 | 1.483 |
| 41219.0 | 1.493 |
| 41220.0 | 1.461 |
| 41221.0 | 1.461 |
| 41222.0 | 1.461 |
| 41225.0 | 1.457 |
| 41226.0 | 1.469 |
| 41227.0 | 1.457 |
| 41228.0 | 1.45 |
| 41229.0 | 1.43 |
| 41232.0 | 1.47 |
| 41233.0 | 1.478 |
| 41234.0 | 1.484 |
| 41235.0 | 1.493 |
| 41236.0 | 1.505 |
| 41239.0 | 1.497 |
| 41240.0 | 1.497 |
| 41241.0 | 1.499 |
| 41242.0 | 1.519 |
| 41243.0 | 1.515 |
| 41246.0 | 1.519 |
| 41247.0 | 1.524 |
| 41248.0 | 1.525 |
| 41249.0 | 1.531 |
| 41250.0 | 1.53 |
| 41253.0 | 1.527 |
| 41254.0 | 1.542 |
| 41255.0 | 1.546 |
| 41256.0 | 1.544 |
| 41257.0 | 1.546 |
| 41260.0 | 1.545 |
| 41261.0 | 1.553 |
| 41262.0 | 1.559 |
| 41263.0 | 1.561 |
| 41264.0 | 1.557 |
| 41267.0 | 1.556 |
| 41268.0 | 1.556 |
| 41269.0 | 1.556 |
| 41270.0 | 1.562 |
| 41271.0 | 1.544 |
| 41274.0 | 1.549 |
| 41276.0 | 1.59 |
| 41277.0 | 1.584 |
| 41278.0 | 1.589 |
| 41281.0 | 1.581 |
| 41282.0 | 1.579 |
| 41283.0 | 1.587 |
| 41284.0 | 1.588 |
| 41285.0 | 1.593 |
| 41288.0 | 1.592 |
| 41289.0 | 1.584 |
| 41290.0 | 1.585 |
| 41291.0 | 1.594 |
| 41292.0 | 1.589 |
| 41295.0 | 1.598 |
| 41296.0 | 1.593 |
| 41297.0 | 1.588 |
| 41298.0 | 1.596 |
| 41299.0 | 1.607 |
| 41302.0 | 1.607 |
| 41303.0 | 1.61 |
| 41304.0 | 1.601 |
| 41305.0 | 1.585 |
| 41306.0 | 1.589 |
| 41309.0 | 1.543 |
| 41310.0 | 1.557 |
| 41311.0 | 1.539 |
| 41312.0 | 1.528 |
| 41313.0 | 1.546 |
| 41316.0 | 1.542 |
| 41317.0 | 1.556 |
| 41318.0 | 1.56 |
| 41319.0 | 1.549 |
| 41320.0 | 1.538 |
| 41323.0 | 1.538 |
| 41324.0 | 1.563 |
| 41325.0 | 1.551 |
| 41326.0 | 1.518 |
| 41327.0 | 1.546 |
| 41330.0 | 1.558 |
| 41331.0 | 1.513 |
| 41332.0 | 1.536 |
| 41333.0 | 1.548 |
| 41334.0 | 1.538 |
| 41337.0 | 1.54 |
| 41338.0 | 1.575 |
| 41339.0 | 1.573 |
| 41340.0 | 1.579 |
| 41341.0 | 1.599 |
| 41344.0 | 1.594 |
| 41345.0 | 1.59 |
| 41346.0 | 1.586 |
| 41347.0 | 1.607 |
| 41348.0 | 1.597 |
| 41351.0 | 1.587 |
| 41352.0 | 1.569 |
| 41353.0 | 1.588 |
| 41354.0 | 1.575 |
| 41355.0 | 1.574 |
| 41358.0 | 1.556 |
| 41359.0 | 1.552 |
| 41360.0 | 1.536 |
| 41361.0 | 1.542 |
| 41366.0 | 1.573 |
| 41367.0 | 1.551 |
| 41368.0 | 1.541 |
| 41369.0 | 1.521 |
| 41372.0 | 1.523 |
| 41373.0 | 1.526 |
| 41374.0 | 1.563 |
| 41375.0 | 1.57 |
| 41376.0 | 1.548 |
| 41379.0 | 1.543 |
| 41380.0 | 1.534 |
| 41381.0 | 1.503 |
| 41382.0 | 1.504 |
| 41383.0 | 1.515 |
| 41386.0 | 1.52 |
| 41387.0 | 1.564 |
| 41388.0 | 1.585 |
| 41389.0 | 1.586 |
| 41390.0 | 1.575 |
| 41393.0 | 1.593 |
| 41394.0 | 1.59 |
| 41395.0 | 1.59 |
| 41396.0 | 1.594 |
| 41397.0 | 1.617 |
| 41400.0 | 1.61 |
| 41401.0 | 1.62 |
| 41402.0 | 1.628 |
| 41403.0 | 1.622 |
| 41404.0 | 1.628 |
| 41407.0 | 1.624 |
| 41408.0 | 1.634 |
| 41409.0 | 1.641 |
| 41410.0 | 1.64 |
| 41411.0 | 1.645 |
| 41414.0 | 1.649 |
| 41415.0 | 1.647 |
| 41416.0 | 1.654 |
| 41417.0 | 1.624 |
| 41418.0 | 1.618 |
| 41421.0 | 1.634 |
| 41422.0 | 1.654 |
| 41423.0 | 1.629 |
| 41424.0 | 1.636 |
| 41425.0 | 1.62 |
| 41428.0 | 1.609 |
| 41429.0 | 1.613 |
| 41430.0 | 1.589 |
| 41431.0 | 1.571 |
| 41432.0 | 1.596 |
| 41435.0 | 1.594 |
| 41436.0 | 1.575 |
| 41437.0 | 1.566 |
| 41438.0 | 1.563 |
| 41439.0 | 1.566 |
| 41442.0 | 1.585 |
| 41443.0 | 1.584 |
| 41444.0 | 1.575 |
| 41445.0 | 1.522 |
| 41446.0 | 1.501 |
| 41449.0 | 1.479 |
| 41450.0 | 1.497 |
| 41451.0 | 1.531 |
| 41452.0 | 1.54 |
| 41453.0 | 1.531 |
| 41456.0 | 1.542 |
| 41457.0 | 1.531 |
| 41458.0 | 1.513 |
| 41459.0 | 1.555 |
| 41460.0 | 1.527 |
| 41463.0 | 1.557 |
| 41464.0 | 1.564 |
| 41465.0 | 1.562 |
| 41466.0 | 1.574 |
| 41467.0 | 1.57 |
| 41470.0 | 1.577 |
| 41471.0 | 1.565 |
| 41472.0 | 1.574 |
| 41473.0 | 1.593 |
| 41474.0 | 1.592 |
| 41477.0 | 1.597 |
| 41478.0 | 1.596 |
| 41479.0 | 1.611 |
| 41480.0 | 1.605 |
| 41481.0 | 1.606 |
| 41484.0 | 1.606 |
| 41485.0 | 1.615 |
| 41486.0 | 1.62 |
| 41487.0 | 1.641 |
| 41488.0 | 1.642 |
| 41491.0 | 1.641 |
| 41492.0 | 1.631 |
| 41493.0 | 1.633 |
| 41494.0 | 1.645 |
| 41495.0 | 1.649 |
| 41498.0 | 1.65 |
| 41499.0 | 1.657 |
| 41500.0 | 1.663 |
| 41501.0 | 1.654 |
| 41502.0 | 1.664 |
| 41505.0 | 1.648 |
| 41506.0 | 1.63 |
| 41507.0 | 1.623 |
| 41508.0 | 1.642 |
| 41509.0 | 1.649 |
| 41512.0 | 1.647 |
| 41513.0 | 1.61 |
| 41514.0 | 1.606 |
| 41515.0 | 1.614 |
| 41516.0 | 1.595 |
| 41519.0 | 1.623 |
| 41520.0 | 1.612 |
| 41521.0 | 1.614 |
| 41522.0 | 1.623 |
| 41523.0 | 1.638 |
| 41526.0 | 1.635 |
| 41527.0 | 1.662 |
| 41528.0 | 1.668 |
| 41529.0 | 1.668 |
| 41530.0 | 1.67 |
| 41533.0 | 1.684 |
| 41534.0 | 1.682 |
| 41535.0 | 1.691 |
| 41536.0 | 1.705 |
| 41537.0 | 1.7 |
| 41540.0 | 1.69 |
| 41541.0 | 1.698 |
| 41542.0 | 1.7 |
| 41543.0 | 1.698 |
| 41544.0 | 1.696 |
| 41547.0 | 1.683 |
| 41548.0 | 1.703 |
| 41549.0 | 1.696 |
| 41550.0 | 1.688 |
| 41551.0 | 1.701 |
| 41554.0 | 1.698 |
| 41555.0 | 1.688 |
| 41556.0 | 1.689 |
| 41557.0 | 1.721 |
| 41558.0 | 1.723 |
| 41561.0 | 1.725 |
| 41562.0 | 1.738 |
| 41563.0 | 1.743 |
| 41564.0 | 1.741 |
| 41565.0 | 1.752 |
| 41568.0 | 1.749 |
| 41569.0 | 1.757 |
| 41570.0 | 1.744 |
| 41571.0 | 1.754 |
| 41572.0 | 1.752 |
| 41575.0 | 1.746 |
| 41576.0 | 1.76 |
| 41577.0 | 1.755 |
| 41578.0 | 1.768 |
| 41579.0 | 1.761 |
| 41582.0 | 1.765 |
| 41583.0 | 1.753 |
| 41584.0 | 1.763 |
| 41585.0 | 1.756 |
| 41586.0 | 1.752 |
| 41589.0 | 1.761 |
| 41590.0 | 1.752 |
| 41591.0 | 1.746 |
| 41592.0 | 1.761 |
| 41593.0 | 1.762 |
| 41596.0 | 1.774 |
| 41597.0 | 1.759 |
| 41598.0 | 1.758 |
| 41599.0 | 1.757 |
| 41600.0 | 1.762 |
| 41603.0 | 1.77 |
| 41604.0 | 1.765 |
| 41605.0 | 1.775 |
| 41606.0 | 1.779 |
| 41607.0 | 1.777 |
| 41610.0 | 1.772 |
| 41611.0 | 1.742 |
| 41612.0 | 1.732 |
| 41613.0 | 1.713 |
| 41614.0 | 1.726 |
| 41617.0 | 1.73 |
| 41618.0 | 1.717 |
| 41619.0 | 1.71 |
| 41620.0 | 1.701 |
| 41621.0 | 1.698 |
| 41624.0 | 1.725 |
| 41625.0 | 1.707 |
| 41626.0 | 1.724 |
| 41627.0 | 1.751 |
| 41628.0 | 1.759 |
| 41631.0 | 1.769 |
| 41632.0 | 1.77 |
| 41635.0 | 1.788 |
| 41638.0 | 1.783 |
| 41639.0 | 1.787 |
| 41641.0 | 1.764 |
| 41642.0 | 1.771 |
| 41645.0 | 1.769 |
| 41646.0 | 1.788 |
| 41647.0 | 1.788 |
| 41648.0 | 1.778 |
| 41649.0 | 1.785 |
| 41652.0 | 1.789 |
| 41653.0 | 1.792 |
| 41654.0 | 1.815 |
| 41655.0 | 1.806 |
| 41656.0 | 1.808 |
| 41659.0 | 1.807 |
| 41660.0 | 1.807 |
| 41661.0 | 1.807 |
| 41662.0 | 1.791 |
| 41663.0 | 1.749 |
| 41666.0 | 1.743 |
| 41667.0 | 1.754 |
| 41668.0 | 1.741 |
| 41669.0 | 1.749 |
| 41670.0 | 1.742 |
| 41673.0 | 1.718 |
| 41674.0 | 1.717 |
| 41675.0 | 1.718 |
| 41676.0 | 1.741 |
| 41677.0 | 1.754 |
| 41680.0 | 1.751 |
| 41681.0 | 1.772 |
| 41682.0 | 1.781 |
| 41683.0 | 1.782 |
| 41684.0 | 1.792 |
| 41687.0 | 1.792 |
| 41688.0 | 1.791 |
| 41689.0 | 1.793 |
| 41690.0 | 1.793 |
| 41691.0 | 1.798 |
| 41694.0 | 1.809 |
| 41695.0 | 1.809 |
| 41696.0 | 1.805 |
| 41697.0 | 1.799 |
| 41698.0 | 1.806 |
| 41701.0 | 1.761 |
| 41702.0 | 1.8 |
| 41703.0 | 1.8 |
| 41704.0 | 1.804 |
| 41705.0 | 1.781 |
| 41708.0 | 1.78 |
| 41709.0 | 1.779 |
| 41710.0 | 1.767 |
| 41711.0 | 1.745 |
| 41712.0 | 1.738 |
| 41715.0 | 1.759 |
| 41716.0 | 1.771 |
| 41717.0 | 1.772 |
| 41718.0 | 1.778 |
| 41719.0 | 1.781 |
| 41722.0 | 1.761 |
| 41723.0 | 1.781 |
| 41724.0 | 1.797 |
| 41725.0 | 1.799 |
| 41726.0 | 1.816 |
| 41729.0 | 1.811 |
| 41730.0 | 1.823 |
| 41731.0 | 1.823 |
| 41732.0 | 1.832 |
| 41733.0 | 1.842 |
| 41736.0 | 1.822 |
| 41737.0 | 1.819 |
| 41738.0 | 1.821 |
| 41739.0 | 1.807 |
| 41740.0 | 1.791 |
| 41743.0 | 1.798 |
| 41744.0 | 1.779 |
| 41745.0 | 1.801 |
| 41746.0 | 1.809 |
| 41751.0 | 1.829 |
| 41752.0 | 1.818 |
| 41753.0 | 1.824 |
| 41754.0 | 1.805 |
| 41757.0 | 1.813 |
| 41758.0 | 1.833 |
| 41759.0 | 1.828 |
| 41760.0 | 1.828 |
| 41761.0 | 1.819 |
| 41764.0 | 1.816 |
| 41765.0 | 1.806 |
| 41766.0 | 1.81 |
| 41767.0 | 1.831 |
| 41768.0 | 1.822 |
| 41771.0 | 1.832 |
| 41772.0 | 1.834 |
| 41773.0 | 1.833 |
| 41774.0 | 1.812 |
| 41775.0 | 1.816 |
| 41778.0 | 1.815 |
| 41779.0 | 1.812 |
| 41780.0 | 1.823 |
| 41781.0 | 1.823 |
| 41782.0 | 1.83 |
| 41785.0 | 1.847 |
| 41786.0 | 1.849 |
| 41787.0 | 1.849 |
| 41788.0 | 1.849 |
| 41789.0 | 1.849 |
| 41792.0 | 1.85 |
| 41793.0 | 1.847 |
| 41794.0 | 1.846 |
| 41795.0 | 1.859 |
| 41796.0 | 1.871 |
| 41799.0 | 1.875 |
| 41800.0 | 1.879 |
| 41801.0 | 1.868 |
| 41802.0 | 1.866 |
| 41803.0 | 1.866 |
| 41806.0 | 1.856 |
| 41807.0 | 1.862 |
| 41808.0 | 1.864 |
| 41809.0 | 1.88 |
| 41810.0 | 1.874 |
| 41813.0 | 1.866 |
| 41814.0 | 1.866 |
| 41815.0 | 1.852 |
| 41816.0 | 1.844 |
| 41817.0 | 1.841 |
| 41820.0 | 1.841 |
| 41821.0 | 1.855 |
| 41822.0 | 1.852 |
| 41823.0 | 1.869 |
| 41824.0 | 1.86 |
| 41827.0 | 1.843 |
| 41828.0 | 1.822 |
| 41829.0 | 1.83 |
| 41830.0 | 1.806 |
| 41831.0 | 1.809 |
| 41834.0 | 1.822 |
| 41835.0 | 1.808 |
| 41836.0 | 1.83 |
| 41837.0 | 1.81 |
| 41838.0 | 1.813 |
| 41841.0 | 1.8 |
| 41842.0 | 1.824 |
| 41843.0 | 1.826 |
| 41844.0 | 1.838 |
| 41845.0 | 1.817 |
| 41848.0 | 1.816 |
| 41849.0 | 1.824 |
| 41850.0 | 1.815 |
| 41851.0 | 1.79 |
| 41852.0 | 1.77 |
| 41855.0 | 1.769 |
| 41856.0 | 1.77 |
| 41857.0 | 1.76 |
| 41858.0 | 1.742 |
| 41859.0 | 1.739 |
| 41862.0 | 1.758 |
| 41863.0 | 1.747 |
| 41864.0 | 1.762 |
| 41865.0 | 1.763 |
| 41866.0 | 1.752 |
| 41869.0 | 1.771 |
| 41870.0 | 1.779 |
| 41871.0 | 1.775 |
| 41872.0 | 1.794 |
| 41873.0 | 1.782 |
| 41876.0 | 1.813 |
| 41877.0 | 1.828 |
| 41878.0 | 1.826 |
| 41879.0 | 1.813 |
| 41880.0 | 1.816 |
| 41883.0 | 1.817 |
| 41884.0 | 1.82 |
| 41885.0 | 1.837 |
| 41886.0 | 1.863 |
| 41887.0 | 1.862 |
| 41890.0 | 1.859 |
| 41891.0 | 1.849 |
| 41892.0 | 1.849 |
| 41893.0 | 1.846 |
| 41894.0 | 1.844 |
| 41897.0 | 1.843 |
| 41898.0 | 1.839 |
| 41899.0 | 1.846 |
| 41900.0 | 1.861 |
| 41901.0 | 1.861 |
| 41904.0 | 1.854 |
| 41905.0 | 1.831 |
| 41906.0 | 1.848 |
| 41907.0 | 1.83 |
| 41908.0 | 1.838 |
| 41911.0 | 1.823 |
| 41912.0 | 1.84 |
| 41913.0 | 1.827 |
| 41914.0 | 1.786 |
| 41915.0 | 1.798 |
| 41918.0 | 1.801 |
| 41919.0 | 1.775 |
| 41920.0 | 1.761 |
| 41921.0 | 1.756 |
| 41922.0 | 1.732 |
| 41925.0 | 1.735 |
| 41926.0 | 1.736 |
| 41927.0 | 1.683 |
| 41928.0 | 1.674 |
| 41929.0 | 1.717 |
| 41932.0 | 1.7 |
| 41933.0 | 1.732 |
| 41934.0 | 1.74 |
| 41935.0 | 1.757 |
| 41936.0 | 1.75 |
| 41939.0 | 1.735 |
| 41940.0 | 1.753 |
| 41941.0 | 1.746 |
| 41942.0 | 1.753 |
| 41943.0 | 1.789 |
| 41946.0 | 1.775 |
| 41947.0 | 1.752 |
| 41948.0 | 1.779 |
| 41949.0 | 1.784 |
| 41950.0 | 1.767 |
| 41953.0 | 1.78 |
| 41954.0 | 1.785 |
| 41955.0 | 1.758 |
| 41956.0 | 1.763 |
| 41957.0 | 1.764 |
| 41960.0 | 1.776 |
| 41961.0 | 1.792 |
| 41962.0 | 1.794 |
| 41963.0 | 1.784 |
| 41964.0 | 1.826 |
| 41967.0 | 1.834 |
| 41968.0 | 1.841 |
| 41969.0 | 1.84 |
| 41970.0 | 1.849 |
| 41971.0 | 1.852 |
| 41974.0 | 1.844 |
| 41975.0 | 1.846 |
| 41976.0 | 1.85 |
| 41977.0 | 1.825 |
| 41978.0 | 1.863 |
| 41981.0 | 1.85 |
| 41982.0 | 1.812 |
| 41983.0 | 1.806 |
| 41984.0 | 1.81 |
| 41985.0 | 1.768 |
| 41988.0 | 1.727 |
| 41989.0 | 1.759 |
| 41990.0 | 1.76 |
| 41991.0 | 1.808 |
| 41992.0 | 1.802 |
| 41995.0 | 1.808 |
| 41996.0 | 1.825 |
| 41997.0 | 1.822 |
| 42002.0 | 1.822 |
| 42003.0 | 1.8 |
| 42004.0 | 1.804 |
| 42006.0 | 1.801 |
| 42009.0 | 1.747 |
| 42010.0 | 1.739 |
| 42011.0 | 1.748 |
| 42012.0 | 1.799 |
| 42013.0 | 1.756 |
| 42016.0 | 1.776 |
| 42017.0 | 1.799 |
| 42018.0 | 1.778 |
| 42019.0 | 1.809 |
| 42020.0 | 1.83 |
| 42023.0 | 1.838 |
| 42024.0 | 1.849 |
| 42025.0 | 1.86 |
| 42026.0 | 1.883 |
| 42027.0 | 1.909 |
| 42030.0 | 1.922 |
| 42031.0 | 1.905 |
| 42032.0 | 1.899 |
| 42033.0 | 1.904 |
| 42034.0 | 1.895 |
| 42037.0 | 1.903 |
| 42038.0 | 1.922 |
| 42039.0 | 1.923 |
| 42040.0 | 1.92 |
| 42041.0 | 1.915 |
| 42044.0 | 1.894 |
| 42045.0 | 1.909 |
| 42046.0 | 1.905 |
| 42047.0 | 1.924 |
| 42048.0 | 1.936 |
| 42051.0 | 1.93 |
| 42052.0 | 1.932 |
| 42053.0 | 1.944 |
| 42054.0 | 1.953 |
| 42055.0 | 1.954 |
| 42058.0 | 1.966 |
| 42059.0 | 1.977 |
| 42060.0 | 1.975 |
| 42061.0 | 1.989 |
| 42062.0 | 1.998 |
| 42065.0 | 1.995 |
| 42066.0 | 1.978 |
| 42067.0 | 1.992 |
| 42068.0 | 2.006 |
| 42069.0 | 2.006 |
| 42072.0 | 2.003 |
| 42073.0 | 1.986 |
| 42074.0 | 2.018 |
| 42075.0 | 2.015 |
| 42076.0 | 2.021 |
| 42079.0 | 2.041 |
| 42080.0 | 2.027 |
| 42081.0 | 2.026 |
| 42082.0 | 2.027 |
| 42083.0 | 2.048 |
| 42086.0 | 2.038 |
| 42087.0 | 2.05 |
| 42088.0 | 2.032 |
| 42089.0 | 2.026 |
| 42090.0 | 2.03 |
| 42093.0 | 2.049 |
| 42094.0 | 2.037 |
| 42095.0 | 2.044 |
| 42096.0 | 2.044 |
| 42101.0 | 2.065 |
| 42102.0 | 2.055 |
| 42103.0 | 2.07 |
| 42104.0 | 2.083 |
| 42107.0 | 2.088 |
| 42108.0 | 2.071 |
| 42109.0 | 2.078 |
| 42110.0 | 2.058 |
| 42111.0 | 2.028 |
| 42114.0 | 2.045 |
| 42115.0 | 2.046 |
| 42116.0 | 2.048 |
| 42117.0 | 2.037 |
| 42118.0 | 2.044 |
| 42121.0 | 2.066 |
| 42122.0 | 2.044 |
| 42123.0 | 2.006 |
| 42124.0 | 2.005 |
| 42125.0 | 2.005 |
| 42128.0 | 2.012 |
| 42129.0 | 1.977 |
| 42130.0 | 1.982 |
| 42131.0 | 1.981 |
| 42132.0 | 2.018 |
| 42135.0 | 2.008 |
| 42136.0 | 1.988 |
| 42137.0 | 1.98 |
| 42138.0 | 2 |
| 42139.0 | 1.988 |
| 42142.0 | 1.994 |
| 42143.0 | 2.027 |
| 42144.0 | 2.032 |
| 42145.0 | 2.034 |
| 42146.0 | 2.03 |
| 42149.0 | 2.021 |
| 42150.0 | 2.006 |
| 42151.0 | 2.032 |
| 42152.0 | 2.019 |
| 42153.0 | 1.987 |
| 42156.0 | 1.989 |
| 42157.0 | 1.983 |
| 42158.0 | 1.992 |
| 42159.0 | 1.981 |
| 42160.0 | 1.962 |
| 42163.0 | 1.945 |
| 42164.0 | 1.94 |
| 42165.0 | 1.969 |
| 42166.0 | 1.979 |
| 42167.0 | 1.959 |
| 42170.0 | 1.932 |
| 42171.0 | 1.939 |
| 42172.0 | 1.928 |
| 42173.0 | 1.937 |
| 42174.0 | 1.94 |
| 42177.0 | 1.997 |
| 42178.0 | 2.009 |
| 42179.0 | 2.003 |
| 42180.0 | 2.003 |
| 42181.0 | 2.007 |
| 42184.0 | 1.945 |
| 42185.0 | 1.926 |
| 42186.0 | 1.957 |
| 42187.0 | 1.943 |
| 42188.0 | 1.934 |
| 42191.0 | 1.901 |
| 42192.0 | 1.871 |
| 42193.0 | 1.885 |
| 42194.0 | 1.925 |
| 42195.0 | 1.97 |
| 42198.0 | 1.995 |
| 42199.0 | 2.002 |
| 42200.0 | 2.008 |
| 42201.0 | 2.029 |
| 42202.0 | 2.027 |
| 42205.0 | 2.033 |
| 42206.0 | 2.018 |
| 42207.0 | 2.013 |
| 42208.0 | 2.013 |
| 42209.0 | 1.999 |
| 42212.0 | 1.963 |
| 42213.0 | 1.98 |
| 42214.0 | 1.989 |
| 42215.0 | 1.992 |
| 42216.0 | 1.999 |
| 42219.0 | 2.013 |
| 42220.0 | 2.006 |
| 42221.0 | 2.029 |
| 42222.0 | 2.026 |
| 42223.0 | 2.014 |
| 42226.0 | 2.028 |
| 42227.0 | 2.001 |
| 42228.0 | 1.952 |
| 42229.0 | 1.965 |
| 42230.0 | 1.954 |
| 42233.0 | 1.957 |
| 42234.0 | 1.956 |
| 42235.0 | 1.929 |
| 42236.0 | 1.896 |
| 42237.0 | 1.85 |
| 42240.0 | 1.771 |
| 42241.0 | 1.837 |
| 42242.0 | 1.816 |
| 42243.0 | 1.865 |
| 42244.0 | 1.867 |
| 42247.0 | 1.86 |
| 42248.0 | 1.824 |
| 42249.0 | 1.828 |
| 42250.0 | 1.86 |
| 42251.0 | 1.82 |
| 42254.0 | 1.828 |
| 42256.0 | 1.86 |
| 42257.0 | 1.838 |
| 42258.0 | 1.823 |
| 42261.0 | 1.818 |
| 42268.0 | 1.822 |
| 42269.0 | 1.772 |
| 42270.0 | 1.774 |
| 42271.0 | 1.745 |
| 42272.0 | 1.789 |
| 42275.0 | 1.754 |
| 42276.0 | 1.75 |
| 42277.0 | 1.783 |
| 42282.0 | 1.824 |
| 42285.0 | 1.84 |
| 42286.0 | 1.851 |